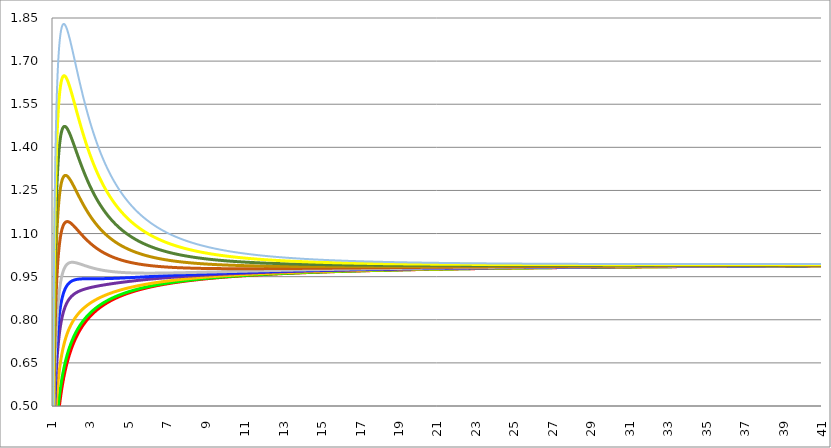
| Category | Series 1 | Series 0 | Series 3 | Series 4 | Series 5 | Series 2 | Series 6 | Series 7 | Series 8 | Series 9 | Series 10 |
|---|---|---|---|---|---|---|---|---|---|---|---|
| 1.0 | 0 | 0 | 0 | 0 | 0 | 0 | 0 | 0 | 0 | 0 | 0 |
| 1.02 | 0.14 | 0.156 | 0.196 | 0.249 | 0.276 | 0.308 | 0.371 | 0.435 | 0.5 | 0.567 | 0.633 |
| 1.04 | 0.196 | 0.218 | 0.272 | 0.344 | 0.381 | 0.425 | 0.511 | 0.599 | 0.689 | 0.779 | 0.871 |
| 1.06 | 0.238 | 0.263 | 0.327 | 0.412 | 0.456 | 0.508 | 0.609 | 0.714 | 0.821 | 0.929 | 1.038 |
| 1.08 | 0.272 | 0.3 | 0.371 | 0.466 | 0.514 | 0.573 | 0.686 | 0.804 | 0.923 | 1.044 | 1.166 |
| 1.1 | 0.302 | 0.331 | 0.407 | 0.51 | 0.562 | 0.626 | 0.749 | 0.876 | 1.006 | 1.137 | 1.27 |
| 1.12 | 0.327 | 0.358 | 0.439 | 0.547 | 0.603 | 0.67 | 0.801 | 0.936 | 1.074 | 1.214 | 1.355 |
| 1.14 | 0.35 | 0.383 | 0.466 | 0.579 | 0.637 | 0.708 | 0.845 | 0.987 | 1.132 | 1.279 | 1.427 |
| 1.16 | 0.371 | 0.404 | 0.49 | 0.607 | 0.667 | 0.74 | 0.882 | 1.03 | 1.181 | 1.333 | 1.488 |
| 1.18 | 0.391 | 0.424 | 0.512 | 0.632 | 0.694 | 0.769 | 0.915 | 1.067 | 1.223 | 1.38 | 1.54 |
| 1.2 | 0.408 | 0.442 | 0.531 | 0.654 | 0.717 | 0.793 | 0.943 | 1.099 | 1.259 | 1.421 | 1.584 |
| 1.22 | 0.425 | 0.459 | 0.549 | 0.673 | 0.737 | 0.815 | 0.968 | 1.127 | 1.29 | 1.456 | 1.623 |
| 1.24 | 0.44 | 0.474 | 0.565 | 0.69 | 0.756 | 0.835 | 0.99 | 1.152 | 1.317 | 1.486 | 1.656 |
| 1.26 | 0.454 | 0.489 | 0.58 | 0.706 | 0.772 | 0.852 | 1.009 | 1.173 | 1.341 | 1.512 | 1.685 |
| 1.28 | 0.468 | 0.502 | 0.594 | 0.721 | 0.787 | 0.868 | 1.026 | 1.192 | 1.362 | 1.535 | 1.71 |
| 1.3 | 0.48 | 0.515 | 0.606 | 0.733 | 0.8 | 0.881 | 1.041 | 1.208 | 1.38 | 1.554 | 1.731 |
| 1.32 | 0.492 | 0.527 | 0.618 | 0.745 | 0.812 | 0.894 | 1.055 | 1.223 | 1.395 | 1.571 | 1.749 |
| 1.34 | 0.504 | 0.538 | 0.629 | 0.756 | 0.823 | 0.905 | 1.066 | 1.235 | 1.409 | 1.586 | 1.765 |
| 1.36 | 0.514 | 0.548 | 0.639 | 0.766 | 0.833 | 0.915 | 1.077 | 1.246 | 1.421 | 1.598 | 1.778 |
| 1.38 | 0.525 | 0.558 | 0.648 | 0.775 | 0.842 | 0.924 | 1.086 | 1.256 | 1.431 | 1.609 | 1.79 |
| 1.4 | 0.535 | 0.568 | 0.657 | 0.783 | 0.85 | 0.932 | 1.094 | 1.264 | 1.439 | 1.618 | 1.799 |
| 1.42 | 0.544 | 0.577 | 0.665 | 0.791 | 0.858 | 0.939 | 1.101 | 1.271 | 1.447 | 1.626 | 1.807 |
| 1.44 | 0.553 | 0.585 | 0.673 | 0.798 | 0.865 | 0.946 | 1.107 | 1.277 | 1.453 | 1.632 | 1.814 |
| 1.46 | 0.561 | 0.593 | 0.68 | 0.805 | 0.871 | 0.952 | 1.113 | 1.283 | 1.458 | 1.637 | 1.819 |
| 1.48 | 0.569 | 0.601 | 0.687 | 0.811 | 0.877 | 0.957 | 1.118 | 1.287 | 1.462 | 1.641 | 1.823 |
| 1.5 | 0.577 | 0.609 | 0.694 | 0.816 | 0.882 | 0.962 | 1.122 | 1.291 | 1.466 | 1.644 | 1.826 |
| 1.52 | 0.585 | 0.616 | 0.7 | 0.822 | 0.887 | 0.967 | 1.126 | 1.294 | 1.468 | 1.647 | 1.828 |
| 1.54 | 0.592 | 0.623 | 0.706 | 0.827 | 0.891 | 0.971 | 1.129 | 1.297 | 1.47 | 1.648 | 1.829 |
| 1.56 | 0.599 | 0.629 | 0.712 | 0.831 | 0.895 | 0.974 | 1.132 | 1.299 | 1.472 | 1.649 | 1.829 |
| 1.58 | 0.606 | 0.635 | 0.717 | 0.835 | 0.899 | 0.977 | 1.134 | 1.3 | 1.473 | 1.649 | 1.829 |
| 1.6 | 0.612 | 0.642 | 0.722 | 0.839 | 0.902 | 0.98 | 1.136 | 1.301 | 1.473 | 1.649 | 1.828 |
| 1.62 | 0.619 | 0.647 | 0.727 | 0.843 | 0.906 | 0.983 | 1.138 | 1.302 | 1.473 | 1.648 | 1.826 |
| 1.64 | 0.625 | 0.653 | 0.732 | 0.847 | 0.909 | 0.985 | 1.139 | 1.302 | 1.472 | 1.647 | 1.824 |
| 1.66 | 0.631 | 0.659 | 0.736 | 0.85 | 0.911 | 0.987 | 1.14 | 1.302 | 1.471 | 1.645 | 1.822 |
| 1.68 | 0.636 | 0.664 | 0.74 | 0.853 | 0.914 | 0.989 | 1.141 | 1.302 | 1.47 | 1.643 | 1.819 |
| 1.700000000000001 | 0.642 | 0.669 | 0.744 | 0.856 | 0.916 | 0.991 | 1.141 | 1.302 | 1.469 | 1.641 | 1.816 |
| 1.720000000000001 | 0.647 | 0.674 | 0.748 | 0.858 | 0.918 | 0.992 | 1.141 | 1.301 | 1.467 | 1.638 | 1.812 |
| 1.740000000000001 | 0.652 | 0.679 | 0.752 | 0.861 | 0.92 | 0.994 | 1.142 | 1.3 | 1.465 | 1.635 | 1.808 |
| 1.760000000000001 | 0.657 | 0.683 | 0.756 | 0.863 | 0.922 | 0.995 | 1.142 | 1.299 | 1.463 | 1.632 | 1.804 |
| 1.780000000000001 | 0.662 | 0.688 | 0.759 | 0.866 | 0.924 | 0.996 | 1.141 | 1.297 | 1.46 | 1.628 | 1.8 |
| 1.800000000000001 | 0.667 | 0.692 | 0.763 | 0.868 | 0.925 | 0.997 | 1.141 | 1.296 | 1.458 | 1.625 | 1.795 |
| 1.820000000000001 | 0.671 | 0.696 | 0.766 | 0.87 | 0.927 | 0.997 | 1.14 | 1.294 | 1.455 | 1.621 | 1.79 |
| 1.840000000000001 | 0.676 | 0.7 | 0.769 | 0.872 | 0.928 | 0.998 | 1.14 | 1.292 | 1.452 | 1.617 | 1.785 |
| 1.860000000000001 | 0.68 | 0.704 | 0.772 | 0.874 | 0.929 | 0.998 | 1.139 | 1.29 | 1.449 | 1.613 | 1.78 |
| 1.880000000000001 | 0.684 | 0.708 | 0.775 | 0.875 | 0.93 | 0.999 | 1.138 | 1.288 | 1.446 | 1.608 | 1.775 |
| 1.900000000000001 | 0.688 | 0.712 | 0.778 | 0.877 | 0.931 | 0.999 | 1.137 | 1.286 | 1.443 | 1.604 | 1.769 |
| 1.920000000000001 | 0.692 | 0.715 | 0.78 | 0.878 | 0.932 | 1 | 1.136 | 1.284 | 1.439 | 1.6 | 1.764 |
| 1.940000000000001 | 0.696 | 0.719 | 0.783 | 0.88 | 0.933 | 1 | 1.135 | 1.282 | 1.436 | 1.595 | 1.758 |
| 1.960000000000001 | 0.7 | 0.722 | 0.786 | 0.881 | 0.934 | 1 | 1.134 | 1.28 | 1.432 | 1.591 | 1.753 |
| 1.980000000000001 | 0.704 | 0.726 | 0.788 | 0.883 | 0.935 | 1 | 1.133 | 1.277 | 1.429 | 1.586 | 1.747 |
| 2.000000000000001 | 0.707 | 0.729 | 0.791 | 0.884 | 0.935 | 1 | 1.132 | 1.275 | 1.425 | 1.581 | 1.741 |
| 2.020000000000001 | 0.711 | 0.732 | 0.793 | 0.885 | 0.936 | 1 | 1.131 | 1.272 | 1.422 | 1.576 | 1.735 |
| 2.040000000000001 | 0.714 | 0.735 | 0.795 | 0.886 | 0.937 | 1 | 1.129 | 1.27 | 1.418 | 1.572 | 1.729 |
| 2.060000000000001 | 0.717 | 0.738 | 0.797 | 0.887 | 0.937 | 1 | 1.128 | 1.267 | 1.414 | 1.567 | 1.723 |
| 2.080000000000001 | 0.721 | 0.741 | 0.8 | 0.888 | 0.938 | 1 | 1.127 | 1.265 | 1.41 | 1.562 | 1.717 |
| 2.100000000000001 | 0.724 | 0.744 | 0.802 | 0.889 | 0.938 | 0.999 | 1.125 | 1.262 | 1.407 | 1.557 | 1.711 |
| 2.120000000000001 | 0.727 | 0.747 | 0.804 | 0.89 | 0.939 | 0.999 | 1.124 | 1.259 | 1.403 | 1.552 | 1.705 |
| 2.140000000000001 | 0.73 | 0.75 | 0.806 | 0.891 | 0.939 | 0.999 | 1.122 | 1.257 | 1.399 | 1.547 | 1.699 |
| 2.160000000000001 | 0.733 | 0.752 | 0.808 | 0.892 | 0.939 | 0.999 | 1.121 | 1.254 | 1.395 | 1.542 | 1.693 |
| 2.180000000000001 | 0.736 | 0.755 | 0.809 | 0.893 | 0.94 | 0.998 | 1.119 | 1.252 | 1.392 | 1.537 | 1.688 |
| 2.200000000000001 | 0.739 | 0.757 | 0.811 | 0.894 | 0.94 | 0.998 | 1.118 | 1.249 | 1.388 | 1.533 | 1.682 |
| 2.220000000000001 | 0.741 | 0.76 | 0.813 | 0.895 | 0.94 | 0.998 | 1.116 | 1.246 | 1.384 | 1.528 | 1.676 |
| 2.240000000000001 | 0.744 | 0.762 | 0.815 | 0.895 | 0.941 | 0.997 | 1.115 | 1.244 | 1.38 | 1.523 | 1.67 |
| 2.260000000000001 | 0.747 | 0.765 | 0.817 | 0.896 | 0.941 | 0.997 | 1.113 | 1.241 | 1.376 | 1.518 | 1.664 |
| 2.280000000000001 | 0.749 | 0.767 | 0.818 | 0.897 | 0.941 | 0.997 | 1.112 | 1.238 | 1.373 | 1.513 | 1.658 |
| 2.300000000000001 | 0.752 | 0.769 | 0.82 | 0.898 | 0.941 | 0.996 | 1.11 | 1.236 | 1.369 | 1.508 | 1.652 |
| 2.320000000000001 | 0.754 | 0.772 | 0.821 | 0.898 | 0.941 | 0.996 | 1.109 | 1.233 | 1.365 | 1.503 | 1.646 |
| 2.340000000000001 | 0.757 | 0.774 | 0.823 | 0.899 | 0.941 | 0.995 | 1.107 | 1.23 | 1.362 | 1.499 | 1.64 |
| 2.360000000000001 | 0.759 | 0.776 | 0.824 | 0.899 | 0.942 | 0.995 | 1.106 | 1.228 | 1.358 | 1.494 | 1.634 |
| 2.380000000000001 | 0.761 | 0.778 | 0.826 | 0.9 | 0.942 | 0.995 | 1.104 | 1.225 | 1.354 | 1.489 | 1.629 |
| 2.400000000000001 | 0.764 | 0.78 | 0.827 | 0.901 | 0.942 | 0.994 | 1.103 | 1.223 | 1.351 | 1.484 | 1.623 |
| 2.420000000000001 | 0.766 | 0.782 | 0.829 | 0.901 | 0.942 | 0.994 | 1.101 | 1.22 | 1.347 | 1.48 | 1.617 |
| 2.440000000000001 | 0.768 | 0.784 | 0.83 | 0.902 | 0.942 | 0.993 | 1.1 | 1.218 | 1.343 | 1.475 | 1.612 |
| 2.460000000000001 | 0.77 | 0.786 | 0.832 | 0.902 | 0.942 | 0.993 | 1.098 | 1.215 | 1.34 | 1.471 | 1.606 |
| 2.480000000000001 | 0.773 | 0.788 | 0.833 | 0.903 | 0.942 | 0.992 | 1.097 | 1.212 | 1.336 | 1.466 | 1.601 |
| 2.500000000000001 | 0.775 | 0.79 | 0.834 | 0.903 | 0.942 | 0.992 | 1.095 | 1.21 | 1.333 | 1.462 | 1.595 |
| 2.520000000000001 | 0.777 | 0.792 | 0.836 | 0.904 | 0.942 | 0.992 | 1.094 | 1.207 | 1.329 | 1.457 | 1.59 |
| 2.540000000000001 | 0.779 | 0.794 | 0.837 | 0.904 | 0.942 | 0.991 | 1.093 | 1.205 | 1.326 | 1.453 | 1.584 |
| 2.560000000000001 | 0.781 | 0.795 | 0.838 | 0.905 | 0.943 | 0.991 | 1.091 | 1.203 | 1.322 | 1.448 | 1.579 |
| 2.580000000000001 | 0.783 | 0.797 | 0.839 | 0.905 | 0.943 | 0.99 | 1.09 | 1.2 | 1.319 | 1.444 | 1.573 |
| 2.600000000000001 | 0.784 | 0.799 | 0.84 | 0.906 | 0.943 | 0.99 | 1.088 | 1.198 | 1.316 | 1.439 | 1.568 |
| 2.620000000000001 | 0.786 | 0.801 | 0.842 | 0.906 | 0.943 | 0.989 | 1.087 | 1.195 | 1.312 | 1.435 | 1.563 |
| 2.640000000000001 | 0.788 | 0.802 | 0.843 | 0.907 | 0.943 | 0.989 | 1.085 | 1.193 | 1.309 | 1.431 | 1.558 |
| 2.660000000000001 | 0.79 | 0.804 | 0.844 | 0.907 | 0.943 | 0.988 | 1.084 | 1.191 | 1.306 | 1.427 | 1.552 |
| 2.680000000000001 | 0.792 | 0.805 | 0.845 | 0.907 | 0.943 | 0.988 | 1.083 | 1.188 | 1.302 | 1.422 | 1.547 |
| 2.700000000000001 | 0.793 | 0.807 | 0.846 | 0.908 | 0.943 | 0.987 | 1.081 | 1.186 | 1.299 | 1.418 | 1.542 |
| 2.720000000000001 | 0.795 | 0.809 | 0.847 | 0.908 | 0.943 | 0.987 | 1.08 | 1.184 | 1.296 | 1.414 | 1.537 |
| 2.740000000000001 | 0.797 | 0.81 | 0.848 | 0.908 | 0.943 | 0.987 | 1.079 | 1.182 | 1.293 | 1.41 | 1.532 |
| 2.760000000000001 | 0.799 | 0.812 | 0.849 | 0.909 | 0.943 | 0.986 | 1.077 | 1.179 | 1.29 | 1.406 | 1.527 |
| 2.780000000000001 | 0.8 | 0.813 | 0.85 | 0.909 | 0.943 | 0.986 | 1.076 | 1.177 | 1.287 | 1.402 | 1.522 |
| 2.800000000000002 | 0.802 | 0.814 | 0.851 | 0.91 | 0.943 | 0.985 | 1.075 | 1.175 | 1.283 | 1.398 | 1.518 |
| 2.820000000000002 | 0.803 | 0.816 | 0.852 | 0.91 | 0.943 | 0.985 | 1.074 | 1.173 | 1.28 | 1.394 | 1.513 |
| 2.840000000000002 | 0.805 | 0.817 | 0.853 | 0.91 | 0.943 | 0.984 | 1.072 | 1.171 | 1.277 | 1.39 | 1.508 |
| 2.860000000000002 | 0.806 | 0.819 | 0.854 | 0.911 | 0.943 | 0.984 | 1.071 | 1.169 | 1.274 | 1.387 | 1.503 |
| 2.880000000000002 | 0.808 | 0.82 | 0.855 | 0.911 | 0.943 | 0.984 | 1.07 | 1.167 | 1.272 | 1.383 | 1.499 |
| 2.900000000000002 | 0.809 | 0.821 | 0.856 | 0.911 | 0.943 | 0.983 | 1.069 | 1.165 | 1.269 | 1.379 | 1.494 |
| 2.920000000000002 | 0.811 | 0.823 | 0.857 | 0.912 | 0.943 | 0.983 | 1.067 | 1.163 | 1.266 | 1.375 | 1.49 |
| 2.940000000000002 | 0.812 | 0.824 | 0.858 | 0.912 | 0.943 | 0.982 | 1.066 | 1.161 | 1.263 | 1.372 | 1.485 |
| 2.960000000000002 | 0.814 | 0.825 | 0.859 | 0.912 | 0.943 | 0.982 | 1.065 | 1.159 | 1.26 | 1.368 | 1.481 |
| 2.980000000000002 | 0.815 | 0.827 | 0.86 | 0.913 | 0.943 | 0.982 | 1.064 | 1.157 | 1.257 | 1.364 | 1.476 |
| 3.000000000000002 | 0.816 | 0.828 | 0.861 | 0.913 | 0.943 | 0.981 | 1.063 | 1.155 | 1.255 | 1.361 | 1.472 |
| 3.020000000000002 | 0.818 | 0.829 | 0.862 | 0.913 | 0.943 | 0.981 | 1.062 | 1.153 | 1.252 | 1.357 | 1.468 |
| 3.040000000000002 | 0.819 | 0.83 | 0.862 | 0.913 | 0.943 | 0.981 | 1.061 | 1.151 | 1.249 | 1.354 | 1.463 |
| 3.060000000000002 | 0.82 | 0.831 | 0.863 | 0.914 | 0.943 | 0.98 | 1.06 | 1.149 | 1.247 | 1.35 | 1.459 |
| 3.080000000000002 | 0.822 | 0.833 | 0.864 | 0.914 | 0.943 | 0.98 | 1.058 | 1.147 | 1.244 | 1.347 | 1.455 |
| 3.100000000000002 | 0.823 | 0.834 | 0.865 | 0.914 | 0.943 | 0.979 | 1.057 | 1.145 | 1.241 | 1.344 | 1.451 |
| 3.120000000000002 | 0.824 | 0.835 | 0.866 | 0.915 | 0.943 | 0.979 | 1.056 | 1.144 | 1.239 | 1.34 | 1.447 |
| 3.140000000000002 | 0.826 | 0.836 | 0.866 | 0.915 | 0.943 | 0.979 | 1.055 | 1.142 | 1.236 | 1.337 | 1.443 |
| 3.160000000000002 | 0.827 | 0.837 | 0.867 | 0.915 | 0.943 | 0.978 | 1.054 | 1.14 | 1.234 | 1.334 | 1.439 |
| 3.180000000000002 | 0.828 | 0.838 | 0.868 | 0.915 | 0.943 | 0.978 | 1.053 | 1.138 | 1.231 | 1.33 | 1.435 |
| 3.200000000000002 | 0.829 | 0.839 | 0.869 | 0.916 | 0.943 | 0.978 | 1.052 | 1.137 | 1.229 | 1.327 | 1.431 |
| 3.220000000000002 | 0.83 | 0.84 | 0.869 | 0.916 | 0.943 | 0.977 | 1.051 | 1.135 | 1.226 | 1.324 | 1.427 |
| 3.240000000000002 | 0.831 | 0.841 | 0.87 | 0.916 | 0.943 | 0.977 | 1.05 | 1.133 | 1.224 | 1.321 | 1.423 |
| 3.260000000000002 | 0.833 | 0.842 | 0.871 | 0.917 | 0.943 | 0.977 | 1.049 | 1.132 | 1.222 | 1.318 | 1.419 |
| 3.280000000000002 | 0.834 | 0.843 | 0.872 | 0.917 | 0.943 | 0.977 | 1.048 | 1.13 | 1.219 | 1.315 | 1.415 |
| 3.300000000000002 | 0.835 | 0.844 | 0.872 | 0.917 | 0.943 | 0.976 | 1.047 | 1.128 | 1.217 | 1.312 | 1.412 |
| 3.320000000000002 | 0.836 | 0.845 | 0.873 | 0.917 | 0.943 | 0.976 | 1.046 | 1.127 | 1.215 | 1.309 | 1.408 |
| 3.340000000000002 | 0.837 | 0.846 | 0.874 | 0.918 | 0.943 | 0.976 | 1.046 | 1.125 | 1.212 | 1.306 | 1.404 |
| 3.360000000000002 | 0.838 | 0.847 | 0.874 | 0.918 | 0.943 | 0.975 | 1.045 | 1.124 | 1.21 | 1.303 | 1.401 |
| 3.380000000000002 | 0.839 | 0.848 | 0.875 | 0.918 | 0.943 | 0.975 | 1.044 | 1.122 | 1.208 | 1.3 | 1.397 |
| 3.400000000000002 | 0.84 | 0.849 | 0.876 | 0.918 | 0.943 | 0.975 | 1.043 | 1.12 | 1.206 | 1.297 | 1.394 |
| 3.420000000000002 | 0.841 | 0.85 | 0.876 | 0.919 | 0.943 | 0.974 | 1.042 | 1.119 | 1.204 | 1.294 | 1.39 |
| 3.440000000000002 | 0.842 | 0.851 | 0.877 | 0.919 | 0.943 | 0.974 | 1.041 | 1.117 | 1.201 | 1.292 | 1.387 |
| 3.460000000000002 | 0.843 | 0.852 | 0.878 | 0.919 | 0.943 | 0.974 | 1.04 | 1.116 | 1.199 | 1.289 | 1.383 |
| 3.480000000000002 | 0.844 | 0.853 | 0.878 | 0.919 | 0.943 | 0.974 | 1.039 | 1.115 | 1.197 | 1.286 | 1.38 |
| 3.500000000000002 | 0.845 | 0.854 | 0.879 | 0.92 | 0.943 | 0.973 | 1.039 | 1.113 | 1.195 | 1.283 | 1.377 |
| 3.520000000000002 | 0.846 | 0.855 | 0.88 | 0.92 | 0.943 | 0.973 | 1.038 | 1.112 | 1.193 | 1.281 | 1.373 |
| 3.540000000000002 | 0.847 | 0.855 | 0.88 | 0.92 | 0.943 | 0.973 | 1.037 | 1.11 | 1.191 | 1.278 | 1.37 |
| 3.560000000000002 | 0.848 | 0.856 | 0.881 | 0.92 | 0.943 | 0.973 | 1.036 | 1.109 | 1.189 | 1.276 | 1.367 |
| 3.580000000000002 | 0.849 | 0.857 | 0.881 | 0.92 | 0.943 | 0.972 | 1.035 | 1.108 | 1.187 | 1.273 | 1.364 |
| 3.600000000000002 | 0.85 | 0.858 | 0.882 | 0.921 | 0.943 | 0.972 | 1.035 | 1.106 | 1.185 | 1.27 | 1.36 |
| 3.620000000000002 | 0.851 | 0.859 | 0.883 | 0.921 | 0.943 | 0.972 | 1.034 | 1.105 | 1.183 | 1.268 | 1.357 |
| 3.640000000000002 | 0.852 | 0.86 | 0.883 | 0.921 | 0.943 | 0.972 | 1.033 | 1.104 | 1.181 | 1.265 | 1.354 |
| 3.660000000000002 | 0.853 | 0.86 | 0.884 | 0.921 | 0.943 | 0.971 | 1.032 | 1.102 | 1.18 | 1.263 | 1.351 |
| 3.680000000000002 | 0.853 | 0.861 | 0.884 | 0.922 | 0.943 | 0.971 | 1.032 | 1.101 | 1.178 | 1.26 | 1.348 |
| 3.700000000000002 | 0.854 | 0.862 | 0.885 | 0.922 | 0.943 | 0.971 | 1.031 | 1.1 | 1.176 | 1.258 | 1.345 |
| 3.720000000000002 | 0.855 | 0.863 | 0.885 | 0.922 | 0.943 | 0.971 | 1.03 | 1.099 | 1.174 | 1.256 | 1.342 |
| 3.740000000000002 | 0.856 | 0.864 | 0.886 | 0.922 | 0.943 | 0.971 | 1.03 | 1.097 | 1.172 | 1.253 | 1.339 |
| 3.760000000000002 | 0.857 | 0.864 | 0.887 | 0.922 | 0.943 | 0.97 | 1.029 | 1.096 | 1.171 | 1.251 | 1.336 |
| 3.780000000000002 | 0.858 | 0.865 | 0.887 | 0.923 | 0.943 | 0.97 | 1.028 | 1.095 | 1.169 | 1.249 | 1.333 |
| 3.800000000000002 | 0.858 | 0.866 | 0.888 | 0.923 | 0.943 | 0.97 | 1.028 | 1.094 | 1.167 | 1.246 | 1.33 |
| 3.820000000000002 | 0.859 | 0.867 | 0.888 | 0.923 | 0.943 | 0.97 | 1.027 | 1.092 | 1.165 | 1.244 | 1.328 |
| 3.840000000000002 | 0.86 | 0.867 | 0.889 | 0.923 | 0.943 | 0.97 | 1.026 | 1.091 | 1.164 | 1.242 | 1.325 |
| 3.860000000000002 | 0.861 | 0.868 | 0.889 | 0.923 | 0.943 | 0.969 | 1.026 | 1.09 | 1.162 | 1.24 | 1.322 |
| 3.880000000000002 | 0.862 | 0.869 | 0.89 | 0.924 | 0.943 | 0.969 | 1.025 | 1.089 | 1.16 | 1.237 | 1.319 |
| 3.900000000000003 | 0.862 | 0.869 | 0.89 | 0.924 | 0.944 | 0.969 | 1.024 | 1.088 | 1.159 | 1.235 | 1.317 |
| 3.920000000000003 | 0.863 | 0.87 | 0.891 | 0.924 | 0.944 | 0.969 | 1.024 | 1.087 | 1.157 | 1.233 | 1.314 |
| 3.940000000000003 | 0.864 | 0.871 | 0.891 | 0.924 | 0.944 | 0.969 | 1.023 | 1.086 | 1.155 | 1.231 | 1.311 |
| 3.960000000000003 | 0.865 | 0.871 | 0.892 | 0.925 | 0.944 | 0.969 | 1.022 | 1.085 | 1.154 | 1.229 | 1.309 |
| 3.980000000000003 | 0.865 | 0.872 | 0.892 | 0.925 | 0.944 | 0.968 | 1.022 | 1.084 | 1.152 | 1.227 | 1.306 |
| 4.000000000000003 | 0.866 | 0.873 | 0.893 | 0.925 | 0.944 | 0.968 | 1.021 | 1.083 | 1.151 | 1.225 | 1.304 |
| 4.020000000000002 | 0.867 | 0.873 | 0.893 | 0.925 | 0.944 | 0.968 | 1.021 | 1.081 | 1.149 | 1.223 | 1.301 |
| 4.040000000000002 | 0.867 | 0.874 | 0.894 | 0.925 | 0.944 | 0.968 | 1.02 | 1.08 | 1.148 | 1.221 | 1.298 |
| 4.060000000000001 | 0.868 | 0.875 | 0.894 | 0.926 | 0.944 | 0.968 | 1.02 | 1.079 | 1.146 | 1.219 | 1.296 |
| 4.080000000000001 | 0.869 | 0.875 | 0.895 | 0.926 | 0.944 | 0.968 | 1.019 | 1.078 | 1.145 | 1.217 | 1.294 |
| 4.100000000000001 | 0.87 | 0.876 | 0.895 | 0.926 | 0.944 | 0.967 | 1.018 | 1.077 | 1.143 | 1.215 | 1.291 |
| 4.12 | 0.87 | 0.877 | 0.895 | 0.926 | 0.944 | 0.967 | 1.018 | 1.076 | 1.142 | 1.213 | 1.289 |
| 4.14 | 0.871 | 0.877 | 0.896 | 0.926 | 0.944 | 0.967 | 1.017 | 1.076 | 1.14 | 1.211 | 1.286 |
| 4.159999999999999 | 0.872 | 0.878 | 0.896 | 0.926 | 0.944 | 0.967 | 1.017 | 1.075 | 1.139 | 1.209 | 1.284 |
| 4.179999999999999 | 0.872 | 0.878 | 0.897 | 0.927 | 0.944 | 0.967 | 1.016 | 1.074 | 1.138 | 1.207 | 1.282 |
| 4.199999999999998 | 0.873 | 0.879 | 0.897 | 0.927 | 0.944 | 0.967 | 1.016 | 1.073 | 1.136 | 1.205 | 1.279 |
| 4.219999999999998 | 0.874 | 0.88 | 0.898 | 0.927 | 0.944 | 0.967 | 1.015 | 1.072 | 1.135 | 1.204 | 1.277 |
| 4.239999999999997 | 0.874 | 0.88 | 0.898 | 0.927 | 0.944 | 0.967 | 1.015 | 1.071 | 1.134 | 1.202 | 1.275 |
| 4.259999999999997 | 0.875 | 0.881 | 0.899 | 0.927 | 0.944 | 0.966 | 1.014 | 1.07 | 1.132 | 1.2 | 1.272 |
| 4.279999999999996 | 0.875 | 0.881 | 0.899 | 0.928 | 0.944 | 0.966 | 1.014 | 1.069 | 1.131 | 1.198 | 1.27 |
| 4.299999999999996 | 0.876 | 0.882 | 0.899 | 0.928 | 0.944 | 0.966 | 1.013 | 1.068 | 1.13 | 1.196 | 1.268 |
| 4.319999999999996 | 0.877 | 0.883 | 0.9 | 0.928 | 0.944 | 0.966 | 1.013 | 1.067 | 1.128 | 1.195 | 1.266 |
| 4.339999999999995 | 0.877 | 0.883 | 0.9 | 0.928 | 0.945 | 0.966 | 1.012 | 1.066 | 1.127 | 1.193 | 1.264 |
| 4.359999999999995 | 0.878 | 0.884 | 0.901 | 0.928 | 0.945 | 0.966 | 1.012 | 1.066 | 1.126 | 1.191 | 1.262 |
| 4.379999999999994 | 0.878 | 0.884 | 0.901 | 0.929 | 0.945 | 0.966 | 1.011 | 1.065 | 1.124 | 1.19 | 1.259 |
| 4.399999999999994 | 0.879 | 0.885 | 0.901 | 0.929 | 0.945 | 0.966 | 1.011 | 1.064 | 1.123 | 1.188 | 1.257 |
| 4.419999999999994 | 0.88 | 0.885 | 0.902 | 0.929 | 0.945 | 0.965 | 1.011 | 1.063 | 1.122 | 1.186 | 1.255 |
| 4.439999999999993 | 0.88 | 0.886 | 0.902 | 0.929 | 0.945 | 0.965 | 1.01 | 1.062 | 1.121 | 1.185 | 1.253 |
| 4.459999999999993 | 0.881 | 0.886 | 0.903 | 0.929 | 0.945 | 0.965 | 1.01 | 1.062 | 1.12 | 1.183 | 1.251 |
| 4.479999999999992 | 0.881 | 0.887 | 0.903 | 0.929 | 0.945 | 0.965 | 1.009 | 1.061 | 1.118 | 1.182 | 1.249 |
| 4.499999999999992 | 0.882 | 0.887 | 0.903 | 0.93 | 0.945 | 0.965 | 1.009 | 1.06 | 1.117 | 1.18 | 1.247 |
| 4.519999999999992 | 0.882 | 0.888 | 0.904 | 0.93 | 0.945 | 0.965 | 1.008 | 1.059 | 1.116 | 1.178 | 1.245 |
| 4.539999999999991 | 0.883 | 0.888 | 0.904 | 0.93 | 0.945 | 0.965 | 1.008 | 1.058 | 1.115 | 1.177 | 1.243 |
| 4.559999999999991 | 0.884 | 0.889 | 0.905 | 0.93 | 0.945 | 0.965 | 1.008 | 1.058 | 1.114 | 1.175 | 1.241 |
| 4.57999999999999 | 0.884 | 0.889 | 0.905 | 0.93 | 0.945 | 0.965 | 1.007 | 1.057 | 1.113 | 1.174 | 1.239 |
| 4.59999999999999 | 0.885 | 0.89 | 0.905 | 0.93 | 0.945 | 0.965 | 1.007 | 1.056 | 1.112 | 1.172 | 1.238 |
| 4.619999999999989 | 0.885 | 0.89 | 0.906 | 0.931 | 0.945 | 0.965 | 1.006 | 1.055 | 1.111 | 1.171 | 1.236 |
| 4.639999999999989 | 0.886 | 0.891 | 0.906 | 0.931 | 0.945 | 0.964 | 1.006 | 1.055 | 1.109 | 1.169 | 1.234 |
| 4.659999999999988 | 0.886 | 0.891 | 0.906 | 0.931 | 0.945 | 0.964 | 1.006 | 1.054 | 1.108 | 1.168 | 1.232 |
| 4.679999999999988 | 0.887 | 0.892 | 0.907 | 0.931 | 0.946 | 0.964 | 1.005 | 1.053 | 1.107 | 1.167 | 1.23 |
| 4.699999999999988 | 0.887 | 0.892 | 0.907 | 0.931 | 0.946 | 0.964 | 1.005 | 1.053 | 1.106 | 1.165 | 1.228 |
| 4.719999999999987 | 0.888 | 0.893 | 0.907 | 0.932 | 0.946 | 0.964 | 1.005 | 1.052 | 1.105 | 1.164 | 1.227 |
| 4.739999999999986 | 0.888 | 0.893 | 0.908 | 0.932 | 0.946 | 0.964 | 1.004 | 1.051 | 1.104 | 1.162 | 1.225 |
| 4.759999999999986 | 0.889 | 0.894 | 0.908 | 0.932 | 0.946 | 0.964 | 1.004 | 1.051 | 1.103 | 1.161 | 1.223 |
| 4.779999999999985 | 0.889 | 0.894 | 0.909 | 0.932 | 0.946 | 0.964 | 1.004 | 1.05 | 1.102 | 1.16 | 1.221 |
| 4.799999999999985 | 0.89 | 0.895 | 0.909 | 0.932 | 0.946 | 0.964 | 1.003 | 1.049 | 1.101 | 1.158 | 1.22 |
| 4.819999999999985 | 0.89 | 0.895 | 0.909 | 0.932 | 0.946 | 0.964 | 1.003 | 1.049 | 1.1 | 1.157 | 1.218 |
| 4.839999999999984 | 0.891 | 0.895 | 0.91 | 0.933 | 0.946 | 0.964 | 1.003 | 1.048 | 1.099 | 1.156 | 1.216 |
| 4.859999999999984 | 0.891 | 0.896 | 0.91 | 0.933 | 0.946 | 0.964 | 1.002 | 1.047 | 1.098 | 1.154 | 1.215 |
| 4.879999999999984 | 0.892 | 0.896 | 0.91 | 0.933 | 0.946 | 0.964 | 1.002 | 1.047 | 1.097 | 1.153 | 1.213 |
| 4.899999999999983 | 0.892 | 0.897 | 0.911 | 0.933 | 0.946 | 0.964 | 1.002 | 1.046 | 1.096 | 1.152 | 1.211 |
| 4.919999999999983 | 0.893 | 0.897 | 0.911 | 0.933 | 0.946 | 0.964 | 1.001 | 1.045 | 1.095 | 1.15 | 1.21 |
| 4.939999999999982 | 0.893 | 0.898 | 0.911 | 0.933 | 0.946 | 0.963 | 1.001 | 1.045 | 1.095 | 1.149 | 1.208 |
| 4.959999999999982 | 0.894 | 0.898 | 0.912 | 0.933 | 0.946 | 0.963 | 1.001 | 1.044 | 1.094 | 1.148 | 1.206 |
| 4.979999999999981 | 0.894 | 0.898 | 0.912 | 0.934 | 0.947 | 0.963 | 1 | 1.044 | 1.093 | 1.147 | 1.205 |
| 4.999999999999981 | 0.894 | 0.899 | 0.912 | 0.934 | 0.947 | 0.963 | 1 | 1.043 | 1.092 | 1.145 | 1.203 |
| 5.019999999999981 | 0.895 | 0.899 | 0.912 | 0.934 | 0.947 | 0.963 | 1 | 1.042 | 1.091 | 1.144 | 1.202 |
| 5.03999999999998 | 0.895 | 0.9 | 0.913 | 0.934 | 0.947 | 0.963 | 0.999 | 1.042 | 1.09 | 1.143 | 1.2 |
| 5.05999999999998 | 0.896 | 0.9 | 0.913 | 0.934 | 0.947 | 0.963 | 0.999 | 1.041 | 1.089 | 1.142 | 1.199 |
| 5.07999999999998 | 0.896 | 0.901 | 0.913 | 0.934 | 0.947 | 0.963 | 0.999 | 1.041 | 1.088 | 1.141 | 1.197 |
| 5.09999999999998 | 0.897 | 0.901 | 0.914 | 0.935 | 0.947 | 0.963 | 0.999 | 1.04 | 1.087 | 1.139 | 1.196 |
| 5.119999999999979 | 0.897 | 0.901 | 0.914 | 0.935 | 0.947 | 0.963 | 0.998 | 1.04 | 1.087 | 1.138 | 1.194 |
| 5.139999999999978 | 0.897 | 0.902 | 0.914 | 0.935 | 0.947 | 0.963 | 0.998 | 1.039 | 1.086 | 1.137 | 1.193 |
| 5.159999999999978 | 0.898 | 0.902 | 0.915 | 0.935 | 0.947 | 0.963 | 0.998 | 1.039 | 1.085 | 1.136 | 1.191 |
| 5.179999999999977 | 0.898 | 0.902 | 0.915 | 0.935 | 0.947 | 0.963 | 0.997 | 1.038 | 1.084 | 1.135 | 1.19 |
| 5.199999999999977 | 0.899 | 0.903 | 0.915 | 0.935 | 0.947 | 0.963 | 0.997 | 1.038 | 1.083 | 1.134 | 1.189 |
| 5.219999999999976 | 0.899 | 0.903 | 0.915 | 0.936 | 0.947 | 0.963 | 0.997 | 1.037 | 1.083 | 1.133 | 1.187 |
| 5.239999999999976 | 0.9 | 0.904 | 0.916 | 0.936 | 0.947 | 0.963 | 0.997 | 1.037 | 1.082 | 1.132 | 1.186 |
| 5.259999999999975 | 0.9 | 0.904 | 0.916 | 0.936 | 0.947 | 0.963 | 0.996 | 1.036 | 1.081 | 1.131 | 1.184 |
| 5.279999999999975 | 0.9 | 0.904 | 0.916 | 0.936 | 0.948 | 0.963 | 0.996 | 1.036 | 1.08 | 1.13 | 1.183 |
| 5.299999999999974 | 0.901 | 0.905 | 0.917 | 0.936 | 0.948 | 0.963 | 0.996 | 1.035 | 1.079 | 1.128 | 1.182 |
| 5.319999999999974 | 0.901 | 0.905 | 0.917 | 0.936 | 0.948 | 0.963 | 0.996 | 1.035 | 1.079 | 1.127 | 1.18 |
| 5.339999999999974 | 0.902 | 0.905 | 0.917 | 0.936 | 0.948 | 0.963 | 0.995 | 1.034 | 1.078 | 1.126 | 1.179 |
| 5.359999999999974 | 0.902 | 0.906 | 0.917 | 0.937 | 0.948 | 0.963 | 0.995 | 1.034 | 1.077 | 1.125 | 1.178 |
| 5.379999999999973 | 0.902 | 0.906 | 0.918 | 0.937 | 0.948 | 0.963 | 0.995 | 1.033 | 1.076 | 1.124 | 1.176 |
| 5.399999999999973 | 0.903 | 0.907 | 0.918 | 0.937 | 0.948 | 0.963 | 0.995 | 1.033 | 1.076 | 1.123 | 1.175 |
| 5.419999999999972 | 0.903 | 0.907 | 0.918 | 0.937 | 0.948 | 0.963 | 0.994 | 1.032 | 1.075 | 1.122 | 1.174 |
| 5.439999999999971 | 0.903 | 0.907 | 0.919 | 0.937 | 0.948 | 0.963 | 0.994 | 1.032 | 1.074 | 1.121 | 1.172 |
| 5.459999999999971 | 0.904 | 0.908 | 0.919 | 0.937 | 0.948 | 0.963 | 0.994 | 1.031 | 1.074 | 1.12 | 1.171 |
| 5.47999999999997 | 0.904 | 0.908 | 0.919 | 0.937 | 0.948 | 0.963 | 0.994 | 1.031 | 1.073 | 1.119 | 1.17 |
| 5.49999999999997 | 0.905 | 0.908 | 0.919 | 0.938 | 0.948 | 0.962 | 0.994 | 1.03 | 1.072 | 1.118 | 1.169 |
| 5.51999999999997 | 0.905 | 0.909 | 0.92 | 0.938 | 0.948 | 0.962 | 0.993 | 1.03 | 1.071 | 1.118 | 1.167 |
| 5.53999999999997 | 0.905 | 0.909 | 0.92 | 0.938 | 0.948 | 0.962 | 0.993 | 1.029 | 1.071 | 1.117 | 1.166 |
| 5.55999999999997 | 0.906 | 0.909 | 0.92 | 0.938 | 0.949 | 0.962 | 0.993 | 1.029 | 1.07 | 1.116 | 1.165 |
| 5.579999999999968 | 0.906 | 0.91 | 0.92 | 0.938 | 0.949 | 0.962 | 0.993 | 1.029 | 1.069 | 1.115 | 1.164 |
| 5.599999999999968 | 0.906 | 0.91 | 0.921 | 0.938 | 0.949 | 0.962 | 0.993 | 1.028 | 1.069 | 1.114 | 1.163 |
| 5.619999999999968 | 0.907 | 0.91 | 0.921 | 0.938 | 0.949 | 0.962 | 0.992 | 1.028 | 1.068 | 1.113 | 1.162 |
| 5.639999999999967 | 0.907 | 0.911 | 0.921 | 0.939 | 0.949 | 0.962 | 0.992 | 1.027 | 1.067 | 1.112 | 1.16 |
| 5.659999999999967 | 0.907 | 0.911 | 0.921 | 0.939 | 0.949 | 0.962 | 0.992 | 1.027 | 1.067 | 1.111 | 1.159 |
| 5.679999999999966 | 0.908 | 0.911 | 0.922 | 0.939 | 0.949 | 0.962 | 0.992 | 1.027 | 1.066 | 1.11 | 1.158 |
| 5.699999999999966 | 0.908 | 0.912 | 0.922 | 0.939 | 0.949 | 0.962 | 0.992 | 1.026 | 1.066 | 1.109 | 1.157 |
| 5.719999999999965 | 0.908 | 0.912 | 0.922 | 0.939 | 0.949 | 0.962 | 0.991 | 1.026 | 1.065 | 1.108 | 1.156 |
| 5.739999999999965 | 0.909 | 0.912 | 0.922 | 0.939 | 0.949 | 0.962 | 0.991 | 1.025 | 1.064 | 1.108 | 1.155 |
| 5.759999999999965 | 0.909 | 0.912 | 0.923 | 0.939 | 0.949 | 0.962 | 0.991 | 1.025 | 1.064 | 1.107 | 1.154 |
| 5.779999999999964 | 0.909 | 0.913 | 0.923 | 0.94 | 0.949 | 0.962 | 0.991 | 1.025 | 1.063 | 1.106 | 1.153 |
| 5.799999999999964 | 0.91 | 0.913 | 0.923 | 0.94 | 0.949 | 0.962 | 0.991 | 1.024 | 1.063 | 1.105 | 1.151 |
| 5.819999999999964 | 0.91 | 0.913 | 0.923 | 0.94 | 0.949 | 0.962 | 0.99 | 1.024 | 1.062 | 1.104 | 1.15 |
| 5.839999999999963 | 0.91 | 0.914 | 0.924 | 0.94 | 0.95 | 0.962 | 0.99 | 1.023 | 1.061 | 1.103 | 1.149 |
| 5.859999999999963 | 0.911 | 0.914 | 0.924 | 0.94 | 0.95 | 0.962 | 0.99 | 1.023 | 1.061 | 1.103 | 1.148 |
| 5.879999999999962 | 0.911 | 0.914 | 0.924 | 0.94 | 0.95 | 0.962 | 0.99 | 1.023 | 1.06 | 1.102 | 1.147 |
| 5.899999999999962 | 0.911 | 0.915 | 0.924 | 0.94 | 0.95 | 0.962 | 0.99 | 1.022 | 1.06 | 1.101 | 1.146 |
| 5.919999999999961 | 0.912 | 0.915 | 0.925 | 0.94 | 0.95 | 0.962 | 0.99 | 1.022 | 1.059 | 1.1 | 1.145 |
| 5.93999999999996 | 0.912 | 0.915 | 0.925 | 0.941 | 0.95 | 0.962 | 0.989 | 1.022 | 1.058 | 1.099 | 1.144 |
| 5.95999999999996 | 0.912 | 0.915 | 0.925 | 0.941 | 0.95 | 0.962 | 0.989 | 1.021 | 1.058 | 1.099 | 1.143 |
| 5.97999999999996 | 0.913 | 0.916 | 0.925 | 0.941 | 0.95 | 0.962 | 0.989 | 1.021 | 1.057 | 1.098 | 1.142 |
| 5.99999999999996 | 0.913 | 0.916 | 0.925 | 0.941 | 0.95 | 0.962 | 0.989 | 1.021 | 1.057 | 1.097 | 1.141 |
| 6.01999999999996 | 0.913 | 0.916 | 0.926 | 0.941 | 0.95 | 0.962 | 0.989 | 1.02 | 1.056 | 1.096 | 1.14 |
| 6.03999999999996 | 0.913 | 0.917 | 0.926 | 0.941 | 0.95 | 0.962 | 0.989 | 1.02 | 1.056 | 1.096 | 1.139 |
| 6.059999999999959 | 0.914 | 0.917 | 0.926 | 0.941 | 0.95 | 0.962 | 0.988 | 1.02 | 1.055 | 1.095 | 1.138 |
| 6.079999999999958 | 0.914 | 0.917 | 0.926 | 0.941 | 0.95 | 0.962 | 0.988 | 1.019 | 1.055 | 1.094 | 1.137 |
| 6.099999999999958 | 0.914 | 0.917 | 0.927 | 0.942 | 0.951 | 0.962 | 0.988 | 1.019 | 1.054 | 1.093 | 1.136 |
| 6.119999999999957 | 0.915 | 0.918 | 0.927 | 0.942 | 0.951 | 0.962 | 0.988 | 1.019 | 1.054 | 1.093 | 1.135 |
| 6.139999999999957 | 0.915 | 0.918 | 0.927 | 0.942 | 0.951 | 0.962 | 0.988 | 1.018 | 1.053 | 1.092 | 1.134 |
| 6.159999999999957 | 0.915 | 0.918 | 0.927 | 0.942 | 0.951 | 0.962 | 0.988 | 1.018 | 1.053 | 1.091 | 1.133 |
| 6.179999999999956 | 0.916 | 0.919 | 0.927 | 0.942 | 0.951 | 0.962 | 0.988 | 1.018 | 1.052 | 1.091 | 1.133 |
| 6.199999999999956 | 0.916 | 0.919 | 0.928 | 0.942 | 0.951 | 0.962 | 0.987 | 1.017 | 1.052 | 1.09 | 1.132 |
| 6.219999999999955 | 0.916 | 0.919 | 0.928 | 0.942 | 0.951 | 0.962 | 0.987 | 1.017 | 1.051 | 1.089 | 1.131 |
| 6.239999999999954 | 0.916 | 0.919 | 0.928 | 0.942 | 0.951 | 0.962 | 0.987 | 1.017 | 1.051 | 1.088 | 1.13 |
| 6.259999999999954 | 0.917 | 0.92 | 0.928 | 0.943 | 0.951 | 0.962 | 0.987 | 1.016 | 1.05 | 1.088 | 1.129 |
| 6.279999999999954 | 0.917 | 0.92 | 0.928 | 0.943 | 0.951 | 0.962 | 0.987 | 1.016 | 1.05 | 1.087 | 1.128 |
| 6.299999999999954 | 0.917 | 0.92 | 0.929 | 0.943 | 0.951 | 0.962 | 0.987 | 1.016 | 1.049 | 1.086 | 1.127 |
| 6.319999999999953 | 0.917 | 0.92 | 0.929 | 0.943 | 0.951 | 0.962 | 0.987 | 1.016 | 1.049 | 1.086 | 1.126 |
| 6.339999999999953 | 0.918 | 0.921 | 0.929 | 0.943 | 0.951 | 0.962 | 0.987 | 1.015 | 1.048 | 1.085 | 1.125 |
| 6.359999999999952 | 0.918 | 0.921 | 0.929 | 0.943 | 0.951 | 0.962 | 0.986 | 1.015 | 1.048 | 1.084 | 1.125 |
| 6.379999999999952 | 0.918 | 0.921 | 0.93 | 0.943 | 0.952 | 0.962 | 0.986 | 1.015 | 1.047 | 1.084 | 1.124 |
| 6.399999999999951 | 0.919 | 0.921 | 0.93 | 0.943 | 0.952 | 0.962 | 0.986 | 1.014 | 1.047 | 1.083 | 1.123 |
| 6.419999999999951 | 0.919 | 0.922 | 0.93 | 0.944 | 0.952 | 0.962 | 0.986 | 1.014 | 1.046 | 1.083 | 1.122 |
| 6.43999999999995 | 0.919 | 0.922 | 0.93 | 0.944 | 0.952 | 0.962 | 0.986 | 1.014 | 1.046 | 1.082 | 1.121 |
| 6.45999999999995 | 0.919 | 0.922 | 0.93 | 0.944 | 0.952 | 0.962 | 0.986 | 1.014 | 1.046 | 1.081 | 1.12 |
| 6.47999999999995 | 0.92 | 0.922 | 0.93 | 0.944 | 0.952 | 0.962 | 0.986 | 1.013 | 1.045 | 1.081 | 1.12 |
| 6.49999999999995 | 0.92 | 0.923 | 0.931 | 0.944 | 0.952 | 0.962 | 0.986 | 1.013 | 1.045 | 1.08 | 1.119 |
| 6.519999999999949 | 0.92 | 0.923 | 0.931 | 0.944 | 0.952 | 0.962 | 0.985 | 1.013 | 1.044 | 1.079 | 1.118 |
| 6.539999999999948 | 0.92 | 0.923 | 0.931 | 0.944 | 0.952 | 0.962 | 0.985 | 1.013 | 1.044 | 1.079 | 1.117 |
| 6.559999999999948 | 0.921 | 0.923 | 0.931 | 0.944 | 0.952 | 0.962 | 0.985 | 1.012 | 1.043 | 1.078 | 1.116 |
| 6.579999999999947 | 0.921 | 0.924 | 0.931 | 0.945 | 0.952 | 0.962 | 0.985 | 1.012 | 1.043 | 1.078 | 1.116 |
| 6.599999999999947 | 0.921 | 0.924 | 0.932 | 0.945 | 0.952 | 0.962 | 0.985 | 1.012 | 1.043 | 1.077 | 1.115 |
| 6.619999999999947 | 0.921 | 0.924 | 0.932 | 0.945 | 0.952 | 0.963 | 0.985 | 1.012 | 1.042 | 1.077 | 1.114 |
| 6.639999999999946 | 0.922 | 0.924 | 0.932 | 0.945 | 0.952 | 0.963 | 0.985 | 1.011 | 1.042 | 1.076 | 1.113 |
| 6.659999999999946 | 0.922 | 0.924 | 0.932 | 0.945 | 0.953 | 0.963 | 0.985 | 1.011 | 1.041 | 1.075 | 1.113 |
| 6.679999999999945 | 0.922 | 0.925 | 0.932 | 0.945 | 0.953 | 0.963 | 0.985 | 1.011 | 1.041 | 1.075 | 1.112 |
| 6.699999999999945 | 0.922 | 0.925 | 0.933 | 0.945 | 0.953 | 0.963 | 0.984 | 1.011 | 1.041 | 1.074 | 1.111 |
| 6.719999999999944 | 0.923 | 0.925 | 0.933 | 0.945 | 0.953 | 0.963 | 0.984 | 1.01 | 1.04 | 1.074 | 1.11 |
| 6.739999999999944 | 0.923 | 0.925 | 0.933 | 0.945 | 0.953 | 0.963 | 0.984 | 1.01 | 1.04 | 1.073 | 1.11 |
| 6.759999999999944 | 0.923 | 0.926 | 0.933 | 0.946 | 0.953 | 0.963 | 0.984 | 1.01 | 1.039 | 1.073 | 1.109 |
| 6.779999999999943 | 0.923 | 0.926 | 0.933 | 0.946 | 0.953 | 0.963 | 0.984 | 1.01 | 1.039 | 1.072 | 1.108 |
| 6.799999999999943 | 0.924 | 0.926 | 0.933 | 0.946 | 0.953 | 0.963 | 0.984 | 1.009 | 1.039 | 1.071 | 1.107 |
| 6.819999999999943 | 0.924 | 0.926 | 0.934 | 0.946 | 0.953 | 0.963 | 0.984 | 1.009 | 1.038 | 1.071 | 1.107 |
| 6.839999999999942 | 0.924 | 0.926 | 0.934 | 0.946 | 0.953 | 0.963 | 0.984 | 1.009 | 1.038 | 1.07 | 1.106 |
| 6.859999999999942 | 0.924 | 0.927 | 0.934 | 0.946 | 0.953 | 0.963 | 0.984 | 1.009 | 1.038 | 1.07 | 1.105 |
| 6.879999999999941 | 0.924 | 0.927 | 0.934 | 0.946 | 0.953 | 0.963 | 0.984 | 1.009 | 1.037 | 1.069 | 1.105 |
| 6.899999999999941 | 0.925 | 0.927 | 0.934 | 0.946 | 0.953 | 0.963 | 0.984 | 1.008 | 1.037 | 1.069 | 1.104 |
| 6.91999999999994 | 0.925 | 0.927 | 0.935 | 0.946 | 0.953 | 0.963 | 0.983 | 1.008 | 1.037 | 1.068 | 1.103 |
| 6.93999999999994 | 0.925 | 0.928 | 0.935 | 0.947 | 0.954 | 0.963 | 0.983 | 1.008 | 1.036 | 1.068 | 1.103 |
| 6.95999999999994 | 0.925 | 0.928 | 0.935 | 0.947 | 0.954 | 0.963 | 0.983 | 1.008 | 1.036 | 1.067 | 1.102 |
| 6.97999999999994 | 0.926 | 0.928 | 0.935 | 0.947 | 0.954 | 0.963 | 0.983 | 1.007 | 1.035 | 1.067 | 1.101 |
| 6.999999999999938 | 0.926 | 0.928 | 0.935 | 0.947 | 0.954 | 0.963 | 0.983 | 1.007 | 1.035 | 1.066 | 1.101 |
| 7.019999999999938 | 0.926 | 0.928 | 0.935 | 0.947 | 0.954 | 0.963 | 0.983 | 1.007 | 1.035 | 1.066 | 1.1 |
| 7.039999999999937 | 0.926 | 0.929 | 0.936 | 0.947 | 0.954 | 0.963 | 0.983 | 1.007 | 1.034 | 1.065 | 1.099 |
| 7.059999999999937 | 0.926 | 0.929 | 0.936 | 0.947 | 0.954 | 0.963 | 0.983 | 1.007 | 1.034 | 1.065 | 1.099 |
| 7.079999999999937 | 0.927 | 0.929 | 0.936 | 0.947 | 0.954 | 0.963 | 0.983 | 1.006 | 1.034 | 1.064 | 1.098 |
| 7.099999999999936 | 0.927 | 0.929 | 0.936 | 0.947 | 0.954 | 0.963 | 0.983 | 1.006 | 1.033 | 1.064 | 1.097 |
| 7.119999999999936 | 0.927 | 0.929 | 0.936 | 0.947 | 0.954 | 0.963 | 0.983 | 1.006 | 1.033 | 1.063 | 1.097 |
| 7.139999999999935 | 0.927 | 0.93 | 0.936 | 0.948 | 0.954 | 0.963 | 0.983 | 1.006 | 1.033 | 1.063 | 1.096 |
| 7.159999999999935 | 0.928 | 0.93 | 0.937 | 0.948 | 0.954 | 0.963 | 0.982 | 1.006 | 1.032 | 1.062 | 1.096 |
| 7.179999999999934 | 0.928 | 0.93 | 0.937 | 0.948 | 0.954 | 0.963 | 0.982 | 1.005 | 1.032 | 1.062 | 1.095 |
| 7.199999999999934 | 0.928 | 0.93 | 0.937 | 0.948 | 0.954 | 0.963 | 0.982 | 1.005 | 1.032 | 1.062 | 1.094 |
| 7.219999999999934 | 0.928 | 0.93 | 0.937 | 0.948 | 0.955 | 0.963 | 0.982 | 1.005 | 1.031 | 1.061 | 1.094 |
| 7.239999999999933 | 0.928 | 0.931 | 0.937 | 0.948 | 0.955 | 0.963 | 0.982 | 1.005 | 1.031 | 1.061 | 1.093 |
| 7.259999999999933 | 0.929 | 0.931 | 0.937 | 0.948 | 0.955 | 0.963 | 0.982 | 1.005 | 1.031 | 1.06 | 1.092 |
| 7.279999999999932 | 0.929 | 0.931 | 0.938 | 0.948 | 0.955 | 0.963 | 0.982 | 1.005 | 1.031 | 1.06 | 1.092 |
| 7.299999999999932 | 0.929 | 0.931 | 0.938 | 0.948 | 0.955 | 0.963 | 0.982 | 1.004 | 1.03 | 1.059 | 1.091 |
| 7.319999999999932 | 0.929 | 0.931 | 0.938 | 0.948 | 0.955 | 0.963 | 0.982 | 1.004 | 1.03 | 1.059 | 1.091 |
| 7.339999999999931 | 0.929 | 0.932 | 0.938 | 0.949 | 0.955 | 0.963 | 0.982 | 1.004 | 1.03 | 1.058 | 1.09 |
| 7.359999999999931 | 0.93 | 0.932 | 0.938 | 0.949 | 0.955 | 0.963 | 0.982 | 1.004 | 1.029 | 1.058 | 1.09 |
| 7.37999999999993 | 0.93 | 0.932 | 0.938 | 0.949 | 0.955 | 0.963 | 0.982 | 1.004 | 1.029 | 1.058 | 1.089 |
| 7.39999999999993 | 0.93 | 0.932 | 0.938 | 0.949 | 0.955 | 0.963 | 0.982 | 1.003 | 1.029 | 1.057 | 1.088 |
| 7.41999999999993 | 0.93 | 0.932 | 0.939 | 0.949 | 0.955 | 0.963 | 0.982 | 1.003 | 1.028 | 1.057 | 1.088 |
| 7.43999999999993 | 0.93 | 0.932 | 0.939 | 0.949 | 0.955 | 0.963 | 0.981 | 1.003 | 1.028 | 1.056 | 1.087 |
| 7.459999999999928 | 0.931 | 0.933 | 0.939 | 0.949 | 0.955 | 0.963 | 0.981 | 1.003 | 1.028 | 1.056 | 1.087 |
| 7.479999999999928 | 0.931 | 0.933 | 0.939 | 0.949 | 0.955 | 0.963 | 0.981 | 1.003 | 1.028 | 1.055 | 1.086 |
| 7.499999999999928 | 0.931 | 0.933 | 0.939 | 0.949 | 0.955 | 0.963 | 0.981 | 1.003 | 1.027 | 1.055 | 1.086 |
| 7.519999999999927 | 0.931 | 0.933 | 0.939 | 0.949 | 0.956 | 0.964 | 0.981 | 1.003 | 1.027 | 1.055 | 1.085 |
| 7.539999999999927 | 0.931 | 0.933 | 0.939 | 0.95 | 0.956 | 0.964 | 0.981 | 1.002 | 1.027 | 1.054 | 1.085 |
| 7.559999999999926 | 0.932 | 0.934 | 0.94 | 0.95 | 0.956 | 0.964 | 0.981 | 1.002 | 1.027 | 1.054 | 1.084 |
| 7.579999999999926 | 0.932 | 0.934 | 0.94 | 0.95 | 0.956 | 0.964 | 0.981 | 1.002 | 1.026 | 1.053 | 1.084 |
| 7.599999999999925 | 0.932 | 0.934 | 0.94 | 0.95 | 0.956 | 0.964 | 0.981 | 1.002 | 1.026 | 1.053 | 1.083 |
| 7.619999999999925 | 0.932 | 0.934 | 0.94 | 0.95 | 0.956 | 0.964 | 0.981 | 1.002 | 1.026 | 1.053 | 1.082 |
| 7.639999999999924 | 0.932 | 0.934 | 0.94 | 0.95 | 0.956 | 0.964 | 0.981 | 1.002 | 1.025 | 1.052 | 1.082 |
| 7.659999999999924 | 0.932 | 0.934 | 0.94 | 0.95 | 0.956 | 0.964 | 0.981 | 1.001 | 1.025 | 1.052 | 1.081 |
| 7.679999999999924 | 0.933 | 0.935 | 0.94 | 0.95 | 0.956 | 0.964 | 0.981 | 1.001 | 1.025 | 1.052 | 1.081 |
| 7.699999999999924 | 0.933 | 0.935 | 0.941 | 0.95 | 0.956 | 0.964 | 0.981 | 1.001 | 1.025 | 1.051 | 1.08 |
| 7.719999999999923 | 0.933 | 0.935 | 0.941 | 0.95 | 0.956 | 0.964 | 0.981 | 1.001 | 1.024 | 1.051 | 1.08 |
| 7.739999999999922 | 0.933 | 0.935 | 0.941 | 0.951 | 0.956 | 0.964 | 0.981 | 1.001 | 1.024 | 1.05 | 1.079 |
| 7.759999999999922 | 0.933 | 0.935 | 0.941 | 0.951 | 0.956 | 0.964 | 0.981 | 1.001 | 1.024 | 1.05 | 1.079 |
| 7.779999999999922 | 0.934 | 0.935 | 0.941 | 0.951 | 0.956 | 0.964 | 0.981 | 1.001 | 1.024 | 1.05 | 1.078 |
| 7.799999999999921 | 0.934 | 0.936 | 0.941 | 0.951 | 0.956 | 0.964 | 0.98 | 1 | 1.023 | 1.049 | 1.078 |
| 7.819999999999921 | 0.934 | 0.936 | 0.941 | 0.951 | 0.957 | 0.964 | 0.98 | 1 | 1.023 | 1.049 | 1.077 |
| 7.83999999999992 | 0.934 | 0.936 | 0.942 | 0.951 | 0.957 | 0.964 | 0.98 | 1 | 1.023 | 1.049 | 1.077 |
| 7.85999999999992 | 0.934 | 0.936 | 0.942 | 0.951 | 0.957 | 0.964 | 0.98 | 1 | 1.023 | 1.048 | 1.076 |
| 7.87999999999992 | 0.934 | 0.936 | 0.942 | 0.951 | 0.957 | 0.964 | 0.98 | 1 | 1.022 | 1.048 | 1.076 |
| 7.899999999999919 | 0.935 | 0.936 | 0.942 | 0.951 | 0.957 | 0.964 | 0.98 | 1 | 1.022 | 1.048 | 1.076 |
| 7.91999999999992 | 0.935 | 0.937 | 0.942 | 0.951 | 0.957 | 0.964 | 0.98 | 1 | 1.022 | 1.047 | 1.075 |
| 7.939999999999918 | 0.935 | 0.937 | 0.942 | 0.951 | 0.957 | 0.964 | 0.98 | 0.999 | 1.022 | 1.047 | 1.075 |
| 7.959999999999918 | 0.935 | 0.937 | 0.942 | 0.952 | 0.957 | 0.964 | 0.98 | 0.999 | 1.021 | 1.047 | 1.074 |
| 7.979999999999917 | 0.935 | 0.937 | 0.943 | 0.952 | 0.957 | 0.964 | 0.98 | 0.999 | 1.021 | 1.046 | 1.074 |
| 7.999999999999917 | 0.935 | 0.937 | 0.943 | 0.952 | 0.957 | 0.964 | 0.98 | 0.999 | 1.021 | 1.046 | 1.073 |
| 8.019999999999918 | 0.936 | 0.937 | 0.943 | 0.952 | 0.957 | 0.964 | 0.98 | 0.999 | 1.021 | 1.045 | 1.073 |
| 8.039999999999917 | 0.936 | 0.938 | 0.943 | 0.952 | 0.957 | 0.964 | 0.98 | 0.999 | 1.021 | 1.045 | 1.072 |
| 8.059999999999915 | 0.936 | 0.938 | 0.943 | 0.952 | 0.957 | 0.964 | 0.98 | 0.999 | 1.02 | 1.045 | 1.072 |
| 8.079999999999917 | 0.936 | 0.938 | 0.943 | 0.952 | 0.957 | 0.964 | 0.98 | 0.999 | 1.02 | 1.045 | 1.071 |
| 8.099999999999916 | 0.936 | 0.938 | 0.943 | 0.952 | 0.957 | 0.964 | 0.98 | 0.998 | 1.02 | 1.044 | 1.071 |
| 8.119999999999916 | 0.936 | 0.938 | 0.943 | 0.952 | 0.957 | 0.964 | 0.98 | 0.998 | 1.02 | 1.044 | 1.071 |
| 8.139999999999915 | 0.937 | 0.938 | 0.944 | 0.952 | 0.958 | 0.964 | 0.98 | 0.998 | 1.019 | 1.044 | 1.07 |
| 8.159999999999915 | 0.937 | 0.938 | 0.944 | 0.952 | 0.958 | 0.964 | 0.98 | 0.998 | 1.019 | 1.043 | 1.07 |
| 8.179999999999914 | 0.937 | 0.939 | 0.944 | 0.953 | 0.958 | 0.964 | 0.98 | 0.998 | 1.019 | 1.043 | 1.069 |
| 8.199999999999912 | 0.937 | 0.939 | 0.944 | 0.953 | 0.958 | 0.965 | 0.98 | 0.998 | 1.019 | 1.043 | 1.069 |
| 8.219999999999914 | 0.937 | 0.939 | 0.944 | 0.953 | 0.958 | 0.965 | 0.98 | 0.998 | 1.019 | 1.042 | 1.068 |
| 8.239999999999913 | 0.937 | 0.939 | 0.944 | 0.953 | 0.958 | 0.965 | 0.98 | 0.998 | 1.018 | 1.042 | 1.068 |
| 8.25999999999991 | 0.938 | 0.939 | 0.944 | 0.953 | 0.958 | 0.965 | 0.98 | 0.997 | 1.018 | 1.042 | 1.068 |
| 8.27999999999991 | 0.938 | 0.939 | 0.944 | 0.953 | 0.958 | 0.965 | 0.979 | 0.997 | 1.018 | 1.041 | 1.067 |
| 8.29999999999991 | 0.938 | 0.94 | 0.945 | 0.953 | 0.958 | 0.965 | 0.979 | 0.997 | 1.018 | 1.041 | 1.067 |
| 8.31999999999991 | 0.938 | 0.94 | 0.945 | 0.953 | 0.958 | 0.965 | 0.979 | 0.997 | 1.018 | 1.041 | 1.066 |
| 8.33999999999991 | 0.938 | 0.94 | 0.945 | 0.953 | 0.958 | 0.965 | 0.979 | 0.997 | 1.017 | 1.04 | 1.066 |
| 8.35999999999991 | 0.938 | 0.94 | 0.945 | 0.953 | 0.958 | 0.965 | 0.979 | 0.997 | 1.017 | 1.04 | 1.066 |
| 8.37999999999991 | 0.938 | 0.94 | 0.945 | 0.953 | 0.958 | 0.965 | 0.979 | 0.997 | 1.017 | 1.04 | 1.065 |
| 8.39999999999991 | 0.939 | 0.94 | 0.945 | 0.953 | 0.958 | 0.965 | 0.979 | 0.997 | 1.017 | 1.04 | 1.065 |
| 8.41999999999991 | 0.939 | 0.94 | 0.945 | 0.954 | 0.958 | 0.965 | 0.979 | 0.997 | 1.017 | 1.039 | 1.064 |
| 8.439999999999907 | 0.939 | 0.941 | 0.945 | 0.954 | 0.958 | 0.965 | 0.979 | 0.996 | 1.016 | 1.039 | 1.064 |
| 8.459999999999908 | 0.939 | 0.941 | 0.946 | 0.954 | 0.959 | 0.965 | 0.979 | 0.996 | 1.016 | 1.039 | 1.064 |
| 8.479999999999908 | 0.939 | 0.941 | 0.946 | 0.954 | 0.959 | 0.965 | 0.979 | 0.996 | 1.016 | 1.038 | 1.063 |
| 8.499999999999908 | 0.939 | 0.941 | 0.946 | 0.954 | 0.959 | 0.965 | 0.979 | 0.996 | 1.016 | 1.038 | 1.063 |
| 8.519999999999907 | 0.939 | 0.941 | 0.946 | 0.954 | 0.959 | 0.965 | 0.979 | 0.996 | 1.016 | 1.038 | 1.062 |
| 8.539999999999907 | 0.94 | 0.941 | 0.946 | 0.954 | 0.959 | 0.965 | 0.979 | 0.996 | 1.015 | 1.038 | 1.062 |
| 8.559999999999906 | 0.94 | 0.941 | 0.946 | 0.954 | 0.959 | 0.965 | 0.979 | 0.996 | 1.015 | 1.037 | 1.062 |
| 8.579999999999904 | 0.94 | 0.942 | 0.946 | 0.954 | 0.959 | 0.965 | 0.979 | 0.996 | 1.015 | 1.037 | 1.061 |
| 8.599999999999905 | 0.94 | 0.942 | 0.946 | 0.954 | 0.959 | 0.965 | 0.979 | 0.996 | 1.015 | 1.037 | 1.061 |
| 8.619999999999903 | 0.94 | 0.942 | 0.947 | 0.954 | 0.959 | 0.965 | 0.979 | 0.996 | 1.015 | 1.037 | 1.061 |
| 8.639999999999905 | 0.94 | 0.942 | 0.947 | 0.954 | 0.959 | 0.965 | 0.979 | 0.995 | 1.015 | 1.036 | 1.06 |
| 8.659999999999904 | 0.94 | 0.942 | 0.947 | 0.954 | 0.959 | 0.965 | 0.979 | 0.995 | 1.014 | 1.036 | 1.06 |
| 8.679999999999904 | 0.941 | 0.942 | 0.947 | 0.955 | 0.959 | 0.965 | 0.979 | 0.995 | 1.014 | 1.036 | 1.06 |
| 8.699999999999903 | 0.941 | 0.942 | 0.947 | 0.955 | 0.959 | 0.965 | 0.979 | 0.995 | 1.014 | 1.035 | 1.059 |
| 8.719999999999901 | 0.941 | 0.942 | 0.947 | 0.955 | 0.959 | 0.965 | 0.979 | 0.995 | 1.014 | 1.035 | 1.059 |
| 8.739999999999903 | 0.941 | 0.943 | 0.947 | 0.955 | 0.959 | 0.965 | 0.979 | 0.995 | 1.014 | 1.035 | 1.058 |
| 8.7599999999999 | 0.941 | 0.943 | 0.947 | 0.955 | 0.959 | 0.965 | 0.979 | 0.995 | 1.014 | 1.035 | 1.058 |
| 8.7799999999999 | 0.941 | 0.943 | 0.947 | 0.955 | 0.959 | 0.965 | 0.979 | 0.995 | 1.013 | 1.034 | 1.058 |
| 8.7999999999999 | 0.941 | 0.943 | 0.948 | 0.955 | 0.96 | 0.965 | 0.979 | 0.995 | 1.013 | 1.034 | 1.057 |
| 8.8199999999999 | 0.942 | 0.943 | 0.948 | 0.955 | 0.96 | 0.966 | 0.979 | 0.995 | 1.013 | 1.034 | 1.057 |
| 8.8399999999999 | 0.942 | 0.943 | 0.948 | 0.955 | 0.96 | 0.966 | 0.979 | 0.994 | 1.013 | 1.034 | 1.057 |
| 8.8599999999999 | 0.942 | 0.943 | 0.948 | 0.955 | 0.96 | 0.966 | 0.979 | 0.994 | 1.013 | 1.033 | 1.056 |
| 8.8799999999999 | 0.942 | 0.944 | 0.948 | 0.955 | 0.96 | 0.966 | 0.979 | 0.994 | 1.013 | 1.033 | 1.056 |
| 8.8999999999999 | 0.942 | 0.944 | 0.948 | 0.955 | 0.96 | 0.966 | 0.979 | 0.994 | 1.012 | 1.033 | 1.056 |
| 8.919999999999899 | 0.942 | 0.944 | 0.948 | 0.956 | 0.96 | 0.966 | 0.979 | 0.994 | 1.012 | 1.033 | 1.055 |
| 8.939999999999898 | 0.942 | 0.944 | 0.948 | 0.956 | 0.96 | 0.966 | 0.979 | 0.994 | 1.012 | 1.032 | 1.055 |
| 8.959999999999898 | 0.943 | 0.944 | 0.948 | 0.956 | 0.96 | 0.966 | 0.979 | 0.994 | 1.012 | 1.032 | 1.055 |
| 8.979999999999897 | 0.943 | 0.944 | 0.949 | 0.956 | 0.96 | 0.966 | 0.979 | 0.994 | 1.012 | 1.032 | 1.054 |
| 8.999999999999895 | 0.943 | 0.944 | 0.949 | 0.956 | 0.96 | 0.966 | 0.979 | 0.994 | 1.012 | 1.032 | 1.054 |
| 9.019999999999897 | 0.943 | 0.944 | 0.949 | 0.956 | 0.96 | 0.966 | 0.978 | 0.994 | 1.011 | 1.031 | 1.054 |
| 9.039999999999896 | 0.943 | 0.945 | 0.949 | 0.956 | 0.96 | 0.966 | 0.978 | 0.994 | 1.011 | 1.031 | 1.053 |
| 9.059999999999896 | 0.943 | 0.945 | 0.949 | 0.956 | 0.96 | 0.966 | 0.978 | 0.994 | 1.011 | 1.031 | 1.053 |
| 9.079999999999895 | 0.943 | 0.945 | 0.949 | 0.956 | 0.96 | 0.966 | 0.978 | 0.993 | 1.011 | 1.031 | 1.053 |
| 9.099999999999895 | 0.943 | 0.945 | 0.949 | 0.956 | 0.96 | 0.966 | 0.978 | 0.993 | 1.011 | 1.031 | 1.053 |
| 9.119999999999894 | 0.944 | 0.945 | 0.949 | 0.956 | 0.96 | 0.966 | 0.978 | 0.993 | 1.011 | 1.03 | 1.052 |
| 9.139999999999892 | 0.944 | 0.945 | 0.949 | 0.956 | 0.961 | 0.966 | 0.978 | 0.993 | 1.011 | 1.03 | 1.052 |
| 9.159999999999894 | 0.944 | 0.945 | 0.949 | 0.956 | 0.961 | 0.966 | 0.978 | 0.993 | 1.01 | 1.03 | 1.052 |
| 9.179999999999893 | 0.944 | 0.945 | 0.95 | 0.956 | 0.961 | 0.966 | 0.978 | 0.993 | 1.01 | 1.03 | 1.051 |
| 9.199999999999893 | 0.944 | 0.945 | 0.95 | 0.957 | 0.961 | 0.966 | 0.978 | 0.993 | 1.01 | 1.029 | 1.051 |
| 9.219999999999892 | 0.944 | 0.946 | 0.95 | 0.957 | 0.961 | 0.966 | 0.978 | 0.993 | 1.01 | 1.029 | 1.051 |
| 9.239999999999892 | 0.944 | 0.946 | 0.95 | 0.957 | 0.961 | 0.966 | 0.978 | 0.993 | 1.01 | 1.029 | 1.05 |
| 9.25999999999989 | 0.944 | 0.946 | 0.95 | 0.957 | 0.961 | 0.966 | 0.978 | 0.993 | 1.01 | 1.029 | 1.05 |
| 9.27999999999989 | 0.945 | 0.946 | 0.95 | 0.957 | 0.961 | 0.966 | 0.978 | 0.993 | 1.01 | 1.029 | 1.05 |
| 9.29999999999989 | 0.945 | 0.946 | 0.95 | 0.957 | 0.961 | 0.966 | 0.978 | 0.993 | 1.009 | 1.028 | 1.049 |
| 9.31999999999989 | 0.945 | 0.946 | 0.95 | 0.957 | 0.961 | 0.966 | 0.978 | 0.993 | 1.009 | 1.028 | 1.049 |
| 9.33999999999989 | 0.945 | 0.946 | 0.95 | 0.957 | 0.961 | 0.966 | 0.978 | 0.993 | 1.009 | 1.028 | 1.049 |
| 9.35999999999989 | 0.945 | 0.946 | 0.95 | 0.957 | 0.961 | 0.966 | 0.978 | 0.992 | 1.009 | 1.028 | 1.049 |
| 9.379999999999889 | 0.945 | 0.947 | 0.951 | 0.957 | 0.961 | 0.966 | 0.978 | 0.992 | 1.009 | 1.028 | 1.048 |
| 9.399999999999888 | 0.945 | 0.947 | 0.951 | 0.957 | 0.961 | 0.966 | 0.978 | 0.992 | 1.009 | 1.027 | 1.048 |
| 9.419999999999886 | 0.945 | 0.947 | 0.951 | 0.957 | 0.961 | 0.967 | 0.978 | 0.992 | 1.009 | 1.027 | 1.048 |
| 9.439999999999888 | 0.946 | 0.947 | 0.951 | 0.957 | 0.961 | 0.967 | 0.978 | 0.992 | 1.008 | 1.027 | 1.047 |
| 9.459999999999887 | 0.946 | 0.947 | 0.951 | 0.957 | 0.961 | 0.967 | 0.978 | 0.992 | 1.008 | 1.027 | 1.047 |
| 9.479999999999887 | 0.946 | 0.947 | 0.951 | 0.958 | 0.961 | 0.967 | 0.978 | 0.992 | 1.008 | 1.027 | 1.047 |
| 9.499999999999886 | 0.946 | 0.947 | 0.951 | 0.958 | 0.961 | 0.967 | 0.978 | 0.992 | 1.008 | 1.026 | 1.047 |
| 9.519999999999886 | 0.946 | 0.947 | 0.951 | 0.958 | 0.962 | 0.967 | 0.978 | 0.992 | 1.008 | 1.026 | 1.046 |
| 9.539999999999885 | 0.946 | 0.947 | 0.951 | 0.958 | 0.962 | 0.967 | 0.978 | 0.992 | 1.008 | 1.026 | 1.046 |
| 9.559999999999885 | 0.946 | 0.948 | 0.951 | 0.958 | 0.962 | 0.967 | 0.978 | 0.992 | 1.008 | 1.026 | 1.046 |
| 9.579999999999885 | 0.946 | 0.948 | 0.952 | 0.958 | 0.962 | 0.967 | 0.978 | 0.992 | 1.008 | 1.026 | 1.046 |
| 9.599999999999884 | 0.946 | 0.948 | 0.952 | 0.958 | 0.962 | 0.967 | 0.978 | 0.992 | 1.007 | 1.025 | 1.045 |
| 9.619999999999884 | 0.947 | 0.948 | 0.952 | 0.958 | 0.962 | 0.967 | 0.978 | 0.992 | 1.007 | 1.025 | 1.045 |
| 9.639999999999883 | 0.947 | 0.948 | 0.952 | 0.958 | 0.962 | 0.967 | 0.978 | 0.991 | 1.007 | 1.025 | 1.045 |
| 9.659999999999881 | 0.947 | 0.948 | 0.952 | 0.958 | 0.962 | 0.967 | 0.978 | 0.991 | 1.007 | 1.025 | 1.045 |
| 9.679999999999882 | 0.947 | 0.948 | 0.952 | 0.958 | 0.962 | 0.967 | 0.978 | 0.991 | 1.007 | 1.025 | 1.044 |
| 9.69999999999988 | 0.947 | 0.948 | 0.952 | 0.958 | 0.962 | 0.967 | 0.978 | 0.991 | 1.007 | 1.024 | 1.044 |
| 9.719999999999882 | 0.947 | 0.948 | 0.952 | 0.958 | 0.962 | 0.967 | 0.978 | 0.991 | 1.007 | 1.024 | 1.044 |
| 9.739999999999881 | 0.947 | 0.949 | 0.952 | 0.958 | 0.962 | 0.967 | 0.978 | 0.991 | 1.007 | 1.024 | 1.043 |
| 9.75999999999988 | 0.947 | 0.949 | 0.952 | 0.959 | 0.962 | 0.967 | 0.978 | 0.991 | 1.006 | 1.024 | 1.043 |
| 9.77999999999988 | 0.947 | 0.949 | 0.952 | 0.959 | 0.962 | 0.967 | 0.978 | 0.991 | 1.006 | 1.024 | 1.043 |
| 9.79999999999988 | 0.948 | 0.949 | 0.953 | 0.959 | 0.962 | 0.967 | 0.978 | 0.991 | 1.006 | 1.024 | 1.043 |
| 9.81999999999988 | 0.948 | 0.949 | 0.953 | 0.959 | 0.962 | 0.967 | 0.978 | 0.991 | 1.006 | 1.023 | 1.042 |
| 9.83999999999988 | 0.948 | 0.949 | 0.953 | 0.959 | 0.962 | 0.967 | 0.978 | 0.991 | 1.006 | 1.023 | 1.042 |
| 9.859999999999879 | 0.948 | 0.949 | 0.953 | 0.959 | 0.962 | 0.967 | 0.978 | 0.991 | 1.006 | 1.023 | 1.042 |
| 9.879999999999878 | 0.948 | 0.949 | 0.953 | 0.959 | 0.963 | 0.967 | 0.978 | 0.991 | 1.006 | 1.023 | 1.042 |
| 9.899999999999878 | 0.948 | 0.949 | 0.953 | 0.959 | 0.963 | 0.967 | 0.978 | 0.991 | 1.006 | 1.023 | 1.042 |
| 9.919999999999877 | 0.948 | 0.949 | 0.953 | 0.959 | 0.963 | 0.967 | 0.978 | 0.991 | 1.006 | 1.022 | 1.041 |
| 9.939999999999877 | 0.948 | 0.95 | 0.953 | 0.959 | 0.963 | 0.967 | 0.978 | 0.991 | 1.005 | 1.022 | 1.041 |
| 9.959999999999877 | 0.948 | 0.95 | 0.953 | 0.959 | 0.963 | 0.967 | 0.978 | 0.991 | 1.005 | 1.022 | 1.041 |
| 9.979999999999876 | 0.949 | 0.95 | 0.953 | 0.959 | 0.963 | 0.967 | 0.978 | 0.991 | 1.005 | 1.022 | 1.041 |
| 9.999999999999876 | 0.949 | 0.95 | 0.953 | 0.959 | 0.963 | 0.967 | 0.978 | 0.99 | 1.005 | 1.022 | 1.04 |
| 10.01999999999988 | 0.949 | 0.95 | 0.954 | 0.959 | 0.963 | 0.968 | 0.978 | 0.99 | 1.005 | 1.022 | 1.04 |
| 10.03999999999987 | 0.949 | 0.95 | 0.954 | 0.959 | 0.963 | 0.968 | 0.978 | 0.99 | 1.005 | 1.021 | 1.04 |
| 10.05999999999987 | 0.949 | 0.95 | 0.954 | 0.959 | 0.963 | 0.968 | 0.978 | 0.99 | 1.005 | 1.021 | 1.04 |
| 10.07999999999987 | 0.949 | 0.95 | 0.954 | 0.96 | 0.963 | 0.968 | 0.978 | 0.99 | 1.005 | 1.021 | 1.039 |
| 10.09999999999987 | 0.949 | 0.95 | 0.954 | 0.96 | 0.963 | 0.968 | 0.978 | 0.99 | 1.005 | 1.021 | 1.039 |
| 10.11999999999987 | 0.949 | 0.95 | 0.954 | 0.96 | 0.963 | 0.968 | 0.978 | 0.99 | 1.004 | 1.021 | 1.039 |
| 10.13999999999987 | 0.949 | 0.951 | 0.954 | 0.96 | 0.963 | 0.968 | 0.978 | 0.99 | 1.004 | 1.021 | 1.039 |
| 10.15999999999987 | 0.95 | 0.951 | 0.954 | 0.96 | 0.963 | 0.968 | 0.978 | 0.99 | 1.004 | 1.02 | 1.038 |
| 10.17999999999987 | 0.95 | 0.951 | 0.954 | 0.96 | 0.963 | 0.968 | 0.978 | 0.99 | 1.004 | 1.02 | 1.038 |
| 10.19999999999987 | 0.95 | 0.951 | 0.954 | 0.96 | 0.963 | 0.968 | 0.978 | 0.99 | 1.004 | 1.02 | 1.038 |
| 10.21999999999987 | 0.95 | 0.951 | 0.954 | 0.96 | 0.963 | 0.968 | 0.978 | 0.99 | 1.004 | 1.02 | 1.038 |
| 10.23999999999987 | 0.95 | 0.951 | 0.954 | 0.96 | 0.963 | 0.968 | 0.978 | 0.99 | 1.004 | 1.02 | 1.038 |
| 10.25999999999987 | 0.95 | 0.951 | 0.955 | 0.96 | 0.963 | 0.968 | 0.978 | 0.99 | 1.004 | 1.02 | 1.037 |
| 10.27999999999987 | 0.95 | 0.951 | 0.955 | 0.96 | 0.964 | 0.968 | 0.978 | 0.99 | 1.004 | 1.02 | 1.037 |
| 10.29999999999987 | 0.95 | 0.951 | 0.955 | 0.96 | 0.964 | 0.968 | 0.978 | 0.99 | 1.004 | 1.019 | 1.037 |
| 10.31999999999987 | 0.95 | 0.951 | 0.955 | 0.96 | 0.964 | 0.968 | 0.978 | 0.99 | 1.003 | 1.019 | 1.037 |
| 10.33999999999987 | 0.95 | 0.952 | 0.955 | 0.96 | 0.964 | 0.968 | 0.978 | 0.99 | 1.003 | 1.019 | 1.037 |
| 10.35999999999987 | 0.951 | 0.952 | 0.955 | 0.96 | 0.964 | 0.968 | 0.978 | 0.99 | 1.003 | 1.019 | 1.036 |
| 10.37999999999987 | 0.951 | 0.952 | 0.955 | 0.96 | 0.964 | 0.968 | 0.978 | 0.99 | 1.003 | 1.019 | 1.036 |
| 10.39999999999987 | 0.951 | 0.952 | 0.955 | 0.961 | 0.964 | 0.968 | 0.978 | 0.989 | 1.003 | 1.019 | 1.036 |
| 10.41999999999987 | 0.951 | 0.952 | 0.955 | 0.961 | 0.964 | 0.968 | 0.978 | 0.989 | 1.003 | 1.018 | 1.036 |
| 10.43999999999987 | 0.951 | 0.952 | 0.955 | 0.961 | 0.964 | 0.968 | 0.978 | 0.989 | 1.003 | 1.018 | 1.035 |
| 10.45999999999987 | 0.951 | 0.952 | 0.955 | 0.961 | 0.964 | 0.968 | 0.978 | 0.989 | 1.003 | 1.018 | 1.035 |
| 10.47999999999987 | 0.951 | 0.952 | 0.955 | 0.961 | 0.964 | 0.968 | 0.978 | 0.989 | 1.003 | 1.018 | 1.035 |
| 10.49999999999986 | 0.951 | 0.952 | 0.955 | 0.961 | 0.964 | 0.968 | 0.978 | 0.989 | 1.003 | 1.018 | 1.035 |
| 10.51999999999986 | 0.951 | 0.952 | 0.956 | 0.961 | 0.964 | 0.968 | 0.978 | 0.989 | 1.003 | 1.018 | 1.035 |
| 10.53999999999986 | 0.951 | 0.952 | 0.956 | 0.961 | 0.964 | 0.968 | 0.978 | 0.989 | 1.002 | 1.018 | 1.034 |
| 10.55999999999986 | 0.951 | 0.953 | 0.956 | 0.961 | 0.964 | 0.968 | 0.978 | 0.989 | 1.002 | 1.017 | 1.034 |
| 10.57999999999986 | 0.952 | 0.953 | 0.956 | 0.961 | 0.964 | 0.968 | 0.978 | 0.989 | 1.002 | 1.017 | 1.034 |
| 10.59999999999986 | 0.952 | 0.953 | 0.956 | 0.961 | 0.964 | 0.968 | 0.978 | 0.989 | 1.002 | 1.017 | 1.034 |
| 10.61999999999986 | 0.952 | 0.953 | 0.956 | 0.961 | 0.964 | 0.968 | 0.978 | 0.989 | 1.002 | 1.017 | 1.034 |
| 10.63999999999986 | 0.952 | 0.953 | 0.956 | 0.961 | 0.964 | 0.969 | 0.978 | 0.989 | 1.002 | 1.017 | 1.033 |
| 10.65999999999986 | 0.952 | 0.953 | 0.956 | 0.961 | 0.964 | 0.969 | 0.978 | 0.989 | 1.002 | 1.017 | 1.033 |
| 10.67999999999986 | 0.952 | 0.953 | 0.956 | 0.961 | 0.964 | 0.969 | 0.978 | 0.989 | 1.002 | 1.017 | 1.033 |
| 10.69999999999986 | 0.952 | 0.953 | 0.956 | 0.961 | 0.965 | 0.969 | 0.978 | 0.989 | 1.002 | 1.016 | 1.033 |
| 10.71999999999986 | 0.952 | 0.953 | 0.956 | 0.961 | 0.965 | 0.969 | 0.978 | 0.989 | 1.002 | 1.016 | 1.033 |
| 10.73999999999986 | 0.952 | 0.953 | 0.956 | 0.962 | 0.965 | 0.969 | 0.978 | 0.989 | 1.002 | 1.016 | 1.033 |
| 10.75999999999986 | 0.952 | 0.953 | 0.957 | 0.962 | 0.965 | 0.969 | 0.978 | 0.989 | 1.002 | 1.016 | 1.032 |
| 10.77999999999986 | 0.952 | 0.954 | 0.957 | 0.962 | 0.965 | 0.969 | 0.978 | 0.989 | 1.001 | 1.016 | 1.032 |
| 10.79999999999986 | 0.953 | 0.954 | 0.957 | 0.962 | 0.965 | 0.969 | 0.978 | 0.989 | 1.001 | 1.016 | 1.032 |
| 10.81999999999986 | 0.953 | 0.954 | 0.957 | 0.962 | 0.965 | 0.969 | 0.978 | 0.989 | 1.001 | 1.016 | 1.032 |
| 10.83999999999986 | 0.953 | 0.954 | 0.957 | 0.962 | 0.965 | 0.969 | 0.978 | 0.989 | 1.001 | 1.016 | 1.032 |
| 10.85999999999986 | 0.953 | 0.954 | 0.957 | 0.962 | 0.965 | 0.969 | 0.978 | 0.989 | 1.001 | 1.015 | 1.031 |
| 10.87999999999986 | 0.953 | 0.954 | 0.957 | 0.962 | 0.965 | 0.969 | 0.978 | 0.988 | 1.001 | 1.015 | 1.031 |
| 10.89999999999986 | 0.953 | 0.954 | 0.957 | 0.962 | 0.965 | 0.969 | 0.978 | 0.988 | 1.001 | 1.015 | 1.031 |
| 10.91999999999986 | 0.953 | 0.954 | 0.957 | 0.962 | 0.965 | 0.969 | 0.978 | 0.988 | 1.001 | 1.015 | 1.031 |
| 10.93999999999986 | 0.953 | 0.954 | 0.957 | 0.962 | 0.965 | 0.969 | 0.978 | 0.988 | 1.001 | 1.015 | 1.031 |
| 10.95999999999986 | 0.953 | 0.954 | 0.957 | 0.962 | 0.965 | 0.969 | 0.978 | 0.988 | 1.001 | 1.015 | 1.031 |
| 10.97999999999985 | 0.953 | 0.954 | 0.957 | 0.962 | 0.965 | 0.969 | 0.978 | 0.988 | 1.001 | 1.015 | 1.03 |
| 10.99999999999985 | 0.953 | 0.954 | 0.957 | 0.962 | 0.965 | 0.969 | 0.978 | 0.988 | 1.001 | 1.015 | 1.03 |
| 11.01999999999985 | 0.954 | 0.955 | 0.957 | 0.962 | 0.965 | 0.969 | 0.978 | 0.988 | 1 | 1.014 | 1.03 |
| 11.03999999999985 | 0.954 | 0.955 | 0.958 | 0.962 | 0.965 | 0.969 | 0.978 | 0.988 | 1 | 1.014 | 1.03 |
| 11.05999999999985 | 0.954 | 0.955 | 0.958 | 0.962 | 0.965 | 0.969 | 0.978 | 0.988 | 1 | 1.014 | 1.03 |
| 11.07999999999985 | 0.954 | 0.955 | 0.958 | 0.963 | 0.965 | 0.969 | 0.978 | 0.988 | 1 | 1.014 | 1.029 |
| 11.09999999999985 | 0.954 | 0.955 | 0.958 | 0.963 | 0.965 | 0.969 | 0.978 | 0.988 | 1 | 1.014 | 1.029 |
| 11.11999999999985 | 0.954 | 0.955 | 0.958 | 0.963 | 0.965 | 0.969 | 0.978 | 0.988 | 1 | 1.014 | 1.029 |
| 11.13999999999985 | 0.954 | 0.955 | 0.958 | 0.963 | 0.966 | 0.969 | 0.978 | 0.988 | 1 | 1.014 | 1.029 |
| 11.15999999999985 | 0.954 | 0.955 | 0.958 | 0.963 | 0.966 | 0.969 | 0.978 | 0.988 | 1 | 1.014 | 1.029 |
| 11.17999999999985 | 0.954 | 0.955 | 0.958 | 0.963 | 0.966 | 0.969 | 0.978 | 0.988 | 1 | 1.013 | 1.029 |
| 11.19999999999985 | 0.954 | 0.955 | 0.958 | 0.963 | 0.966 | 0.969 | 0.978 | 0.988 | 1 | 1.013 | 1.028 |
| 11.21999999999985 | 0.954 | 0.955 | 0.958 | 0.963 | 0.966 | 0.969 | 0.978 | 0.988 | 1 | 1.013 | 1.028 |
| 11.23999999999985 | 0.954 | 0.955 | 0.958 | 0.963 | 0.966 | 0.969 | 0.978 | 0.988 | 1 | 1.013 | 1.028 |
| 11.25999999999985 | 0.955 | 0.956 | 0.958 | 0.963 | 0.966 | 0.97 | 0.978 | 0.988 | 1 | 1.013 | 1.028 |
| 11.27999999999985 | 0.955 | 0.956 | 0.958 | 0.963 | 0.966 | 0.97 | 0.978 | 0.988 | 1 | 1.013 | 1.028 |
| 11.29999999999985 | 0.955 | 0.956 | 0.958 | 0.963 | 0.966 | 0.97 | 0.978 | 0.988 | 0.999 | 1.013 | 1.028 |
| 11.31999999999985 | 0.955 | 0.956 | 0.959 | 0.963 | 0.966 | 0.97 | 0.978 | 0.988 | 0.999 | 1.013 | 1.027 |
| 11.33999999999985 | 0.955 | 0.956 | 0.959 | 0.963 | 0.966 | 0.97 | 0.978 | 0.988 | 0.999 | 1.013 | 1.027 |
| 11.35999999999985 | 0.955 | 0.956 | 0.959 | 0.963 | 0.966 | 0.97 | 0.978 | 0.988 | 0.999 | 1.012 | 1.027 |
| 11.37999999999985 | 0.955 | 0.956 | 0.959 | 0.963 | 0.966 | 0.97 | 0.978 | 0.988 | 0.999 | 1.012 | 1.027 |
| 11.39999999999985 | 0.955 | 0.956 | 0.959 | 0.963 | 0.966 | 0.97 | 0.978 | 0.988 | 0.999 | 1.012 | 1.027 |
| 11.41999999999985 | 0.955 | 0.956 | 0.959 | 0.963 | 0.966 | 0.97 | 0.978 | 0.988 | 0.999 | 1.012 | 1.027 |
| 11.43999999999984 | 0.955 | 0.956 | 0.959 | 0.963 | 0.966 | 0.97 | 0.978 | 0.988 | 0.999 | 1.012 | 1.027 |
| 11.45999999999984 | 0.955 | 0.956 | 0.959 | 0.964 | 0.966 | 0.97 | 0.978 | 0.988 | 0.999 | 1.012 | 1.026 |
| 11.47999999999984 | 0.955 | 0.956 | 0.959 | 0.964 | 0.966 | 0.97 | 0.978 | 0.988 | 0.999 | 1.012 | 1.026 |
| 11.49999999999984 | 0.956 | 0.956 | 0.959 | 0.964 | 0.966 | 0.97 | 0.978 | 0.988 | 0.999 | 1.012 | 1.026 |
| 11.51999999999984 | 0.956 | 0.957 | 0.959 | 0.964 | 0.966 | 0.97 | 0.978 | 0.987 | 0.999 | 1.012 | 1.026 |
| 11.53999999999984 | 0.956 | 0.957 | 0.959 | 0.964 | 0.966 | 0.97 | 0.978 | 0.987 | 0.999 | 1.011 | 1.026 |
| 11.55999999999984 | 0.956 | 0.957 | 0.959 | 0.964 | 0.966 | 0.97 | 0.978 | 0.987 | 0.999 | 1.011 | 1.026 |
| 11.57999999999984 | 0.956 | 0.957 | 0.959 | 0.964 | 0.966 | 0.97 | 0.978 | 0.987 | 0.999 | 1.011 | 1.025 |
| 11.59999999999984 | 0.956 | 0.957 | 0.959 | 0.964 | 0.967 | 0.97 | 0.978 | 0.987 | 0.998 | 1.011 | 1.025 |
| 11.61999999999984 | 0.956 | 0.957 | 0.96 | 0.964 | 0.967 | 0.97 | 0.978 | 0.987 | 0.998 | 1.011 | 1.025 |
| 11.63999999999984 | 0.956 | 0.957 | 0.96 | 0.964 | 0.967 | 0.97 | 0.978 | 0.987 | 0.998 | 1.011 | 1.025 |
| 11.65999999999984 | 0.956 | 0.957 | 0.96 | 0.964 | 0.967 | 0.97 | 0.978 | 0.987 | 0.998 | 1.011 | 1.025 |
| 11.67999999999984 | 0.956 | 0.957 | 0.96 | 0.964 | 0.967 | 0.97 | 0.978 | 0.987 | 0.998 | 1.011 | 1.025 |
| 11.69999999999984 | 0.956 | 0.957 | 0.96 | 0.964 | 0.967 | 0.97 | 0.978 | 0.987 | 0.998 | 1.011 | 1.025 |
| 11.71999999999984 | 0.956 | 0.957 | 0.96 | 0.964 | 0.967 | 0.97 | 0.978 | 0.987 | 0.998 | 1.011 | 1.024 |
| 11.73999999999984 | 0.956 | 0.957 | 0.96 | 0.964 | 0.967 | 0.97 | 0.978 | 0.987 | 0.998 | 1.01 | 1.024 |
| 11.75999999999984 | 0.957 | 0.957 | 0.96 | 0.964 | 0.967 | 0.97 | 0.978 | 0.987 | 0.998 | 1.01 | 1.024 |
| 11.77999999999984 | 0.957 | 0.957 | 0.96 | 0.964 | 0.967 | 0.97 | 0.978 | 0.987 | 0.998 | 1.01 | 1.024 |
| 11.79999999999984 | 0.957 | 0.958 | 0.96 | 0.964 | 0.967 | 0.97 | 0.978 | 0.987 | 0.998 | 1.01 | 1.024 |
| 11.81999999999984 | 0.957 | 0.958 | 0.96 | 0.964 | 0.967 | 0.97 | 0.978 | 0.987 | 0.998 | 1.01 | 1.024 |
| 11.83999999999984 | 0.957 | 0.958 | 0.96 | 0.964 | 0.967 | 0.97 | 0.978 | 0.987 | 0.998 | 1.01 | 1.024 |
| 11.85999999999984 | 0.957 | 0.958 | 0.96 | 0.965 | 0.967 | 0.97 | 0.978 | 0.987 | 0.998 | 1.01 | 1.023 |
| 11.87999999999984 | 0.957 | 0.958 | 0.96 | 0.965 | 0.967 | 0.97 | 0.978 | 0.987 | 0.998 | 1.01 | 1.023 |
| 11.89999999999984 | 0.957 | 0.958 | 0.96 | 0.965 | 0.967 | 0.97 | 0.978 | 0.987 | 0.998 | 1.01 | 1.023 |
| 11.91999999999983 | 0.957 | 0.958 | 0.96 | 0.965 | 0.967 | 0.971 | 0.978 | 0.987 | 0.998 | 1.01 | 1.023 |
| 11.93999999999983 | 0.957 | 0.958 | 0.961 | 0.965 | 0.967 | 0.971 | 0.978 | 0.987 | 0.997 | 1.009 | 1.023 |
| 11.95999999999983 | 0.957 | 0.958 | 0.961 | 0.965 | 0.967 | 0.971 | 0.978 | 0.987 | 0.997 | 1.009 | 1.023 |
| 11.97999999999983 | 0.957 | 0.958 | 0.961 | 0.965 | 0.967 | 0.971 | 0.978 | 0.987 | 0.997 | 1.009 | 1.023 |
| 11.99999999999983 | 0.957 | 0.958 | 0.961 | 0.965 | 0.967 | 0.971 | 0.978 | 0.987 | 0.997 | 1.009 | 1.023 |
| 12.01999999999983 | 0.957 | 0.958 | 0.961 | 0.965 | 0.967 | 0.971 | 0.978 | 0.987 | 0.997 | 1.009 | 1.022 |
| 12.03999999999983 | 0.958 | 0.958 | 0.961 | 0.965 | 0.967 | 0.971 | 0.978 | 0.987 | 0.997 | 1.009 | 1.022 |
| 12.05999999999983 | 0.958 | 0.958 | 0.961 | 0.965 | 0.967 | 0.971 | 0.978 | 0.987 | 0.997 | 1.009 | 1.022 |
| 12.07999999999983 | 0.958 | 0.959 | 0.961 | 0.965 | 0.968 | 0.971 | 0.978 | 0.987 | 0.997 | 1.009 | 1.022 |
| 12.09999999999983 | 0.958 | 0.959 | 0.961 | 0.965 | 0.968 | 0.971 | 0.978 | 0.987 | 0.997 | 1.009 | 1.022 |
| 12.11999999999983 | 0.958 | 0.959 | 0.961 | 0.965 | 0.968 | 0.971 | 0.978 | 0.987 | 0.997 | 1.009 | 1.022 |
| 12.13999999999983 | 0.958 | 0.959 | 0.961 | 0.965 | 0.968 | 0.971 | 0.978 | 0.987 | 0.997 | 1.009 | 1.022 |
| 12.15999999999983 | 0.958 | 0.959 | 0.961 | 0.965 | 0.968 | 0.971 | 0.978 | 0.987 | 0.997 | 1.008 | 1.021 |
| 12.17999999999983 | 0.958 | 0.959 | 0.961 | 0.965 | 0.968 | 0.971 | 0.978 | 0.987 | 0.997 | 1.008 | 1.021 |
| 12.19999999999983 | 0.958 | 0.959 | 0.961 | 0.965 | 0.968 | 0.971 | 0.978 | 0.987 | 0.997 | 1.008 | 1.021 |
| 12.21999999999983 | 0.958 | 0.959 | 0.961 | 0.965 | 0.968 | 0.971 | 0.978 | 0.987 | 0.997 | 1.008 | 1.021 |
| 12.23999999999983 | 0.958 | 0.959 | 0.961 | 0.965 | 0.968 | 0.971 | 0.978 | 0.987 | 0.997 | 1.008 | 1.021 |
| 12.25999999999983 | 0.958 | 0.959 | 0.962 | 0.965 | 0.968 | 0.971 | 0.978 | 0.987 | 0.997 | 1.008 | 1.021 |
| 12.27999999999983 | 0.958 | 0.959 | 0.962 | 0.966 | 0.968 | 0.971 | 0.978 | 0.987 | 0.997 | 1.008 | 1.021 |
| 12.29999999999983 | 0.958 | 0.959 | 0.962 | 0.966 | 0.968 | 0.971 | 0.978 | 0.987 | 0.997 | 1.008 | 1.021 |
| 12.31999999999983 | 0.959 | 0.959 | 0.962 | 0.966 | 0.968 | 0.971 | 0.978 | 0.987 | 0.996 | 1.008 | 1.02 |
| 12.33999999999983 | 0.959 | 0.959 | 0.962 | 0.966 | 0.968 | 0.971 | 0.978 | 0.987 | 0.996 | 1.008 | 1.02 |
| 12.35999999999983 | 0.959 | 0.959 | 0.962 | 0.966 | 0.968 | 0.971 | 0.978 | 0.987 | 0.996 | 1.008 | 1.02 |
| 12.37999999999982 | 0.959 | 0.96 | 0.962 | 0.966 | 0.968 | 0.971 | 0.978 | 0.987 | 0.996 | 1.008 | 1.02 |
| 12.39999999999982 | 0.959 | 0.96 | 0.962 | 0.966 | 0.968 | 0.971 | 0.978 | 0.986 | 0.996 | 1.007 | 1.02 |
| 12.41999999999982 | 0.959 | 0.96 | 0.962 | 0.966 | 0.968 | 0.971 | 0.978 | 0.986 | 0.996 | 1.007 | 1.02 |
| 12.43999999999982 | 0.959 | 0.96 | 0.962 | 0.966 | 0.968 | 0.971 | 0.978 | 0.986 | 0.996 | 1.007 | 1.02 |
| 12.45999999999982 | 0.959 | 0.96 | 0.962 | 0.966 | 0.968 | 0.971 | 0.978 | 0.986 | 0.996 | 1.007 | 1.02 |
| 12.47999999999982 | 0.959 | 0.96 | 0.962 | 0.966 | 0.968 | 0.971 | 0.978 | 0.986 | 0.996 | 1.007 | 1.02 |
| 12.49999999999982 | 0.959 | 0.96 | 0.962 | 0.966 | 0.968 | 0.971 | 0.978 | 0.986 | 0.996 | 1.007 | 1.019 |
| 12.51999999999982 | 0.959 | 0.96 | 0.962 | 0.966 | 0.968 | 0.971 | 0.978 | 0.986 | 0.996 | 1.007 | 1.019 |
| 12.53999999999982 | 0.959 | 0.96 | 0.962 | 0.966 | 0.968 | 0.971 | 0.978 | 0.986 | 0.996 | 1.007 | 1.019 |
| 12.55999999999982 | 0.959 | 0.96 | 0.962 | 0.966 | 0.968 | 0.971 | 0.978 | 0.986 | 0.996 | 1.007 | 1.019 |
| 12.57999999999982 | 0.959 | 0.96 | 0.962 | 0.966 | 0.968 | 0.971 | 0.978 | 0.986 | 0.996 | 1.007 | 1.019 |
| 12.59999999999982 | 0.959 | 0.96 | 0.963 | 0.966 | 0.969 | 0.972 | 0.978 | 0.986 | 0.996 | 1.007 | 1.019 |
| 12.61999999999982 | 0.96 | 0.96 | 0.963 | 0.966 | 0.969 | 0.972 | 0.978 | 0.986 | 0.996 | 1.007 | 1.019 |
| 12.63999999999982 | 0.96 | 0.96 | 0.963 | 0.966 | 0.969 | 0.972 | 0.978 | 0.986 | 0.996 | 1.007 | 1.019 |
| 12.65999999999982 | 0.96 | 0.96 | 0.963 | 0.966 | 0.969 | 0.972 | 0.978 | 0.986 | 0.996 | 1.006 | 1.019 |
| 12.67999999999982 | 0.96 | 0.961 | 0.963 | 0.966 | 0.969 | 0.972 | 0.978 | 0.986 | 0.996 | 1.006 | 1.018 |
| 12.69999999999982 | 0.96 | 0.961 | 0.963 | 0.966 | 0.969 | 0.972 | 0.978 | 0.986 | 0.996 | 1.006 | 1.018 |
| 12.71999999999982 | 0.96 | 0.961 | 0.963 | 0.967 | 0.969 | 0.972 | 0.978 | 0.986 | 0.996 | 1.006 | 1.018 |
| 12.73999999999982 | 0.96 | 0.961 | 0.963 | 0.967 | 0.969 | 0.972 | 0.978 | 0.986 | 0.996 | 1.006 | 1.018 |
| 12.75999999999982 | 0.96 | 0.961 | 0.963 | 0.967 | 0.969 | 0.972 | 0.978 | 0.986 | 0.995 | 1.006 | 1.018 |
| 12.77999999999982 | 0.96 | 0.961 | 0.963 | 0.967 | 0.969 | 0.972 | 0.978 | 0.986 | 0.995 | 1.006 | 1.018 |
| 12.79999999999982 | 0.96 | 0.961 | 0.963 | 0.967 | 0.969 | 0.972 | 0.978 | 0.986 | 0.995 | 1.006 | 1.018 |
| 12.81999999999982 | 0.96 | 0.961 | 0.963 | 0.967 | 0.969 | 0.972 | 0.978 | 0.986 | 0.995 | 1.006 | 1.018 |
| 12.83999999999982 | 0.96 | 0.961 | 0.963 | 0.967 | 0.969 | 0.972 | 0.978 | 0.986 | 0.995 | 1.006 | 1.018 |
| 12.85999999999981 | 0.96 | 0.961 | 0.963 | 0.967 | 0.969 | 0.972 | 0.978 | 0.986 | 0.995 | 1.006 | 1.017 |
| 12.87999999999981 | 0.96 | 0.961 | 0.963 | 0.967 | 0.969 | 0.972 | 0.978 | 0.986 | 0.995 | 1.006 | 1.017 |
| 12.89999999999981 | 0.96 | 0.961 | 0.963 | 0.967 | 0.969 | 0.972 | 0.978 | 0.986 | 0.995 | 1.006 | 1.017 |
| 12.91999999999981 | 0.961 | 0.961 | 0.963 | 0.967 | 0.969 | 0.972 | 0.978 | 0.986 | 0.995 | 1.006 | 1.017 |
| 12.93999999999981 | 0.961 | 0.961 | 0.963 | 0.967 | 0.969 | 0.972 | 0.978 | 0.986 | 0.995 | 1.005 | 1.017 |
| 12.95999999999981 | 0.961 | 0.961 | 0.964 | 0.967 | 0.969 | 0.972 | 0.978 | 0.986 | 0.995 | 1.005 | 1.017 |
| 12.97999999999981 | 0.961 | 0.961 | 0.964 | 0.967 | 0.969 | 0.972 | 0.978 | 0.986 | 0.995 | 1.005 | 1.017 |
| 12.99999999999981 | 0.961 | 0.961 | 0.964 | 0.967 | 0.969 | 0.972 | 0.978 | 0.986 | 0.995 | 1.005 | 1.017 |
| 13.01999999999981 | 0.961 | 0.962 | 0.964 | 0.967 | 0.969 | 0.972 | 0.978 | 0.986 | 0.995 | 1.005 | 1.017 |
| 13.03999999999981 | 0.961 | 0.962 | 0.964 | 0.967 | 0.969 | 0.972 | 0.978 | 0.986 | 0.995 | 1.005 | 1.016 |
| 13.05999999999981 | 0.961 | 0.962 | 0.964 | 0.967 | 0.969 | 0.972 | 0.978 | 0.986 | 0.995 | 1.005 | 1.016 |
| 13.07999999999981 | 0.961 | 0.962 | 0.964 | 0.967 | 0.969 | 0.972 | 0.978 | 0.986 | 0.995 | 1.005 | 1.016 |
| 13.09999999999981 | 0.961 | 0.962 | 0.964 | 0.967 | 0.969 | 0.972 | 0.978 | 0.986 | 0.995 | 1.005 | 1.016 |
| 13.11999999999981 | 0.961 | 0.962 | 0.964 | 0.967 | 0.969 | 0.972 | 0.978 | 0.986 | 0.995 | 1.005 | 1.016 |
| 13.13999999999981 | 0.961 | 0.962 | 0.964 | 0.967 | 0.97 | 0.972 | 0.978 | 0.986 | 0.995 | 1.005 | 1.016 |
| 13.15999999999981 | 0.961 | 0.962 | 0.964 | 0.967 | 0.97 | 0.972 | 0.978 | 0.986 | 0.995 | 1.005 | 1.016 |
| 13.17999999999981 | 0.961 | 0.962 | 0.964 | 0.968 | 0.97 | 0.972 | 0.978 | 0.986 | 0.995 | 1.005 | 1.016 |
| 13.19999999999981 | 0.961 | 0.962 | 0.964 | 0.968 | 0.97 | 0.972 | 0.978 | 0.986 | 0.995 | 1.005 | 1.016 |
| 13.21999999999981 | 0.961 | 0.962 | 0.964 | 0.968 | 0.97 | 0.972 | 0.978 | 0.986 | 0.995 | 1.004 | 1.016 |
| 13.23999999999981 | 0.961 | 0.962 | 0.964 | 0.968 | 0.97 | 0.972 | 0.978 | 0.986 | 0.995 | 1.004 | 1.016 |
| 13.25999999999981 | 0.962 | 0.962 | 0.964 | 0.968 | 0.97 | 0.972 | 0.978 | 0.986 | 0.994 | 1.004 | 1.015 |
| 13.27999999999981 | 0.962 | 0.962 | 0.964 | 0.968 | 0.97 | 0.972 | 0.979 | 0.986 | 0.994 | 1.004 | 1.015 |
| 13.29999999999981 | 0.962 | 0.962 | 0.964 | 0.968 | 0.97 | 0.972 | 0.979 | 0.986 | 0.994 | 1.004 | 1.015 |
| 13.3199999999998 | 0.962 | 0.962 | 0.964 | 0.968 | 0.97 | 0.973 | 0.979 | 0.986 | 0.994 | 1.004 | 1.015 |
| 13.3399999999998 | 0.962 | 0.962 | 0.964 | 0.968 | 0.97 | 0.973 | 0.979 | 0.986 | 0.994 | 1.004 | 1.015 |
| 13.3599999999998 | 0.962 | 0.963 | 0.965 | 0.968 | 0.97 | 0.973 | 0.979 | 0.986 | 0.994 | 1.004 | 1.015 |
| 13.3799999999998 | 0.962 | 0.963 | 0.965 | 0.968 | 0.97 | 0.973 | 0.979 | 0.986 | 0.994 | 1.004 | 1.015 |
| 13.3999999999998 | 0.962 | 0.963 | 0.965 | 0.968 | 0.97 | 0.973 | 0.979 | 0.986 | 0.994 | 1.004 | 1.015 |
| 13.4199999999998 | 0.962 | 0.963 | 0.965 | 0.968 | 0.97 | 0.973 | 0.979 | 0.986 | 0.994 | 1.004 | 1.015 |
| 13.4399999999998 | 0.962 | 0.963 | 0.965 | 0.968 | 0.97 | 0.973 | 0.979 | 0.986 | 0.994 | 1.004 | 1.015 |
| 13.4599999999998 | 0.962 | 0.963 | 0.965 | 0.968 | 0.97 | 0.973 | 0.979 | 0.986 | 0.994 | 1.004 | 1.014 |
| 13.4799999999998 | 0.962 | 0.963 | 0.965 | 0.968 | 0.97 | 0.973 | 0.979 | 0.986 | 0.994 | 1.004 | 1.014 |
| 13.4999999999998 | 0.962 | 0.963 | 0.965 | 0.968 | 0.97 | 0.973 | 0.979 | 0.986 | 0.994 | 1.004 | 1.014 |
| 13.5199999999998 | 0.962 | 0.963 | 0.965 | 0.968 | 0.97 | 0.973 | 0.979 | 0.986 | 0.994 | 1.004 | 1.014 |
| 13.5399999999998 | 0.962 | 0.963 | 0.965 | 0.968 | 0.97 | 0.973 | 0.979 | 0.986 | 0.994 | 1.003 | 1.014 |
| 13.5599999999998 | 0.962 | 0.963 | 0.965 | 0.968 | 0.97 | 0.973 | 0.979 | 0.986 | 0.994 | 1.003 | 1.014 |
| 13.5799999999998 | 0.962 | 0.963 | 0.965 | 0.968 | 0.97 | 0.973 | 0.979 | 0.986 | 0.994 | 1.003 | 1.014 |
| 13.5999999999998 | 0.963 | 0.963 | 0.965 | 0.968 | 0.97 | 0.973 | 0.979 | 0.986 | 0.994 | 1.003 | 1.014 |
| 13.6199999999998 | 0.963 | 0.963 | 0.965 | 0.968 | 0.97 | 0.973 | 0.979 | 0.986 | 0.994 | 1.003 | 1.014 |
| 13.6399999999998 | 0.963 | 0.963 | 0.965 | 0.968 | 0.97 | 0.973 | 0.979 | 0.986 | 0.994 | 1.003 | 1.014 |
| 13.6599999999998 | 0.963 | 0.963 | 0.965 | 0.968 | 0.97 | 0.973 | 0.979 | 0.986 | 0.994 | 1.003 | 1.014 |
| 13.6799999999998 | 0.963 | 0.963 | 0.965 | 0.969 | 0.97 | 0.973 | 0.979 | 0.986 | 0.994 | 1.003 | 1.014 |
| 13.6999999999998 | 0.963 | 0.963 | 0.965 | 0.969 | 0.97 | 0.973 | 0.979 | 0.986 | 0.994 | 1.003 | 1.013 |
| 13.7199999999998 | 0.963 | 0.964 | 0.965 | 0.969 | 0.971 | 0.973 | 0.979 | 0.986 | 0.994 | 1.003 | 1.013 |
| 13.7399999999998 | 0.963 | 0.964 | 0.965 | 0.969 | 0.971 | 0.973 | 0.979 | 0.986 | 0.994 | 1.003 | 1.013 |
| 13.7599999999998 | 0.963 | 0.964 | 0.966 | 0.969 | 0.971 | 0.973 | 0.979 | 0.986 | 0.994 | 1.003 | 1.013 |
| 13.7799999999998 | 0.963 | 0.964 | 0.966 | 0.969 | 0.971 | 0.973 | 0.979 | 0.986 | 0.994 | 1.003 | 1.013 |
| 13.79999999999979 | 0.963 | 0.964 | 0.966 | 0.969 | 0.971 | 0.973 | 0.979 | 0.986 | 0.994 | 1.003 | 1.013 |
| 13.81999999999979 | 0.963 | 0.964 | 0.966 | 0.969 | 0.971 | 0.973 | 0.979 | 0.986 | 0.994 | 1.003 | 1.013 |
| 13.83999999999979 | 0.963 | 0.964 | 0.966 | 0.969 | 0.971 | 0.973 | 0.979 | 0.986 | 0.994 | 1.003 | 1.013 |
| 13.8599999999998 | 0.963 | 0.964 | 0.966 | 0.969 | 0.971 | 0.973 | 0.979 | 0.986 | 0.993 | 1.003 | 1.013 |
| 13.8799999999998 | 0.963 | 0.964 | 0.966 | 0.969 | 0.971 | 0.973 | 0.979 | 0.986 | 0.993 | 1.003 | 1.013 |
| 13.8999999999998 | 0.963 | 0.964 | 0.966 | 0.969 | 0.971 | 0.973 | 0.979 | 0.986 | 0.993 | 1.002 | 1.013 |
| 13.9199999999998 | 0.963 | 0.964 | 0.966 | 0.969 | 0.971 | 0.973 | 0.979 | 0.986 | 0.993 | 1.002 | 1.013 |
| 13.9399999999998 | 0.963 | 0.964 | 0.966 | 0.969 | 0.971 | 0.973 | 0.979 | 0.986 | 0.993 | 1.002 | 1.012 |
| 13.9599999999998 | 0.964 | 0.964 | 0.966 | 0.969 | 0.971 | 0.973 | 0.979 | 0.986 | 0.993 | 1.002 | 1.012 |
| 13.9799999999998 | 0.964 | 0.964 | 0.966 | 0.969 | 0.971 | 0.973 | 0.979 | 0.986 | 0.993 | 1.002 | 1.012 |
| 13.9999999999998 | 0.964 | 0.964 | 0.966 | 0.969 | 0.971 | 0.973 | 0.979 | 0.985 | 0.993 | 1.002 | 1.012 |
| 14.01999999999979 | 0.964 | 0.964 | 0.966 | 0.969 | 0.971 | 0.973 | 0.979 | 0.985 | 0.993 | 1.002 | 1.012 |
| 14.03999999999979 | 0.964 | 0.964 | 0.966 | 0.969 | 0.971 | 0.973 | 0.979 | 0.985 | 0.993 | 1.002 | 1.012 |
| 14.05999999999979 | 0.964 | 0.964 | 0.966 | 0.969 | 0.971 | 0.973 | 0.979 | 0.985 | 0.993 | 1.002 | 1.012 |
| 14.07999999999979 | 0.964 | 0.964 | 0.966 | 0.969 | 0.971 | 0.974 | 0.979 | 0.985 | 0.993 | 1.002 | 1.012 |
| 14.09999999999979 | 0.964 | 0.964 | 0.966 | 0.969 | 0.971 | 0.974 | 0.979 | 0.985 | 0.993 | 1.002 | 1.012 |
| 14.11999999999979 | 0.964 | 0.965 | 0.966 | 0.969 | 0.971 | 0.974 | 0.979 | 0.985 | 0.993 | 1.002 | 1.012 |
| 14.13999999999979 | 0.964 | 0.965 | 0.966 | 0.969 | 0.971 | 0.974 | 0.979 | 0.985 | 0.993 | 1.002 | 1.012 |
| 14.15999999999979 | 0.964 | 0.965 | 0.966 | 0.969 | 0.971 | 0.974 | 0.979 | 0.985 | 0.993 | 1.002 | 1.012 |
| 14.17999999999979 | 0.964 | 0.965 | 0.966 | 0.969 | 0.971 | 0.974 | 0.979 | 0.985 | 0.993 | 1.002 | 1.011 |
| 14.19999999999979 | 0.964 | 0.965 | 0.967 | 0.97 | 0.971 | 0.974 | 0.979 | 0.985 | 0.993 | 1.002 | 1.011 |
| 14.21999999999979 | 0.964 | 0.965 | 0.967 | 0.97 | 0.971 | 0.974 | 0.979 | 0.985 | 0.993 | 1.002 | 1.011 |
| 14.23999999999979 | 0.964 | 0.965 | 0.967 | 0.97 | 0.971 | 0.974 | 0.979 | 0.985 | 0.993 | 1.002 | 1.011 |
| 14.25999999999978 | 0.964 | 0.965 | 0.967 | 0.97 | 0.971 | 0.974 | 0.979 | 0.985 | 0.993 | 1.002 | 1.011 |
| 14.27999999999978 | 0.964 | 0.965 | 0.967 | 0.97 | 0.971 | 0.974 | 0.979 | 0.985 | 0.993 | 1.001 | 1.011 |
| 14.29999999999978 | 0.964 | 0.965 | 0.967 | 0.97 | 0.971 | 0.974 | 0.979 | 0.985 | 0.993 | 1.001 | 1.011 |
| 14.31999999999978 | 0.964 | 0.965 | 0.967 | 0.97 | 0.971 | 0.974 | 0.979 | 0.985 | 0.993 | 1.001 | 1.011 |
| 14.33999999999978 | 0.965 | 0.965 | 0.967 | 0.97 | 0.972 | 0.974 | 0.979 | 0.985 | 0.993 | 1.001 | 1.011 |
| 14.35999999999978 | 0.965 | 0.965 | 0.967 | 0.97 | 0.972 | 0.974 | 0.979 | 0.985 | 0.993 | 1.001 | 1.011 |
| 14.37999999999978 | 0.965 | 0.965 | 0.967 | 0.97 | 0.972 | 0.974 | 0.979 | 0.985 | 0.993 | 1.001 | 1.011 |
| 14.39999999999978 | 0.965 | 0.965 | 0.967 | 0.97 | 0.972 | 0.974 | 0.979 | 0.985 | 0.993 | 1.001 | 1.011 |
| 14.41999999999978 | 0.965 | 0.965 | 0.967 | 0.97 | 0.972 | 0.974 | 0.979 | 0.985 | 0.993 | 1.001 | 1.011 |
| 14.43999999999978 | 0.965 | 0.965 | 0.967 | 0.97 | 0.972 | 0.974 | 0.979 | 0.985 | 0.993 | 1.001 | 1.011 |
| 14.45999999999978 | 0.965 | 0.965 | 0.967 | 0.97 | 0.972 | 0.974 | 0.979 | 0.985 | 0.993 | 1.001 | 1.01 |
| 14.47999999999978 | 0.965 | 0.965 | 0.967 | 0.97 | 0.972 | 0.974 | 0.979 | 0.985 | 0.993 | 1.001 | 1.01 |
| 14.49999999999978 | 0.965 | 0.965 | 0.967 | 0.97 | 0.972 | 0.974 | 0.979 | 0.985 | 0.993 | 1.001 | 1.01 |
| 14.51999999999978 | 0.965 | 0.966 | 0.967 | 0.97 | 0.972 | 0.974 | 0.979 | 0.985 | 0.993 | 1.001 | 1.01 |
| 14.53999999999978 | 0.965 | 0.966 | 0.967 | 0.97 | 0.972 | 0.974 | 0.979 | 0.985 | 0.993 | 1.001 | 1.01 |
| 14.55999999999978 | 0.965 | 0.966 | 0.967 | 0.97 | 0.972 | 0.974 | 0.979 | 0.985 | 0.993 | 1.001 | 1.01 |
| 14.57999999999978 | 0.965 | 0.966 | 0.967 | 0.97 | 0.972 | 0.974 | 0.979 | 0.985 | 0.993 | 1.001 | 1.01 |
| 14.59999999999978 | 0.965 | 0.966 | 0.967 | 0.97 | 0.972 | 0.974 | 0.979 | 0.985 | 0.992 | 1.001 | 1.01 |
| 14.61999999999978 | 0.965 | 0.966 | 0.967 | 0.97 | 0.972 | 0.974 | 0.979 | 0.985 | 0.992 | 1.001 | 1.01 |
| 14.63999999999978 | 0.965 | 0.966 | 0.967 | 0.97 | 0.972 | 0.974 | 0.979 | 0.985 | 0.992 | 1.001 | 1.01 |
| 14.65999999999978 | 0.965 | 0.966 | 0.968 | 0.97 | 0.972 | 0.974 | 0.979 | 0.985 | 0.992 | 1.001 | 1.01 |
| 14.67999999999978 | 0.965 | 0.966 | 0.968 | 0.97 | 0.972 | 0.974 | 0.979 | 0.985 | 0.992 | 1.001 | 1.01 |
| 14.69999999999978 | 0.965 | 0.966 | 0.968 | 0.97 | 0.972 | 0.974 | 0.979 | 0.985 | 0.992 | 1 | 1.01 |
| 14.71999999999977 | 0.965 | 0.966 | 0.968 | 0.97 | 0.972 | 0.974 | 0.979 | 0.985 | 0.992 | 1 | 1.01 |
| 14.73999999999977 | 0.965 | 0.966 | 0.968 | 0.97 | 0.972 | 0.974 | 0.979 | 0.985 | 0.992 | 1 | 1.009 |
| 14.75999999999977 | 0.966 | 0.966 | 0.968 | 0.971 | 0.972 | 0.974 | 0.979 | 0.985 | 0.992 | 1 | 1.009 |
| 14.77999999999977 | 0.966 | 0.966 | 0.968 | 0.971 | 0.972 | 0.974 | 0.979 | 0.985 | 0.992 | 1 | 1.009 |
| 14.79999999999977 | 0.966 | 0.966 | 0.968 | 0.971 | 0.972 | 0.974 | 0.979 | 0.985 | 0.992 | 1 | 1.009 |
| 14.81999999999977 | 0.966 | 0.966 | 0.968 | 0.971 | 0.972 | 0.974 | 0.979 | 0.985 | 0.992 | 1 | 1.009 |
| 14.83999999999977 | 0.966 | 0.966 | 0.968 | 0.971 | 0.972 | 0.974 | 0.979 | 0.985 | 0.992 | 1 | 1.009 |
| 14.85999999999977 | 0.966 | 0.966 | 0.968 | 0.971 | 0.972 | 0.974 | 0.979 | 0.985 | 0.992 | 1 | 1.009 |
| 14.87999999999977 | 0.966 | 0.966 | 0.968 | 0.971 | 0.972 | 0.974 | 0.979 | 0.985 | 0.992 | 1 | 1.009 |
| 14.89999999999977 | 0.966 | 0.966 | 0.968 | 0.971 | 0.972 | 0.975 | 0.979 | 0.985 | 0.992 | 1 | 1.009 |
| 14.91999999999977 | 0.966 | 0.966 | 0.968 | 0.971 | 0.972 | 0.975 | 0.979 | 0.985 | 0.992 | 1 | 1.009 |
| 14.93999999999977 | 0.966 | 0.966 | 0.968 | 0.971 | 0.972 | 0.975 | 0.979 | 0.985 | 0.992 | 1 | 1.009 |
| 14.95999999999977 | 0.966 | 0.967 | 0.968 | 0.971 | 0.972 | 0.975 | 0.979 | 0.985 | 0.992 | 1 | 1.009 |
| 14.97999999999977 | 0.966 | 0.967 | 0.968 | 0.971 | 0.972 | 0.975 | 0.979 | 0.985 | 0.992 | 1 | 1.009 |
| 14.99999999999977 | 0.966 | 0.967 | 0.968 | 0.971 | 0.973 | 0.975 | 0.979 | 0.985 | 0.992 | 1 | 1.009 |
| 15.01999999999977 | 0.966 | 0.967 | 0.968 | 0.971 | 0.973 | 0.975 | 0.979 | 0.985 | 0.992 | 1 | 1.009 |
| 15.03999999999977 | 0.966 | 0.967 | 0.968 | 0.971 | 0.973 | 0.975 | 0.979 | 0.985 | 0.992 | 1 | 1.009 |
| 15.05999999999977 | 0.966 | 0.967 | 0.968 | 0.971 | 0.973 | 0.975 | 0.979 | 0.985 | 0.992 | 1 | 1.008 |
| 15.07999999999977 | 0.966 | 0.967 | 0.968 | 0.971 | 0.973 | 0.975 | 0.979 | 0.985 | 0.992 | 1 | 1.008 |
| 15.09999999999977 | 0.966 | 0.967 | 0.968 | 0.971 | 0.973 | 0.975 | 0.979 | 0.985 | 0.992 | 1 | 1.008 |
| 15.11999999999977 | 0.966 | 0.967 | 0.968 | 0.971 | 0.973 | 0.975 | 0.979 | 0.985 | 0.992 | 1 | 1.008 |
| 15.13999999999977 | 0.966 | 0.967 | 0.969 | 0.971 | 0.973 | 0.975 | 0.979 | 0.985 | 0.992 | 1 | 1.008 |
| 15.15999999999977 | 0.966 | 0.967 | 0.969 | 0.971 | 0.973 | 0.975 | 0.98 | 0.985 | 0.992 | 1 | 1.008 |
| 15.17999999999977 | 0.967 | 0.967 | 0.969 | 0.971 | 0.973 | 0.975 | 0.98 | 0.985 | 0.992 | 0.999 | 1.008 |
| 15.19999999999976 | 0.967 | 0.967 | 0.969 | 0.971 | 0.973 | 0.975 | 0.98 | 0.985 | 0.992 | 0.999 | 1.008 |
| 15.21999999999976 | 0.967 | 0.967 | 0.969 | 0.971 | 0.973 | 0.975 | 0.98 | 0.985 | 0.992 | 0.999 | 1.008 |
| 15.23999999999976 | 0.967 | 0.967 | 0.969 | 0.971 | 0.973 | 0.975 | 0.98 | 0.985 | 0.992 | 0.999 | 1.008 |
| 15.25999999999976 | 0.967 | 0.967 | 0.969 | 0.971 | 0.973 | 0.975 | 0.98 | 0.985 | 0.992 | 0.999 | 1.008 |
| 15.27999999999976 | 0.967 | 0.967 | 0.969 | 0.971 | 0.973 | 0.975 | 0.98 | 0.985 | 0.992 | 0.999 | 1.008 |
| 15.29999999999976 | 0.967 | 0.967 | 0.969 | 0.971 | 0.973 | 0.975 | 0.98 | 0.985 | 0.992 | 0.999 | 1.008 |
| 15.31999999999976 | 0.967 | 0.967 | 0.969 | 0.971 | 0.973 | 0.975 | 0.98 | 0.985 | 0.992 | 0.999 | 1.008 |
| 15.33999999999976 | 0.967 | 0.967 | 0.969 | 0.971 | 0.973 | 0.975 | 0.98 | 0.985 | 0.992 | 0.999 | 1.008 |
| 15.35999999999976 | 0.967 | 0.967 | 0.969 | 0.971 | 0.973 | 0.975 | 0.98 | 0.985 | 0.992 | 0.999 | 1.008 |
| 15.37999999999976 | 0.967 | 0.967 | 0.969 | 0.972 | 0.973 | 0.975 | 0.98 | 0.985 | 0.992 | 0.999 | 1.007 |
| 15.39999999999976 | 0.967 | 0.967 | 0.969 | 0.972 | 0.973 | 0.975 | 0.98 | 0.985 | 0.992 | 0.999 | 1.007 |
| 15.41999999999976 | 0.967 | 0.968 | 0.969 | 0.972 | 0.973 | 0.975 | 0.98 | 0.985 | 0.992 | 0.999 | 1.007 |
| 15.43999999999976 | 0.967 | 0.968 | 0.969 | 0.972 | 0.973 | 0.975 | 0.98 | 0.985 | 0.992 | 0.999 | 1.007 |
| 15.45999999999976 | 0.967 | 0.968 | 0.969 | 0.972 | 0.973 | 0.975 | 0.98 | 0.985 | 0.992 | 0.999 | 1.007 |
| 15.47999999999976 | 0.967 | 0.968 | 0.969 | 0.972 | 0.973 | 0.975 | 0.98 | 0.985 | 0.992 | 0.999 | 1.007 |
| 15.49999999999976 | 0.967 | 0.968 | 0.969 | 0.972 | 0.973 | 0.975 | 0.98 | 0.985 | 0.992 | 0.999 | 1.007 |
| 15.51999999999976 | 0.967 | 0.968 | 0.969 | 0.972 | 0.973 | 0.975 | 0.98 | 0.985 | 0.992 | 0.999 | 1.007 |
| 15.53999999999976 | 0.967 | 0.968 | 0.969 | 0.972 | 0.973 | 0.975 | 0.98 | 0.985 | 0.992 | 0.999 | 1.007 |
| 15.55999999999976 | 0.967 | 0.968 | 0.969 | 0.972 | 0.973 | 0.975 | 0.98 | 0.985 | 0.992 | 0.999 | 1.007 |
| 15.57999999999976 | 0.967 | 0.968 | 0.969 | 0.972 | 0.973 | 0.975 | 0.98 | 0.985 | 0.991 | 0.999 | 1.007 |
| 15.59999999999976 | 0.967 | 0.968 | 0.969 | 0.972 | 0.973 | 0.975 | 0.98 | 0.985 | 0.991 | 0.999 | 1.007 |
| 15.61999999999976 | 0.967 | 0.968 | 0.969 | 0.972 | 0.973 | 0.975 | 0.98 | 0.985 | 0.991 | 0.999 | 1.007 |
| 15.63999999999976 | 0.968 | 0.968 | 0.969 | 0.972 | 0.973 | 0.975 | 0.98 | 0.985 | 0.991 | 0.999 | 1.007 |
| 15.65999999999975 | 0.968 | 0.968 | 0.97 | 0.972 | 0.973 | 0.975 | 0.98 | 0.985 | 0.991 | 0.999 | 1.007 |
| 15.67999999999975 | 0.968 | 0.968 | 0.97 | 0.972 | 0.973 | 0.975 | 0.98 | 0.985 | 0.991 | 0.999 | 1.007 |
| 15.69999999999975 | 0.968 | 0.968 | 0.97 | 0.972 | 0.973 | 0.975 | 0.98 | 0.985 | 0.991 | 0.999 | 1.007 |
| 15.71999999999975 | 0.968 | 0.968 | 0.97 | 0.972 | 0.974 | 0.975 | 0.98 | 0.985 | 0.991 | 0.999 | 1.007 |
| 15.73999999999975 | 0.968 | 0.968 | 0.97 | 0.972 | 0.974 | 0.975 | 0.98 | 0.985 | 0.991 | 0.998 | 1.006 |
| 15.75999999999975 | 0.968 | 0.968 | 0.97 | 0.972 | 0.974 | 0.976 | 0.98 | 0.985 | 0.991 | 0.998 | 1.006 |
| 15.77999999999975 | 0.968 | 0.968 | 0.97 | 0.972 | 0.974 | 0.976 | 0.98 | 0.985 | 0.991 | 0.998 | 1.006 |
| 15.79999999999975 | 0.968 | 0.968 | 0.97 | 0.972 | 0.974 | 0.976 | 0.98 | 0.985 | 0.991 | 0.998 | 1.006 |
| 15.81999999999975 | 0.968 | 0.968 | 0.97 | 0.972 | 0.974 | 0.976 | 0.98 | 0.985 | 0.991 | 0.998 | 1.006 |
| 15.83999999999975 | 0.968 | 0.968 | 0.97 | 0.972 | 0.974 | 0.976 | 0.98 | 0.985 | 0.991 | 0.998 | 1.006 |
| 15.85999999999975 | 0.968 | 0.968 | 0.97 | 0.972 | 0.974 | 0.976 | 0.98 | 0.985 | 0.991 | 0.998 | 1.006 |
| 15.87999999999975 | 0.968 | 0.968 | 0.97 | 0.972 | 0.974 | 0.976 | 0.98 | 0.985 | 0.991 | 0.998 | 1.006 |
| 15.89999999999975 | 0.968 | 0.969 | 0.97 | 0.972 | 0.974 | 0.976 | 0.98 | 0.985 | 0.991 | 0.998 | 1.006 |
| 15.91999999999975 | 0.968 | 0.969 | 0.97 | 0.972 | 0.974 | 0.976 | 0.98 | 0.985 | 0.991 | 0.998 | 1.006 |
| 15.93999999999975 | 0.968 | 0.969 | 0.97 | 0.972 | 0.974 | 0.976 | 0.98 | 0.985 | 0.991 | 0.998 | 1.006 |
| 15.95999999999975 | 0.968 | 0.969 | 0.97 | 0.972 | 0.974 | 0.976 | 0.98 | 0.985 | 0.991 | 0.998 | 1.006 |
| 15.97999999999975 | 0.968 | 0.969 | 0.97 | 0.972 | 0.974 | 0.976 | 0.98 | 0.985 | 0.991 | 0.998 | 1.006 |
| 15.99999999999975 | 0.968 | 0.969 | 0.97 | 0.972 | 0.974 | 0.976 | 0.98 | 0.985 | 0.991 | 0.998 | 1.006 |
| 16.01999999999975 | 0.968 | 0.969 | 0.97 | 0.973 | 0.974 | 0.976 | 0.98 | 0.985 | 0.991 | 0.998 | 1.006 |
| 16.03999999999975 | 0.968 | 0.969 | 0.97 | 0.973 | 0.974 | 0.976 | 0.98 | 0.985 | 0.991 | 0.998 | 1.006 |
| 16.05999999999975 | 0.968 | 0.969 | 0.97 | 0.973 | 0.974 | 0.976 | 0.98 | 0.985 | 0.991 | 0.998 | 1.006 |
| 16.07999999999975 | 0.968 | 0.969 | 0.97 | 0.973 | 0.974 | 0.976 | 0.98 | 0.985 | 0.991 | 0.998 | 1.006 |
| 16.09999999999975 | 0.968 | 0.969 | 0.97 | 0.973 | 0.974 | 0.976 | 0.98 | 0.985 | 0.991 | 0.998 | 1.006 |
| 16.11999999999975 | 0.968 | 0.969 | 0.97 | 0.973 | 0.974 | 0.976 | 0.98 | 0.985 | 0.991 | 0.998 | 1.006 |
| 16.13999999999974 | 0.969 | 0.969 | 0.97 | 0.973 | 0.974 | 0.976 | 0.98 | 0.985 | 0.991 | 0.998 | 1.005 |
| 16.15999999999974 | 0.969 | 0.969 | 0.97 | 0.973 | 0.974 | 0.976 | 0.98 | 0.985 | 0.991 | 0.998 | 1.005 |
| 16.17999999999974 | 0.969 | 0.969 | 0.97 | 0.973 | 0.974 | 0.976 | 0.98 | 0.985 | 0.991 | 0.998 | 1.005 |
| 16.19999999999974 | 0.969 | 0.969 | 0.97 | 0.973 | 0.974 | 0.976 | 0.98 | 0.985 | 0.991 | 0.998 | 1.005 |
| 16.21999999999974 | 0.969 | 0.969 | 0.971 | 0.973 | 0.974 | 0.976 | 0.98 | 0.985 | 0.991 | 0.998 | 1.005 |
| 16.23999999999974 | 0.969 | 0.969 | 0.971 | 0.973 | 0.974 | 0.976 | 0.98 | 0.985 | 0.991 | 0.998 | 1.005 |
| 16.25999999999974 | 0.969 | 0.969 | 0.971 | 0.973 | 0.974 | 0.976 | 0.98 | 0.985 | 0.991 | 0.998 | 1.005 |
| 16.27999999999974 | 0.969 | 0.969 | 0.971 | 0.973 | 0.974 | 0.976 | 0.98 | 0.985 | 0.991 | 0.998 | 1.005 |
| 16.29999999999974 | 0.969 | 0.969 | 0.971 | 0.973 | 0.974 | 0.976 | 0.98 | 0.985 | 0.991 | 0.998 | 1.005 |
| 16.31999999999974 | 0.969 | 0.969 | 0.971 | 0.973 | 0.974 | 0.976 | 0.98 | 0.985 | 0.991 | 0.998 | 1.005 |
| 16.33999999999974 | 0.969 | 0.969 | 0.971 | 0.973 | 0.974 | 0.976 | 0.98 | 0.985 | 0.991 | 0.998 | 1.005 |
| 16.35999999999974 | 0.969 | 0.969 | 0.971 | 0.973 | 0.974 | 0.976 | 0.98 | 0.985 | 0.991 | 0.997 | 1.005 |
| 16.37999999999974 | 0.969 | 0.969 | 0.971 | 0.973 | 0.974 | 0.976 | 0.98 | 0.985 | 0.991 | 0.997 | 1.005 |
| 16.39999999999974 | 0.969 | 0.969 | 0.971 | 0.973 | 0.974 | 0.976 | 0.98 | 0.985 | 0.991 | 0.997 | 1.005 |
| 16.41999999999974 | 0.969 | 0.97 | 0.971 | 0.973 | 0.974 | 0.976 | 0.98 | 0.985 | 0.991 | 0.997 | 1.005 |
| 16.43999999999974 | 0.969 | 0.97 | 0.971 | 0.973 | 0.974 | 0.976 | 0.98 | 0.985 | 0.991 | 0.997 | 1.005 |
| 16.45999999999974 | 0.969 | 0.97 | 0.971 | 0.973 | 0.974 | 0.976 | 0.98 | 0.985 | 0.991 | 0.997 | 1.005 |
| 16.47999999999974 | 0.969 | 0.97 | 0.971 | 0.973 | 0.975 | 0.976 | 0.98 | 0.985 | 0.991 | 0.997 | 1.005 |
| 16.49999999999974 | 0.969 | 0.97 | 0.971 | 0.973 | 0.975 | 0.976 | 0.98 | 0.985 | 0.991 | 0.997 | 1.005 |
| 16.51999999999974 | 0.969 | 0.97 | 0.971 | 0.973 | 0.975 | 0.976 | 0.98 | 0.985 | 0.991 | 0.997 | 1.005 |
| 16.53999999999974 | 0.969 | 0.97 | 0.971 | 0.973 | 0.975 | 0.976 | 0.98 | 0.985 | 0.991 | 0.997 | 1.005 |
| 16.55999999999974 | 0.969 | 0.97 | 0.971 | 0.973 | 0.975 | 0.976 | 0.98 | 0.985 | 0.991 | 0.997 | 1.004 |
| 16.57999999999974 | 0.969 | 0.97 | 0.971 | 0.973 | 0.975 | 0.976 | 0.98 | 0.985 | 0.991 | 0.997 | 1.004 |
| 16.59999999999973 | 0.969 | 0.97 | 0.971 | 0.973 | 0.975 | 0.976 | 0.98 | 0.985 | 0.991 | 0.997 | 1.004 |
| 16.61999999999973 | 0.969 | 0.97 | 0.971 | 0.973 | 0.975 | 0.976 | 0.98 | 0.985 | 0.991 | 0.997 | 1.004 |
| 16.63999999999973 | 0.969 | 0.97 | 0.971 | 0.973 | 0.975 | 0.976 | 0.98 | 0.985 | 0.991 | 0.997 | 1.004 |
| 16.65999999999973 | 0.97 | 0.97 | 0.971 | 0.973 | 0.975 | 0.976 | 0.98 | 0.985 | 0.991 | 0.997 | 1.004 |
| 16.67999999999973 | 0.97 | 0.97 | 0.971 | 0.973 | 0.975 | 0.977 | 0.98 | 0.985 | 0.991 | 0.997 | 1.004 |
| 16.69999999999973 | 0.97 | 0.97 | 0.971 | 0.974 | 0.975 | 0.977 | 0.98 | 0.985 | 0.991 | 0.997 | 1.004 |
| 16.71999999999973 | 0.97 | 0.97 | 0.971 | 0.974 | 0.975 | 0.977 | 0.98 | 0.985 | 0.991 | 0.997 | 1.004 |
| 16.73999999999973 | 0.97 | 0.97 | 0.971 | 0.974 | 0.975 | 0.977 | 0.98 | 0.985 | 0.991 | 0.997 | 1.004 |
| 16.75999999999973 | 0.97 | 0.97 | 0.971 | 0.974 | 0.975 | 0.977 | 0.98 | 0.985 | 0.991 | 0.997 | 1.004 |
| 16.77999999999973 | 0.97 | 0.97 | 0.971 | 0.974 | 0.975 | 0.977 | 0.98 | 0.985 | 0.991 | 0.997 | 1.004 |
| 16.79999999999973 | 0.97 | 0.97 | 0.971 | 0.974 | 0.975 | 0.977 | 0.98 | 0.985 | 0.991 | 0.997 | 1.004 |
| 16.81999999999973 | 0.97 | 0.97 | 0.972 | 0.974 | 0.975 | 0.977 | 0.98 | 0.985 | 0.991 | 0.997 | 1.004 |
| 16.83999999999973 | 0.97 | 0.97 | 0.972 | 0.974 | 0.975 | 0.977 | 0.98 | 0.985 | 0.991 | 0.997 | 1.004 |
| 16.85999999999973 | 0.97 | 0.97 | 0.972 | 0.974 | 0.975 | 0.977 | 0.98 | 0.985 | 0.991 | 0.997 | 1.004 |
| 16.87999999999973 | 0.97 | 0.97 | 0.972 | 0.974 | 0.975 | 0.977 | 0.981 | 0.985 | 0.991 | 0.997 | 1.004 |
| 16.89999999999973 | 0.97 | 0.97 | 0.972 | 0.974 | 0.975 | 0.977 | 0.981 | 0.985 | 0.991 | 0.997 | 1.004 |
| 16.91999999999973 | 0.97 | 0.97 | 0.972 | 0.974 | 0.975 | 0.977 | 0.981 | 0.985 | 0.991 | 0.997 | 1.004 |
| 16.93999999999973 | 0.97 | 0.97 | 0.972 | 0.974 | 0.975 | 0.977 | 0.981 | 0.985 | 0.991 | 0.997 | 1.004 |
| 16.95999999999973 | 0.97 | 0.97 | 0.972 | 0.974 | 0.975 | 0.977 | 0.981 | 0.985 | 0.991 | 0.997 | 1.004 |
| 16.97999999999973 | 0.97 | 0.971 | 0.972 | 0.974 | 0.975 | 0.977 | 0.981 | 0.985 | 0.991 | 0.997 | 1.004 |
| 16.99999999999973 | 0.97 | 0.971 | 0.972 | 0.974 | 0.975 | 0.977 | 0.981 | 0.985 | 0.99 | 0.997 | 1.004 |
| 17.01999999999973 | 0.97 | 0.971 | 0.972 | 0.974 | 0.975 | 0.977 | 0.981 | 0.985 | 0.99 | 0.997 | 1.004 |
| 17.03999999999973 | 0.97 | 0.971 | 0.972 | 0.974 | 0.975 | 0.977 | 0.981 | 0.985 | 0.99 | 0.997 | 1.003 |
| 17.05999999999973 | 0.97 | 0.971 | 0.972 | 0.974 | 0.975 | 0.977 | 0.981 | 0.985 | 0.99 | 0.997 | 1.003 |
| 17.07999999999972 | 0.97 | 0.971 | 0.972 | 0.974 | 0.975 | 0.977 | 0.981 | 0.985 | 0.99 | 0.997 | 1.003 |
| 17.09999999999972 | 0.97 | 0.971 | 0.972 | 0.974 | 0.975 | 0.977 | 0.981 | 0.985 | 0.99 | 0.997 | 1.003 |
| 17.11999999999972 | 0.97 | 0.971 | 0.972 | 0.974 | 0.975 | 0.977 | 0.981 | 0.985 | 0.99 | 0.996 | 1.003 |
| 17.13999999999972 | 0.97 | 0.971 | 0.972 | 0.974 | 0.975 | 0.977 | 0.981 | 0.985 | 0.99 | 0.996 | 1.003 |
| 17.15999999999972 | 0.97 | 0.971 | 0.972 | 0.974 | 0.975 | 0.977 | 0.981 | 0.985 | 0.99 | 0.996 | 1.003 |
| 17.17999999999972 | 0.97 | 0.971 | 0.972 | 0.974 | 0.975 | 0.977 | 0.981 | 0.985 | 0.99 | 0.996 | 1.003 |
| 17.19999999999972 | 0.97 | 0.971 | 0.972 | 0.974 | 0.975 | 0.977 | 0.981 | 0.985 | 0.99 | 0.996 | 1.003 |
| 17.21999999999972 | 0.971 | 0.971 | 0.972 | 0.974 | 0.975 | 0.977 | 0.981 | 0.985 | 0.99 | 0.996 | 1.003 |
| 17.23999999999972 | 0.971 | 0.971 | 0.972 | 0.974 | 0.975 | 0.977 | 0.981 | 0.985 | 0.99 | 0.996 | 1.003 |
| 17.25999999999972 | 0.971 | 0.971 | 0.972 | 0.974 | 0.975 | 0.977 | 0.981 | 0.985 | 0.99 | 0.996 | 1.003 |
| 17.27999999999972 | 0.971 | 0.971 | 0.972 | 0.974 | 0.975 | 0.977 | 0.981 | 0.985 | 0.99 | 0.996 | 1.003 |
| 17.29999999999972 | 0.971 | 0.971 | 0.972 | 0.974 | 0.976 | 0.977 | 0.981 | 0.985 | 0.99 | 0.996 | 1.003 |
| 17.31999999999972 | 0.971 | 0.971 | 0.972 | 0.974 | 0.976 | 0.977 | 0.981 | 0.985 | 0.99 | 0.996 | 1.003 |
| 17.33999999999972 | 0.971 | 0.971 | 0.972 | 0.974 | 0.976 | 0.977 | 0.981 | 0.985 | 0.99 | 0.996 | 1.003 |
| 17.35999999999972 | 0.971 | 0.971 | 0.972 | 0.974 | 0.976 | 0.977 | 0.981 | 0.985 | 0.99 | 0.996 | 1.003 |
| 17.37999999999972 | 0.971 | 0.971 | 0.972 | 0.974 | 0.976 | 0.977 | 0.981 | 0.985 | 0.99 | 0.996 | 1.003 |
| 17.39999999999972 | 0.971 | 0.971 | 0.972 | 0.974 | 0.976 | 0.977 | 0.981 | 0.985 | 0.99 | 0.996 | 1.003 |
| 17.41999999999972 | 0.971 | 0.971 | 0.972 | 0.974 | 0.976 | 0.977 | 0.981 | 0.985 | 0.99 | 0.996 | 1.003 |
| 17.43999999999972 | 0.971 | 0.971 | 0.973 | 0.974 | 0.976 | 0.977 | 0.981 | 0.985 | 0.99 | 0.996 | 1.003 |
| 17.45999999999972 | 0.971 | 0.971 | 0.973 | 0.975 | 0.976 | 0.977 | 0.981 | 0.985 | 0.99 | 0.996 | 1.003 |
| 17.47999999999972 | 0.971 | 0.971 | 0.973 | 0.975 | 0.976 | 0.977 | 0.981 | 0.985 | 0.99 | 0.996 | 1.003 |
| 17.49999999999972 | 0.971 | 0.971 | 0.973 | 0.975 | 0.976 | 0.977 | 0.981 | 0.985 | 0.99 | 0.996 | 1.003 |
| 17.51999999999972 | 0.971 | 0.971 | 0.973 | 0.975 | 0.976 | 0.977 | 0.981 | 0.985 | 0.99 | 0.996 | 1.003 |
| 17.53999999999971 | 0.971 | 0.971 | 0.973 | 0.975 | 0.976 | 0.977 | 0.981 | 0.985 | 0.99 | 0.996 | 1.003 |
| 17.55999999999971 | 0.971 | 0.972 | 0.973 | 0.975 | 0.976 | 0.977 | 0.981 | 0.985 | 0.99 | 0.996 | 1.002 |
| 17.57999999999971 | 0.971 | 0.972 | 0.973 | 0.975 | 0.976 | 0.977 | 0.981 | 0.985 | 0.99 | 0.996 | 1.002 |
| 17.59999999999971 | 0.971 | 0.972 | 0.973 | 0.975 | 0.976 | 0.977 | 0.981 | 0.985 | 0.99 | 0.996 | 1.002 |
| 17.61999999999971 | 0.971 | 0.972 | 0.973 | 0.975 | 0.976 | 0.977 | 0.981 | 0.985 | 0.99 | 0.996 | 1.002 |
| 17.63999999999971 | 0.971 | 0.972 | 0.973 | 0.975 | 0.976 | 0.977 | 0.981 | 0.985 | 0.99 | 0.996 | 1.002 |
| 17.65999999999971 | 0.971 | 0.972 | 0.973 | 0.975 | 0.976 | 0.977 | 0.981 | 0.985 | 0.99 | 0.996 | 1.002 |
| 17.67999999999971 | 0.971 | 0.972 | 0.973 | 0.975 | 0.976 | 0.978 | 0.981 | 0.985 | 0.99 | 0.996 | 1.002 |
| 17.69999999999971 | 0.971 | 0.972 | 0.973 | 0.975 | 0.976 | 0.978 | 0.981 | 0.985 | 0.99 | 0.996 | 1.002 |
| 17.71999999999971 | 0.971 | 0.972 | 0.973 | 0.975 | 0.976 | 0.978 | 0.981 | 0.985 | 0.99 | 0.996 | 1.002 |
| 17.73999999999971 | 0.971 | 0.972 | 0.973 | 0.975 | 0.976 | 0.978 | 0.981 | 0.985 | 0.99 | 0.996 | 1.002 |
| 17.75999999999971 | 0.971 | 0.972 | 0.973 | 0.975 | 0.976 | 0.978 | 0.981 | 0.985 | 0.99 | 0.996 | 1.002 |
| 17.77999999999971 | 0.971 | 0.972 | 0.973 | 0.975 | 0.976 | 0.978 | 0.981 | 0.985 | 0.99 | 0.996 | 1.002 |
| 17.79999999999971 | 0.972 | 0.972 | 0.973 | 0.975 | 0.976 | 0.978 | 0.981 | 0.985 | 0.99 | 0.996 | 1.002 |
| 17.81999999999971 | 0.972 | 0.972 | 0.973 | 0.975 | 0.976 | 0.978 | 0.981 | 0.985 | 0.99 | 0.996 | 1.002 |
| 17.83999999999971 | 0.972 | 0.972 | 0.973 | 0.975 | 0.976 | 0.978 | 0.981 | 0.985 | 0.99 | 0.996 | 1.002 |
| 17.85999999999971 | 0.972 | 0.972 | 0.973 | 0.975 | 0.976 | 0.978 | 0.981 | 0.985 | 0.99 | 0.996 | 1.002 |
| 17.87999999999971 | 0.972 | 0.972 | 0.973 | 0.975 | 0.976 | 0.978 | 0.981 | 0.985 | 0.99 | 0.996 | 1.002 |
| 17.89999999999971 | 0.972 | 0.972 | 0.973 | 0.975 | 0.976 | 0.978 | 0.981 | 0.985 | 0.99 | 0.996 | 1.002 |
| 17.91999999999971 | 0.972 | 0.972 | 0.973 | 0.975 | 0.976 | 0.978 | 0.981 | 0.985 | 0.99 | 0.996 | 1.002 |
| 17.93999999999971 | 0.972 | 0.972 | 0.973 | 0.975 | 0.976 | 0.978 | 0.981 | 0.985 | 0.99 | 0.996 | 1.002 |
| 17.95999999999971 | 0.972 | 0.972 | 0.973 | 0.975 | 0.976 | 0.978 | 0.981 | 0.985 | 0.99 | 0.996 | 1.002 |
| 17.97999999999971 | 0.972 | 0.972 | 0.973 | 0.975 | 0.976 | 0.978 | 0.981 | 0.985 | 0.99 | 0.996 | 1.002 |
| 17.99999999999971 | 0.972 | 0.972 | 0.973 | 0.975 | 0.976 | 0.978 | 0.981 | 0.985 | 0.99 | 0.996 | 1.002 |
| 18.0199999999997 | 0.972 | 0.972 | 0.973 | 0.975 | 0.976 | 0.978 | 0.981 | 0.985 | 0.99 | 0.996 | 1.002 |
| 18.0399999999997 | 0.972 | 0.972 | 0.973 | 0.975 | 0.976 | 0.978 | 0.981 | 0.985 | 0.99 | 0.995 | 1.002 |
| 18.0599999999997 | 0.972 | 0.972 | 0.973 | 0.975 | 0.976 | 0.978 | 0.981 | 0.985 | 0.99 | 0.995 | 1.002 |
| 18.0799999999997 | 0.972 | 0.972 | 0.973 | 0.975 | 0.976 | 0.978 | 0.981 | 0.985 | 0.99 | 0.995 | 1.002 |
| 18.0999999999997 | 0.972 | 0.972 | 0.973 | 0.975 | 0.976 | 0.978 | 0.981 | 0.985 | 0.99 | 0.995 | 1.002 |
| 18.1199999999997 | 0.972 | 0.972 | 0.973 | 0.975 | 0.976 | 0.978 | 0.981 | 0.985 | 0.99 | 0.995 | 1.002 |
| 18.1399999999997 | 0.972 | 0.972 | 0.974 | 0.975 | 0.976 | 0.978 | 0.981 | 0.985 | 0.99 | 0.995 | 1.002 |
| 18.1599999999997 | 0.972 | 0.972 | 0.974 | 0.975 | 0.976 | 0.978 | 0.981 | 0.985 | 0.99 | 0.995 | 1.001 |
| 18.1799999999997 | 0.972 | 0.972 | 0.974 | 0.975 | 0.977 | 0.978 | 0.981 | 0.985 | 0.99 | 0.995 | 1.001 |
| 18.1999999999997 | 0.972 | 0.973 | 0.974 | 0.975 | 0.977 | 0.978 | 0.981 | 0.985 | 0.99 | 0.995 | 1.001 |
| 18.2199999999997 | 0.972 | 0.973 | 0.974 | 0.975 | 0.977 | 0.978 | 0.981 | 0.985 | 0.99 | 0.995 | 1.001 |
| 18.2399999999997 | 0.972 | 0.973 | 0.974 | 0.975 | 0.977 | 0.978 | 0.981 | 0.985 | 0.99 | 0.995 | 1.001 |
| 18.2599999999997 | 0.972 | 0.973 | 0.974 | 0.976 | 0.977 | 0.978 | 0.981 | 0.985 | 0.99 | 0.995 | 1.001 |
| 18.2799999999997 | 0.972 | 0.973 | 0.974 | 0.976 | 0.977 | 0.978 | 0.981 | 0.985 | 0.99 | 0.995 | 1.001 |
| 18.2999999999997 | 0.972 | 0.973 | 0.974 | 0.976 | 0.977 | 0.978 | 0.981 | 0.985 | 0.99 | 0.995 | 1.001 |
| 18.3199999999997 | 0.972 | 0.973 | 0.974 | 0.976 | 0.977 | 0.978 | 0.981 | 0.985 | 0.99 | 0.995 | 1.001 |
| 18.3399999999997 | 0.972 | 0.973 | 0.974 | 0.976 | 0.977 | 0.978 | 0.981 | 0.985 | 0.99 | 0.995 | 1.001 |
| 18.3599999999997 | 0.972 | 0.973 | 0.974 | 0.976 | 0.977 | 0.978 | 0.981 | 0.985 | 0.99 | 0.995 | 1.001 |
| 18.3799999999997 | 0.972 | 0.973 | 0.974 | 0.976 | 0.977 | 0.978 | 0.981 | 0.985 | 0.99 | 0.995 | 1.001 |
| 18.3999999999997 | 0.972 | 0.973 | 0.974 | 0.976 | 0.977 | 0.978 | 0.981 | 0.985 | 0.99 | 0.995 | 1.001 |
| 18.4199999999997 | 0.972 | 0.973 | 0.974 | 0.976 | 0.977 | 0.978 | 0.981 | 0.985 | 0.99 | 0.995 | 1.001 |
| 18.4399999999997 | 0.973 | 0.973 | 0.974 | 0.976 | 0.977 | 0.978 | 0.981 | 0.985 | 0.99 | 0.995 | 1.001 |
| 18.4599999999997 | 0.973 | 0.973 | 0.974 | 0.976 | 0.977 | 0.978 | 0.981 | 0.985 | 0.99 | 0.995 | 1.001 |
| 18.47999999999969 | 0.973 | 0.973 | 0.974 | 0.976 | 0.977 | 0.978 | 0.981 | 0.985 | 0.99 | 0.995 | 1.001 |
| 18.49999999999969 | 0.973 | 0.973 | 0.974 | 0.976 | 0.977 | 0.978 | 0.981 | 0.985 | 0.99 | 0.995 | 1.001 |
| 18.51999999999969 | 0.973 | 0.973 | 0.974 | 0.976 | 0.977 | 0.978 | 0.981 | 0.985 | 0.99 | 0.995 | 1.001 |
| 18.53999999999969 | 0.973 | 0.973 | 0.974 | 0.976 | 0.977 | 0.978 | 0.981 | 0.985 | 0.99 | 0.995 | 1.001 |
| 18.55999999999969 | 0.973 | 0.973 | 0.974 | 0.976 | 0.977 | 0.978 | 0.981 | 0.985 | 0.99 | 0.995 | 1.001 |
| 18.57999999999969 | 0.973 | 0.973 | 0.974 | 0.976 | 0.977 | 0.978 | 0.981 | 0.985 | 0.99 | 0.995 | 1.001 |
| 18.59999999999969 | 0.973 | 0.973 | 0.974 | 0.976 | 0.977 | 0.978 | 0.981 | 0.985 | 0.99 | 0.995 | 1.001 |
| 18.6199999999997 | 0.973 | 0.973 | 0.974 | 0.976 | 0.977 | 0.978 | 0.982 | 0.985 | 0.99 | 0.995 | 1.001 |
| 18.6399999999997 | 0.973 | 0.973 | 0.974 | 0.976 | 0.977 | 0.978 | 0.982 | 0.985 | 0.99 | 0.995 | 1.001 |
| 18.6599999999997 | 0.973 | 0.973 | 0.974 | 0.976 | 0.977 | 0.978 | 0.982 | 0.985 | 0.99 | 0.995 | 1.001 |
| 18.6799999999997 | 0.973 | 0.973 | 0.974 | 0.976 | 0.977 | 0.978 | 0.982 | 0.985 | 0.99 | 0.995 | 1.001 |
| 18.6999999999997 | 0.973 | 0.973 | 0.974 | 0.976 | 0.977 | 0.978 | 0.982 | 0.985 | 0.99 | 0.995 | 1.001 |
| 18.71999999999969 | 0.973 | 0.973 | 0.974 | 0.976 | 0.977 | 0.978 | 0.982 | 0.985 | 0.99 | 0.995 | 1.001 |
| 18.73999999999969 | 0.973 | 0.973 | 0.974 | 0.976 | 0.977 | 0.978 | 0.982 | 0.985 | 0.99 | 0.995 | 1.001 |
| 18.75999999999969 | 0.973 | 0.973 | 0.974 | 0.976 | 0.977 | 0.978 | 0.982 | 0.985 | 0.99 | 0.995 | 1.001 |
| 18.77999999999969 | 0.973 | 0.973 | 0.974 | 0.976 | 0.977 | 0.979 | 0.982 | 0.985 | 0.99 | 0.995 | 1.001 |
| 18.79999999999969 | 0.973 | 0.973 | 0.974 | 0.976 | 0.977 | 0.979 | 0.982 | 0.985 | 0.99 | 0.995 | 1.001 |
| 18.81999999999969 | 0.973 | 0.973 | 0.974 | 0.976 | 0.977 | 0.979 | 0.982 | 0.985 | 0.99 | 0.995 | 1 |
| 18.83999999999969 | 0.973 | 0.973 | 0.974 | 0.976 | 0.977 | 0.979 | 0.982 | 0.985 | 0.99 | 0.995 | 1 |
| 18.85999999999969 | 0.973 | 0.973 | 0.974 | 0.976 | 0.977 | 0.979 | 0.982 | 0.985 | 0.99 | 0.995 | 1 |
| 18.87999999999969 | 0.973 | 0.973 | 0.975 | 0.976 | 0.977 | 0.979 | 0.982 | 0.985 | 0.99 | 0.995 | 1 |
| 18.89999999999969 | 0.973 | 0.974 | 0.975 | 0.976 | 0.977 | 0.979 | 0.982 | 0.985 | 0.99 | 0.995 | 1 |
| 18.91999999999969 | 0.973 | 0.974 | 0.975 | 0.976 | 0.977 | 0.979 | 0.982 | 0.985 | 0.99 | 0.995 | 1 |
| 18.93999999999969 | 0.973 | 0.974 | 0.975 | 0.976 | 0.977 | 0.979 | 0.982 | 0.985 | 0.99 | 0.995 | 1 |
| 18.95999999999968 | 0.973 | 0.974 | 0.975 | 0.976 | 0.977 | 0.979 | 0.982 | 0.985 | 0.99 | 0.995 | 1 |
| 18.97999999999968 | 0.973 | 0.974 | 0.975 | 0.976 | 0.977 | 0.979 | 0.982 | 0.985 | 0.99 | 0.995 | 1 |
| 18.99999999999968 | 0.973 | 0.974 | 0.975 | 0.976 | 0.977 | 0.979 | 0.982 | 0.985 | 0.99 | 0.995 | 1 |
| 19.01999999999968 | 0.973 | 0.974 | 0.975 | 0.976 | 0.977 | 0.979 | 0.982 | 0.985 | 0.99 | 0.995 | 1 |
| 19.03999999999968 | 0.973 | 0.974 | 0.975 | 0.976 | 0.977 | 0.979 | 0.982 | 0.985 | 0.99 | 0.995 | 1 |
| 19.05999999999968 | 0.973 | 0.974 | 0.975 | 0.976 | 0.977 | 0.979 | 0.982 | 0.985 | 0.99 | 0.995 | 1 |
| 19.07999999999968 | 0.973 | 0.974 | 0.975 | 0.976 | 0.977 | 0.979 | 0.982 | 0.985 | 0.99 | 0.995 | 1 |
| 19.09999999999968 | 0.973 | 0.974 | 0.975 | 0.976 | 0.977 | 0.979 | 0.982 | 0.985 | 0.99 | 0.995 | 1 |
| 19.11999999999968 | 0.973 | 0.974 | 0.975 | 0.976 | 0.977 | 0.979 | 0.982 | 0.985 | 0.99 | 0.995 | 1 |
| 19.13999999999968 | 0.974 | 0.974 | 0.975 | 0.977 | 0.978 | 0.979 | 0.982 | 0.985 | 0.99 | 0.995 | 1 |
| 19.15999999999968 | 0.974 | 0.974 | 0.975 | 0.977 | 0.978 | 0.979 | 0.982 | 0.985 | 0.99 | 0.995 | 1 |
| 19.17999999999968 | 0.974 | 0.974 | 0.975 | 0.977 | 0.978 | 0.979 | 0.982 | 0.985 | 0.99 | 0.995 | 1 |
| 19.19999999999968 | 0.974 | 0.974 | 0.975 | 0.977 | 0.978 | 0.979 | 0.982 | 0.985 | 0.99 | 0.995 | 1 |
| 19.21999999999968 | 0.974 | 0.974 | 0.975 | 0.977 | 0.978 | 0.979 | 0.982 | 0.985 | 0.99 | 0.994 | 1 |
| 19.23999999999968 | 0.974 | 0.974 | 0.975 | 0.977 | 0.978 | 0.979 | 0.982 | 0.985 | 0.99 | 0.994 | 1 |
| 19.25999999999968 | 0.974 | 0.974 | 0.975 | 0.977 | 0.978 | 0.979 | 0.982 | 0.985 | 0.99 | 0.994 | 1 |
| 19.27999999999968 | 0.974 | 0.974 | 0.975 | 0.977 | 0.978 | 0.979 | 0.982 | 0.985 | 0.99 | 0.994 | 1 |
| 19.29999999999968 | 0.974 | 0.974 | 0.975 | 0.977 | 0.978 | 0.979 | 0.982 | 0.985 | 0.99 | 0.994 | 1 |
| 19.31999999999968 | 0.974 | 0.974 | 0.975 | 0.977 | 0.978 | 0.979 | 0.982 | 0.985 | 0.99 | 0.994 | 1 |
| 19.33999999999968 | 0.974 | 0.974 | 0.975 | 0.977 | 0.978 | 0.979 | 0.982 | 0.985 | 0.99 | 0.994 | 1 |
| 19.35999999999968 | 0.974 | 0.974 | 0.975 | 0.977 | 0.978 | 0.979 | 0.982 | 0.985 | 0.99 | 0.994 | 1 |
| 19.37999999999968 | 0.974 | 0.974 | 0.975 | 0.977 | 0.978 | 0.979 | 0.982 | 0.985 | 0.99 | 0.994 | 1 |
| 19.39999999999968 | 0.974 | 0.974 | 0.975 | 0.977 | 0.978 | 0.979 | 0.982 | 0.985 | 0.99 | 0.994 | 1 |
| 19.41999999999967 | 0.974 | 0.974 | 0.975 | 0.977 | 0.978 | 0.979 | 0.982 | 0.985 | 0.99 | 0.994 | 1 |
| 19.43999999999967 | 0.974 | 0.974 | 0.975 | 0.977 | 0.978 | 0.979 | 0.982 | 0.985 | 0.99 | 0.994 | 1 |
| 19.45999999999967 | 0.974 | 0.974 | 0.975 | 0.977 | 0.978 | 0.979 | 0.982 | 0.985 | 0.99 | 0.994 | 1 |
| 19.47999999999967 | 0.974 | 0.974 | 0.975 | 0.977 | 0.978 | 0.979 | 0.982 | 0.985 | 0.99 | 0.994 | 1 |
| 19.49999999999967 | 0.974 | 0.974 | 0.975 | 0.977 | 0.978 | 0.979 | 0.982 | 0.985 | 0.99 | 0.994 | 1 |
| 19.51999999999967 | 0.974 | 0.974 | 0.975 | 0.977 | 0.978 | 0.979 | 0.982 | 0.985 | 0.99 | 0.994 | 1 |
| 19.53999999999967 | 0.974 | 0.974 | 0.975 | 0.977 | 0.978 | 0.979 | 0.982 | 0.985 | 0.99 | 0.994 | 1 |
| 19.55999999999967 | 0.974 | 0.974 | 0.975 | 0.977 | 0.978 | 0.979 | 0.982 | 0.985 | 0.99 | 0.994 | 1 |
| 19.57999999999967 | 0.974 | 0.974 | 0.975 | 0.977 | 0.978 | 0.979 | 0.982 | 0.985 | 0.99 | 0.994 | 1 |
| 19.59999999999967 | 0.974 | 0.974 | 0.975 | 0.977 | 0.978 | 0.979 | 0.982 | 0.986 | 0.99 | 0.994 | 1 |
| 19.61999999999967 | 0.974 | 0.974 | 0.975 | 0.977 | 0.978 | 0.979 | 0.982 | 0.986 | 0.99 | 0.994 | 0.999 |
| 19.63999999999967 | 0.974 | 0.975 | 0.975 | 0.977 | 0.978 | 0.979 | 0.982 | 0.986 | 0.99 | 0.994 | 0.999 |
| 19.65999999999967 | 0.974 | 0.975 | 0.975 | 0.977 | 0.978 | 0.979 | 0.982 | 0.986 | 0.99 | 0.994 | 0.999 |
| 19.67999999999967 | 0.974 | 0.975 | 0.976 | 0.977 | 0.978 | 0.979 | 0.982 | 0.986 | 0.99 | 0.994 | 0.999 |
| 19.69999999999967 | 0.974 | 0.975 | 0.976 | 0.977 | 0.978 | 0.979 | 0.982 | 0.986 | 0.99 | 0.994 | 0.999 |
| 19.71999999999967 | 0.974 | 0.975 | 0.976 | 0.977 | 0.978 | 0.979 | 0.982 | 0.986 | 0.99 | 0.994 | 0.999 |
| 19.73999999999967 | 0.974 | 0.975 | 0.976 | 0.977 | 0.978 | 0.979 | 0.982 | 0.986 | 0.99 | 0.994 | 0.999 |
| 19.75999999999967 | 0.974 | 0.975 | 0.976 | 0.977 | 0.978 | 0.979 | 0.982 | 0.986 | 0.99 | 0.994 | 0.999 |
| 19.77999999999967 | 0.974 | 0.975 | 0.976 | 0.977 | 0.978 | 0.979 | 0.982 | 0.986 | 0.99 | 0.994 | 0.999 |
| 19.79999999999967 | 0.974 | 0.975 | 0.976 | 0.977 | 0.978 | 0.979 | 0.982 | 0.986 | 0.99 | 0.994 | 0.999 |
| 19.81999999999967 | 0.974 | 0.975 | 0.976 | 0.977 | 0.978 | 0.979 | 0.982 | 0.986 | 0.99 | 0.994 | 0.999 |
| 19.83999999999967 | 0.974 | 0.975 | 0.976 | 0.977 | 0.978 | 0.979 | 0.982 | 0.986 | 0.99 | 0.994 | 0.999 |
| 19.85999999999967 | 0.974 | 0.975 | 0.976 | 0.977 | 0.978 | 0.979 | 0.982 | 0.986 | 0.99 | 0.994 | 0.999 |
| 19.87999999999966 | 0.975 | 0.975 | 0.976 | 0.977 | 0.978 | 0.979 | 0.982 | 0.986 | 0.99 | 0.994 | 0.999 |
| 19.89999999999966 | 0.975 | 0.975 | 0.976 | 0.977 | 0.978 | 0.979 | 0.982 | 0.986 | 0.99 | 0.994 | 0.999 |
| 19.91999999999966 | 0.975 | 0.975 | 0.976 | 0.977 | 0.978 | 0.979 | 0.982 | 0.986 | 0.99 | 0.994 | 0.999 |
| 19.93999999999966 | 0.975 | 0.975 | 0.976 | 0.977 | 0.978 | 0.979 | 0.982 | 0.986 | 0.99 | 0.994 | 0.999 |
| 19.95999999999966 | 0.975 | 0.975 | 0.976 | 0.977 | 0.978 | 0.98 | 0.982 | 0.986 | 0.989 | 0.994 | 0.999 |
| 19.97999999999966 | 0.975 | 0.975 | 0.976 | 0.977 | 0.978 | 0.98 | 0.982 | 0.986 | 0.989 | 0.994 | 0.999 |
| 19.99999999999966 | 0.975 | 0.975 | 0.976 | 0.977 | 0.978 | 0.98 | 0.982 | 0.986 | 0.989 | 0.994 | 0.999 |
| 20.01999999999966 | 0.975 | 0.975 | 0.976 | 0.977 | 0.978 | 0.98 | 0.982 | 0.986 | 0.989 | 0.994 | 0.999 |
| 20.03999999999966 | 0.975 | 0.975 | 0.976 | 0.977 | 0.978 | 0.98 | 0.982 | 0.986 | 0.989 | 0.994 | 0.999 |
| 20.05999999999966 | 0.975 | 0.975 | 0.976 | 0.977 | 0.978 | 0.98 | 0.982 | 0.986 | 0.989 | 0.994 | 0.999 |
| 20.07999999999966 | 0.975 | 0.975 | 0.976 | 0.977 | 0.978 | 0.98 | 0.982 | 0.986 | 0.989 | 0.994 | 0.999 |
| 20.09999999999966 | 0.975 | 0.975 | 0.976 | 0.978 | 0.978 | 0.98 | 0.982 | 0.986 | 0.989 | 0.994 | 0.999 |
| 20.11999999999966 | 0.975 | 0.975 | 0.976 | 0.978 | 0.978 | 0.98 | 0.982 | 0.986 | 0.989 | 0.994 | 0.999 |
| 20.13999999999966 | 0.975 | 0.975 | 0.976 | 0.978 | 0.978 | 0.98 | 0.982 | 0.986 | 0.989 | 0.994 | 0.999 |
| 20.15999999999966 | 0.975 | 0.975 | 0.976 | 0.978 | 0.978 | 0.98 | 0.982 | 0.986 | 0.989 | 0.994 | 0.999 |
| 20.17999999999966 | 0.975 | 0.975 | 0.976 | 0.978 | 0.978 | 0.98 | 0.982 | 0.986 | 0.989 | 0.994 | 0.999 |
| 20.19999999999966 | 0.975 | 0.975 | 0.976 | 0.978 | 0.979 | 0.98 | 0.982 | 0.986 | 0.989 | 0.994 | 0.999 |
| 20.21999999999966 | 0.975 | 0.975 | 0.976 | 0.978 | 0.979 | 0.98 | 0.982 | 0.986 | 0.989 | 0.994 | 0.999 |
| 20.23999999999966 | 0.975 | 0.975 | 0.976 | 0.978 | 0.979 | 0.98 | 0.982 | 0.986 | 0.989 | 0.994 | 0.999 |
| 20.25999999999966 | 0.975 | 0.975 | 0.976 | 0.978 | 0.979 | 0.98 | 0.982 | 0.986 | 0.989 | 0.994 | 0.999 |
| 20.27999999999966 | 0.975 | 0.975 | 0.976 | 0.978 | 0.979 | 0.98 | 0.982 | 0.986 | 0.989 | 0.994 | 0.999 |
| 20.29999999999966 | 0.975 | 0.975 | 0.976 | 0.978 | 0.979 | 0.98 | 0.982 | 0.986 | 0.989 | 0.994 | 0.999 |
| 20.31999999999966 | 0.975 | 0.975 | 0.976 | 0.978 | 0.979 | 0.98 | 0.982 | 0.986 | 0.989 | 0.994 | 0.999 |
| 20.33999999999966 | 0.975 | 0.975 | 0.976 | 0.978 | 0.979 | 0.98 | 0.982 | 0.986 | 0.989 | 0.994 | 0.999 |
| 20.35999999999965 | 0.975 | 0.975 | 0.976 | 0.978 | 0.979 | 0.98 | 0.982 | 0.986 | 0.989 | 0.994 | 0.999 |
| 20.37999999999965 | 0.975 | 0.975 | 0.976 | 0.978 | 0.979 | 0.98 | 0.982 | 0.986 | 0.989 | 0.994 | 0.999 |
| 20.39999999999965 | 0.975 | 0.975 | 0.976 | 0.978 | 0.979 | 0.98 | 0.982 | 0.986 | 0.989 | 0.994 | 0.999 |
| 20.41999999999965 | 0.975 | 0.975 | 0.976 | 0.978 | 0.979 | 0.98 | 0.982 | 0.986 | 0.989 | 0.994 | 0.999 |
| 20.43999999999965 | 0.975 | 0.976 | 0.976 | 0.978 | 0.979 | 0.98 | 0.982 | 0.986 | 0.989 | 0.994 | 0.999 |
| 20.45999999999965 | 0.975 | 0.976 | 0.976 | 0.978 | 0.979 | 0.98 | 0.983 | 0.986 | 0.989 | 0.994 | 0.999 |
| 20.47999999999965 | 0.975 | 0.976 | 0.976 | 0.978 | 0.979 | 0.98 | 0.983 | 0.986 | 0.989 | 0.994 | 0.999 |
| 20.49999999999965 | 0.975 | 0.976 | 0.976 | 0.978 | 0.979 | 0.98 | 0.983 | 0.986 | 0.989 | 0.994 | 0.999 |
| 20.51999999999965 | 0.975 | 0.976 | 0.976 | 0.978 | 0.979 | 0.98 | 0.983 | 0.986 | 0.989 | 0.994 | 0.999 |
| 20.53999999999965 | 0.975 | 0.976 | 0.977 | 0.978 | 0.979 | 0.98 | 0.983 | 0.986 | 0.989 | 0.994 | 0.998 |
| 20.55999999999965 | 0.975 | 0.976 | 0.977 | 0.978 | 0.979 | 0.98 | 0.983 | 0.986 | 0.989 | 0.994 | 0.998 |
| 20.57999999999965 | 0.975 | 0.976 | 0.977 | 0.978 | 0.979 | 0.98 | 0.983 | 0.986 | 0.989 | 0.994 | 0.998 |
| 20.59999999999965 | 0.975 | 0.976 | 0.977 | 0.978 | 0.979 | 0.98 | 0.983 | 0.986 | 0.989 | 0.994 | 0.998 |
| 20.61999999999965 | 0.975 | 0.976 | 0.977 | 0.978 | 0.979 | 0.98 | 0.983 | 0.986 | 0.989 | 0.994 | 0.998 |
| 20.63999999999965 | 0.975 | 0.976 | 0.977 | 0.978 | 0.979 | 0.98 | 0.983 | 0.986 | 0.989 | 0.994 | 0.998 |
| 20.65999999999965 | 0.975 | 0.976 | 0.977 | 0.978 | 0.979 | 0.98 | 0.983 | 0.986 | 0.989 | 0.994 | 0.998 |
| 20.67999999999965 | 0.976 | 0.976 | 0.977 | 0.978 | 0.979 | 0.98 | 0.983 | 0.986 | 0.989 | 0.994 | 0.998 |
| 20.69999999999965 | 0.976 | 0.976 | 0.977 | 0.978 | 0.979 | 0.98 | 0.983 | 0.986 | 0.989 | 0.994 | 0.998 |
| 20.71999999999965 | 0.976 | 0.976 | 0.977 | 0.978 | 0.979 | 0.98 | 0.983 | 0.986 | 0.989 | 0.994 | 0.998 |
| 20.73999999999965 | 0.976 | 0.976 | 0.977 | 0.978 | 0.979 | 0.98 | 0.983 | 0.986 | 0.989 | 0.994 | 0.998 |
| 20.75999999999965 | 0.976 | 0.976 | 0.977 | 0.978 | 0.979 | 0.98 | 0.983 | 0.986 | 0.989 | 0.994 | 0.998 |
| 20.77999999999965 | 0.976 | 0.976 | 0.977 | 0.978 | 0.979 | 0.98 | 0.983 | 0.986 | 0.989 | 0.994 | 0.998 |
| 20.79999999999965 | 0.976 | 0.976 | 0.977 | 0.978 | 0.979 | 0.98 | 0.983 | 0.986 | 0.989 | 0.994 | 0.998 |
| 20.81999999999964 | 0.976 | 0.976 | 0.977 | 0.978 | 0.979 | 0.98 | 0.983 | 0.986 | 0.989 | 0.994 | 0.998 |
| 20.83999999999964 | 0.976 | 0.976 | 0.977 | 0.978 | 0.979 | 0.98 | 0.983 | 0.986 | 0.989 | 0.994 | 0.998 |
| 20.85999999999964 | 0.976 | 0.976 | 0.977 | 0.978 | 0.979 | 0.98 | 0.983 | 0.986 | 0.989 | 0.994 | 0.998 |
| 20.87999999999964 | 0.976 | 0.976 | 0.977 | 0.978 | 0.979 | 0.98 | 0.983 | 0.986 | 0.989 | 0.994 | 0.998 |
| 20.89999999999964 | 0.976 | 0.976 | 0.977 | 0.978 | 0.979 | 0.98 | 0.983 | 0.986 | 0.989 | 0.993 | 0.998 |
| 20.91999999999964 | 0.976 | 0.976 | 0.977 | 0.978 | 0.979 | 0.98 | 0.983 | 0.986 | 0.989 | 0.993 | 0.998 |
| 20.93999999999964 | 0.976 | 0.976 | 0.977 | 0.978 | 0.979 | 0.98 | 0.983 | 0.986 | 0.989 | 0.993 | 0.998 |
| 20.95999999999964 | 0.976 | 0.976 | 0.977 | 0.978 | 0.979 | 0.98 | 0.983 | 0.986 | 0.989 | 0.993 | 0.998 |
| 20.97999999999964 | 0.976 | 0.976 | 0.977 | 0.978 | 0.979 | 0.98 | 0.983 | 0.986 | 0.989 | 0.993 | 0.998 |
| 20.99999999999964 | 0.976 | 0.976 | 0.977 | 0.978 | 0.979 | 0.98 | 0.983 | 0.986 | 0.989 | 0.993 | 0.998 |
| 21.01999999999964 | 0.976 | 0.976 | 0.977 | 0.978 | 0.979 | 0.98 | 0.983 | 0.986 | 0.989 | 0.993 | 0.998 |
| 21.03999999999964 | 0.976 | 0.976 | 0.977 | 0.978 | 0.979 | 0.98 | 0.983 | 0.986 | 0.989 | 0.993 | 0.998 |
| 21.05999999999964 | 0.976 | 0.976 | 0.977 | 0.978 | 0.979 | 0.98 | 0.983 | 0.986 | 0.989 | 0.993 | 0.998 |
| 21.07999999999964 | 0.976 | 0.976 | 0.977 | 0.978 | 0.979 | 0.98 | 0.983 | 0.986 | 0.989 | 0.993 | 0.998 |
| 21.09999999999964 | 0.976 | 0.976 | 0.977 | 0.978 | 0.979 | 0.98 | 0.983 | 0.986 | 0.989 | 0.993 | 0.998 |
| 21.11999999999964 | 0.976 | 0.976 | 0.977 | 0.978 | 0.979 | 0.98 | 0.983 | 0.986 | 0.989 | 0.993 | 0.998 |
| 21.13999999999964 | 0.976 | 0.976 | 0.977 | 0.979 | 0.979 | 0.98 | 0.983 | 0.986 | 0.989 | 0.993 | 0.998 |
| 21.15999999999964 | 0.976 | 0.976 | 0.977 | 0.979 | 0.979 | 0.98 | 0.983 | 0.986 | 0.989 | 0.993 | 0.998 |
| 21.17999999999964 | 0.976 | 0.976 | 0.977 | 0.979 | 0.979 | 0.98 | 0.983 | 0.986 | 0.989 | 0.993 | 0.998 |
| 21.19999999999964 | 0.976 | 0.976 | 0.977 | 0.979 | 0.979 | 0.98 | 0.983 | 0.986 | 0.989 | 0.993 | 0.998 |
| 21.21999999999964 | 0.976 | 0.976 | 0.977 | 0.979 | 0.979 | 0.98 | 0.983 | 0.986 | 0.989 | 0.993 | 0.998 |
| 21.23999999999964 | 0.976 | 0.976 | 0.977 | 0.979 | 0.979 | 0.98 | 0.983 | 0.986 | 0.989 | 0.993 | 0.998 |
| 21.25999999999964 | 0.976 | 0.976 | 0.977 | 0.979 | 0.979 | 0.981 | 0.983 | 0.986 | 0.989 | 0.993 | 0.998 |
| 21.27999999999964 | 0.976 | 0.976 | 0.977 | 0.979 | 0.979 | 0.981 | 0.983 | 0.986 | 0.989 | 0.993 | 0.998 |
| 21.29999999999963 | 0.976 | 0.977 | 0.977 | 0.979 | 0.979 | 0.981 | 0.983 | 0.986 | 0.989 | 0.993 | 0.998 |
| 21.31999999999963 | 0.976 | 0.977 | 0.977 | 0.979 | 0.979 | 0.981 | 0.983 | 0.986 | 0.989 | 0.993 | 0.998 |
| 21.33999999999963 | 0.976 | 0.977 | 0.977 | 0.979 | 0.979 | 0.981 | 0.983 | 0.986 | 0.989 | 0.993 | 0.998 |
| 21.35999999999963 | 0.976 | 0.977 | 0.977 | 0.979 | 0.98 | 0.981 | 0.983 | 0.986 | 0.989 | 0.993 | 0.998 |
| 21.37999999999963 | 0.976 | 0.977 | 0.977 | 0.979 | 0.98 | 0.981 | 0.983 | 0.986 | 0.989 | 0.993 | 0.998 |
| 21.39999999999963 | 0.976 | 0.977 | 0.977 | 0.979 | 0.98 | 0.981 | 0.983 | 0.986 | 0.989 | 0.993 | 0.998 |
| 21.41999999999963 | 0.976 | 0.977 | 0.977 | 0.979 | 0.98 | 0.981 | 0.983 | 0.986 | 0.989 | 0.993 | 0.998 |
| 21.43999999999963 | 0.976 | 0.977 | 0.977 | 0.979 | 0.98 | 0.981 | 0.983 | 0.986 | 0.989 | 0.993 | 0.998 |
| 21.45999999999963 | 0.976 | 0.977 | 0.977 | 0.979 | 0.98 | 0.981 | 0.983 | 0.986 | 0.989 | 0.993 | 0.998 |
| 21.47999999999963 | 0.976 | 0.977 | 0.978 | 0.979 | 0.98 | 0.981 | 0.983 | 0.986 | 0.989 | 0.993 | 0.998 |
| 21.49999999999963 | 0.976 | 0.977 | 0.978 | 0.979 | 0.98 | 0.981 | 0.983 | 0.986 | 0.989 | 0.993 | 0.998 |
| 21.51999999999963 | 0.976 | 0.977 | 0.978 | 0.979 | 0.98 | 0.981 | 0.983 | 0.986 | 0.989 | 0.993 | 0.998 |
| 21.53999999999963 | 0.977 | 0.977 | 0.978 | 0.979 | 0.98 | 0.981 | 0.983 | 0.986 | 0.989 | 0.993 | 0.998 |
| 21.55999999999963 | 0.977 | 0.977 | 0.978 | 0.979 | 0.98 | 0.981 | 0.983 | 0.986 | 0.989 | 0.993 | 0.998 |
| 21.57999999999963 | 0.977 | 0.977 | 0.978 | 0.979 | 0.98 | 0.981 | 0.983 | 0.986 | 0.989 | 0.993 | 0.998 |
| 21.59999999999963 | 0.977 | 0.977 | 0.978 | 0.979 | 0.98 | 0.981 | 0.983 | 0.986 | 0.989 | 0.993 | 0.998 |
| 21.61999999999963 | 0.977 | 0.977 | 0.978 | 0.979 | 0.98 | 0.981 | 0.983 | 0.986 | 0.989 | 0.993 | 0.998 |
| 21.63999999999963 | 0.977 | 0.977 | 0.978 | 0.979 | 0.98 | 0.981 | 0.983 | 0.986 | 0.989 | 0.993 | 0.998 |
| 21.65999999999963 | 0.977 | 0.977 | 0.978 | 0.979 | 0.98 | 0.981 | 0.983 | 0.986 | 0.989 | 0.993 | 0.997 |
| 21.67999999999963 | 0.977 | 0.977 | 0.978 | 0.979 | 0.98 | 0.981 | 0.983 | 0.986 | 0.989 | 0.993 | 0.997 |
| 21.69999999999963 | 0.977 | 0.977 | 0.978 | 0.979 | 0.98 | 0.981 | 0.983 | 0.986 | 0.989 | 0.993 | 0.997 |
| 21.71999999999963 | 0.977 | 0.977 | 0.978 | 0.979 | 0.98 | 0.981 | 0.983 | 0.986 | 0.989 | 0.993 | 0.997 |
| 21.73999999999963 | 0.977 | 0.977 | 0.978 | 0.979 | 0.98 | 0.981 | 0.983 | 0.986 | 0.989 | 0.993 | 0.997 |
| 21.75999999999962 | 0.977 | 0.977 | 0.978 | 0.979 | 0.98 | 0.981 | 0.983 | 0.986 | 0.989 | 0.993 | 0.997 |
| 21.77999999999962 | 0.977 | 0.977 | 0.978 | 0.979 | 0.98 | 0.981 | 0.983 | 0.986 | 0.989 | 0.993 | 0.997 |
| 21.79999999999962 | 0.977 | 0.977 | 0.978 | 0.979 | 0.98 | 0.981 | 0.983 | 0.986 | 0.989 | 0.993 | 0.997 |
| 21.81999999999962 | 0.977 | 0.977 | 0.978 | 0.979 | 0.98 | 0.981 | 0.983 | 0.986 | 0.989 | 0.993 | 0.997 |
| 21.83999999999962 | 0.977 | 0.977 | 0.978 | 0.979 | 0.98 | 0.981 | 0.983 | 0.986 | 0.989 | 0.993 | 0.997 |
| 21.85999999999962 | 0.977 | 0.977 | 0.978 | 0.979 | 0.98 | 0.981 | 0.983 | 0.986 | 0.989 | 0.993 | 0.997 |
| 21.87999999999962 | 0.977 | 0.977 | 0.978 | 0.979 | 0.98 | 0.981 | 0.983 | 0.986 | 0.989 | 0.993 | 0.997 |
| 21.89999999999962 | 0.977 | 0.977 | 0.978 | 0.979 | 0.98 | 0.981 | 0.983 | 0.986 | 0.989 | 0.993 | 0.997 |
| 21.91999999999962 | 0.977 | 0.977 | 0.978 | 0.979 | 0.98 | 0.981 | 0.983 | 0.986 | 0.989 | 0.993 | 0.997 |
| 21.93999999999962 | 0.977 | 0.977 | 0.978 | 0.979 | 0.98 | 0.981 | 0.983 | 0.986 | 0.989 | 0.993 | 0.997 |
| 21.95999999999962 | 0.977 | 0.977 | 0.978 | 0.979 | 0.98 | 0.981 | 0.983 | 0.986 | 0.989 | 0.993 | 0.997 |
| 21.97999999999962 | 0.977 | 0.977 | 0.978 | 0.979 | 0.98 | 0.981 | 0.983 | 0.986 | 0.989 | 0.993 | 0.997 |
| 21.99999999999962 | 0.977 | 0.977 | 0.978 | 0.979 | 0.98 | 0.981 | 0.983 | 0.986 | 0.989 | 0.993 | 0.997 |
| 22.01999999999962 | 0.977 | 0.977 | 0.978 | 0.979 | 0.98 | 0.981 | 0.983 | 0.986 | 0.989 | 0.993 | 0.997 |
| 22.03999999999962 | 0.977 | 0.977 | 0.978 | 0.979 | 0.98 | 0.981 | 0.983 | 0.986 | 0.989 | 0.993 | 0.997 |
| 22.05999999999962 | 0.977 | 0.977 | 0.978 | 0.979 | 0.98 | 0.981 | 0.983 | 0.986 | 0.989 | 0.993 | 0.997 |
| 22.07999999999962 | 0.977 | 0.977 | 0.978 | 0.979 | 0.98 | 0.981 | 0.983 | 0.986 | 0.989 | 0.993 | 0.997 |
| 22.09999999999962 | 0.977 | 0.977 | 0.978 | 0.979 | 0.98 | 0.981 | 0.983 | 0.986 | 0.989 | 0.993 | 0.997 |
| 22.11999999999962 | 0.977 | 0.977 | 0.978 | 0.979 | 0.98 | 0.981 | 0.983 | 0.986 | 0.989 | 0.993 | 0.997 |
| 22.13999999999962 | 0.977 | 0.977 | 0.978 | 0.979 | 0.98 | 0.981 | 0.983 | 0.986 | 0.989 | 0.993 | 0.997 |
| 22.15999999999962 | 0.977 | 0.977 | 0.978 | 0.979 | 0.98 | 0.981 | 0.983 | 0.986 | 0.989 | 0.993 | 0.997 |
| 22.17999999999962 | 0.977 | 0.977 | 0.978 | 0.979 | 0.98 | 0.981 | 0.983 | 0.986 | 0.989 | 0.993 | 0.997 |
| 22.19999999999962 | 0.977 | 0.977 | 0.978 | 0.979 | 0.98 | 0.981 | 0.983 | 0.986 | 0.989 | 0.993 | 0.997 |
| 22.21999999999962 | 0.977 | 0.977 | 0.978 | 0.979 | 0.98 | 0.981 | 0.983 | 0.986 | 0.989 | 0.993 | 0.997 |
| 22.23999999999961 | 0.977 | 0.978 | 0.978 | 0.979 | 0.98 | 0.981 | 0.983 | 0.986 | 0.989 | 0.993 | 0.997 |
| 22.25999999999961 | 0.977 | 0.978 | 0.978 | 0.979 | 0.98 | 0.981 | 0.983 | 0.986 | 0.989 | 0.993 | 0.997 |
| 22.27999999999961 | 0.977 | 0.978 | 0.978 | 0.98 | 0.98 | 0.981 | 0.983 | 0.986 | 0.989 | 0.993 | 0.997 |
| 22.29999999999961 | 0.977 | 0.978 | 0.978 | 0.98 | 0.98 | 0.981 | 0.983 | 0.986 | 0.989 | 0.993 | 0.997 |
| 22.31999999999961 | 0.977 | 0.978 | 0.978 | 0.98 | 0.98 | 0.981 | 0.983 | 0.986 | 0.989 | 0.993 | 0.997 |
| 22.33999999999961 | 0.977 | 0.978 | 0.978 | 0.98 | 0.98 | 0.981 | 0.983 | 0.986 | 0.989 | 0.993 | 0.997 |
| 22.35999999999961 | 0.977 | 0.978 | 0.978 | 0.98 | 0.98 | 0.981 | 0.983 | 0.986 | 0.989 | 0.993 | 0.997 |
| 22.37999999999961 | 0.977 | 0.978 | 0.978 | 0.98 | 0.98 | 0.981 | 0.983 | 0.986 | 0.989 | 0.993 | 0.997 |
| 22.39999999999961 | 0.977 | 0.978 | 0.978 | 0.98 | 0.98 | 0.981 | 0.983 | 0.986 | 0.989 | 0.993 | 0.997 |
| 22.41999999999961 | 0.977 | 0.978 | 0.978 | 0.98 | 0.98 | 0.981 | 0.984 | 0.986 | 0.989 | 0.993 | 0.997 |
| 22.43999999999961 | 0.977 | 0.978 | 0.978 | 0.98 | 0.98 | 0.981 | 0.984 | 0.986 | 0.989 | 0.993 | 0.997 |
| 22.45999999999961 | 0.977 | 0.978 | 0.978 | 0.98 | 0.98 | 0.981 | 0.984 | 0.986 | 0.989 | 0.993 | 0.997 |
| 22.47999999999961 | 0.978 | 0.978 | 0.978 | 0.98 | 0.98 | 0.981 | 0.984 | 0.986 | 0.989 | 0.993 | 0.997 |
| 22.49999999999961 | 0.978 | 0.978 | 0.978 | 0.98 | 0.98 | 0.981 | 0.984 | 0.986 | 0.989 | 0.993 | 0.997 |
| 22.51999999999961 | 0.978 | 0.978 | 0.979 | 0.98 | 0.98 | 0.981 | 0.984 | 0.986 | 0.989 | 0.993 | 0.997 |
| 22.53999999999961 | 0.978 | 0.978 | 0.979 | 0.98 | 0.98 | 0.981 | 0.984 | 0.986 | 0.989 | 0.993 | 0.997 |
| 22.55999999999961 | 0.978 | 0.978 | 0.979 | 0.98 | 0.98 | 0.981 | 0.984 | 0.986 | 0.989 | 0.993 | 0.997 |
| 22.57999999999961 | 0.978 | 0.978 | 0.979 | 0.98 | 0.98 | 0.981 | 0.984 | 0.986 | 0.989 | 0.993 | 0.997 |
| 22.59999999999961 | 0.978 | 0.978 | 0.979 | 0.98 | 0.98 | 0.981 | 0.984 | 0.986 | 0.989 | 0.993 | 0.997 |
| 22.61999999999961 | 0.978 | 0.978 | 0.979 | 0.98 | 0.981 | 0.981 | 0.984 | 0.986 | 0.989 | 0.993 | 0.997 |
| 22.63999999999961 | 0.978 | 0.978 | 0.979 | 0.98 | 0.981 | 0.981 | 0.984 | 0.986 | 0.989 | 0.993 | 0.997 |
| 22.65999999999961 | 0.978 | 0.978 | 0.979 | 0.98 | 0.981 | 0.981 | 0.984 | 0.986 | 0.989 | 0.993 | 0.997 |
| 22.67999999999961 | 0.978 | 0.978 | 0.979 | 0.98 | 0.981 | 0.981 | 0.984 | 0.986 | 0.989 | 0.993 | 0.997 |
| 22.6999999999996 | 0.978 | 0.978 | 0.979 | 0.98 | 0.981 | 0.982 | 0.984 | 0.986 | 0.989 | 0.993 | 0.997 |
| 22.7199999999996 | 0.978 | 0.978 | 0.979 | 0.98 | 0.981 | 0.982 | 0.984 | 0.986 | 0.989 | 0.993 | 0.997 |
| 22.7399999999996 | 0.978 | 0.978 | 0.979 | 0.98 | 0.981 | 0.982 | 0.984 | 0.986 | 0.989 | 0.993 | 0.997 |
| 22.7599999999996 | 0.978 | 0.978 | 0.979 | 0.98 | 0.981 | 0.982 | 0.984 | 0.986 | 0.989 | 0.993 | 0.997 |
| 22.7799999999996 | 0.978 | 0.978 | 0.979 | 0.98 | 0.981 | 0.982 | 0.984 | 0.986 | 0.989 | 0.993 | 0.997 |
| 22.7999999999996 | 0.978 | 0.978 | 0.979 | 0.98 | 0.981 | 0.982 | 0.984 | 0.986 | 0.989 | 0.993 | 0.997 |
| 22.8199999999996 | 0.978 | 0.978 | 0.979 | 0.98 | 0.981 | 0.982 | 0.984 | 0.986 | 0.989 | 0.993 | 0.997 |
| 22.8399999999996 | 0.978 | 0.978 | 0.979 | 0.98 | 0.981 | 0.982 | 0.984 | 0.986 | 0.989 | 0.993 | 0.997 |
| 22.8599999999996 | 0.978 | 0.978 | 0.979 | 0.98 | 0.981 | 0.982 | 0.984 | 0.986 | 0.989 | 0.993 | 0.997 |
| 22.8799999999996 | 0.978 | 0.978 | 0.979 | 0.98 | 0.981 | 0.982 | 0.984 | 0.986 | 0.989 | 0.993 | 0.997 |
| 22.8999999999996 | 0.978 | 0.978 | 0.979 | 0.98 | 0.981 | 0.982 | 0.984 | 0.986 | 0.989 | 0.993 | 0.997 |
| 22.9199999999996 | 0.978 | 0.978 | 0.979 | 0.98 | 0.981 | 0.982 | 0.984 | 0.986 | 0.989 | 0.993 | 0.997 |
| 22.9399999999996 | 0.978 | 0.978 | 0.979 | 0.98 | 0.981 | 0.982 | 0.984 | 0.986 | 0.989 | 0.993 | 0.997 |
| 22.9599999999996 | 0.978 | 0.978 | 0.979 | 0.98 | 0.981 | 0.982 | 0.984 | 0.986 | 0.989 | 0.993 | 0.997 |
| 22.9799999999996 | 0.978 | 0.978 | 0.979 | 0.98 | 0.981 | 0.982 | 0.984 | 0.986 | 0.989 | 0.993 | 0.997 |
| 22.9999999999996 | 0.978 | 0.978 | 0.979 | 0.98 | 0.981 | 0.982 | 0.984 | 0.986 | 0.989 | 0.993 | 0.997 |
| 23.0199999999996 | 0.978 | 0.978 | 0.979 | 0.98 | 0.981 | 0.982 | 0.984 | 0.986 | 0.989 | 0.993 | 0.997 |
| 23.0399999999996 | 0.978 | 0.978 | 0.979 | 0.98 | 0.981 | 0.982 | 0.984 | 0.986 | 0.989 | 0.993 | 0.997 |
| 23.0599999999996 | 0.978 | 0.978 | 0.979 | 0.98 | 0.981 | 0.982 | 0.984 | 0.986 | 0.989 | 0.993 | 0.997 |
| 23.0799999999996 | 0.978 | 0.978 | 0.979 | 0.98 | 0.981 | 0.982 | 0.984 | 0.986 | 0.989 | 0.993 | 0.997 |
| 23.0999999999996 | 0.978 | 0.978 | 0.979 | 0.98 | 0.981 | 0.982 | 0.984 | 0.986 | 0.989 | 0.993 | 0.997 |
| 23.1199999999996 | 0.978 | 0.978 | 0.979 | 0.98 | 0.981 | 0.982 | 0.984 | 0.986 | 0.989 | 0.993 | 0.996 |
| 23.1399999999996 | 0.978 | 0.978 | 0.979 | 0.98 | 0.981 | 0.982 | 0.984 | 0.986 | 0.989 | 0.993 | 0.996 |
| 23.1599999999996 | 0.978 | 0.978 | 0.979 | 0.98 | 0.981 | 0.982 | 0.984 | 0.986 | 0.989 | 0.993 | 0.996 |
| 23.17999999999959 | 0.978 | 0.978 | 0.979 | 0.98 | 0.981 | 0.982 | 0.984 | 0.986 | 0.989 | 0.993 | 0.996 |
| 23.19999999999959 | 0.978 | 0.978 | 0.979 | 0.98 | 0.981 | 0.982 | 0.984 | 0.986 | 0.989 | 0.993 | 0.996 |
| 23.21999999999959 | 0.978 | 0.978 | 0.979 | 0.98 | 0.981 | 0.982 | 0.984 | 0.986 | 0.989 | 0.993 | 0.996 |
| 23.23999999999959 | 0.978 | 0.978 | 0.979 | 0.98 | 0.981 | 0.982 | 0.984 | 0.986 | 0.989 | 0.993 | 0.996 |
| 23.25999999999959 | 0.978 | 0.978 | 0.979 | 0.98 | 0.981 | 0.982 | 0.984 | 0.986 | 0.989 | 0.993 | 0.996 |
| 23.27999999999959 | 0.978 | 0.979 | 0.979 | 0.98 | 0.981 | 0.982 | 0.984 | 0.986 | 0.989 | 0.993 | 0.996 |
| 23.29999999999959 | 0.978 | 0.979 | 0.979 | 0.98 | 0.981 | 0.982 | 0.984 | 0.986 | 0.989 | 0.993 | 0.996 |
| 23.3199999999996 | 0.978 | 0.979 | 0.979 | 0.98 | 0.981 | 0.982 | 0.984 | 0.986 | 0.989 | 0.993 | 0.996 |
| 23.3399999999996 | 0.978 | 0.979 | 0.979 | 0.98 | 0.981 | 0.982 | 0.984 | 0.986 | 0.989 | 0.993 | 0.996 |
| 23.3599999999996 | 0.978 | 0.979 | 0.979 | 0.98 | 0.981 | 0.982 | 0.984 | 0.986 | 0.989 | 0.993 | 0.996 |
| 23.3799999999996 | 0.978 | 0.979 | 0.979 | 0.98 | 0.981 | 0.982 | 0.984 | 0.986 | 0.989 | 0.993 | 0.996 |
| 23.39999999999959 | 0.978 | 0.979 | 0.979 | 0.98 | 0.981 | 0.982 | 0.984 | 0.986 | 0.989 | 0.993 | 0.996 |
| 23.41999999999959 | 0.978 | 0.979 | 0.979 | 0.98 | 0.981 | 0.982 | 0.984 | 0.986 | 0.989 | 0.993 | 0.996 |
| 23.43999999999959 | 0.978 | 0.979 | 0.979 | 0.98 | 0.981 | 0.982 | 0.984 | 0.986 | 0.989 | 0.993 | 0.996 |
| 23.45999999999959 | 0.978 | 0.979 | 0.979 | 0.98 | 0.981 | 0.982 | 0.984 | 0.986 | 0.989 | 0.993 | 0.996 |
| 23.47999999999959 | 0.978 | 0.979 | 0.979 | 0.98 | 0.981 | 0.982 | 0.984 | 0.986 | 0.989 | 0.993 | 0.996 |
| 23.49999999999959 | 0.978 | 0.979 | 0.979 | 0.98 | 0.981 | 0.982 | 0.984 | 0.986 | 0.989 | 0.993 | 0.996 |
| 23.51999999999959 | 0.979 | 0.979 | 0.979 | 0.98 | 0.981 | 0.982 | 0.984 | 0.986 | 0.989 | 0.993 | 0.996 |
| 23.53999999999959 | 0.979 | 0.979 | 0.979 | 0.981 | 0.981 | 0.982 | 0.984 | 0.986 | 0.989 | 0.993 | 0.996 |
| 23.55999999999959 | 0.979 | 0.979 | 0.979 | 0.981 | 0.981 | 0.982 | 0.984 | 0.986 | 0.989 | 0.993 | 0.996 |
| 23.57999999999959 | 0.979 | 0.979 | 0.979 | 0.981 | 0.981 | 0.982 | 0.984 | 0.986 | 0.989 | 0.993 | 0.996 |
| 23.59999999999959 | 0.979 | 0.979 | 0.979 | 0.981 | 0.981 | 0.982 | 0.984 | 0.986 | 0.989 | 0.993 | 0.996 |
| 23.61999999999958 | 0.979 | 0.979 | 0.979 | 0.981 | 0.981 | 0.982 | 0.984 | 0.986 | 0.989 | 0.993 | 0.996 |
| 23.63999999999958 | 0.979 | 0.979 | 0.979 | 0.981 | 0.981 | 0.982 | 0.984 | 0.986 | 0.989 | 0.993 | 0.996 |
| 23.65999999999958 | 0.979 | 0.979 | 0.98 | 0.981 | 0.981 | 0.982 | 0.984 | 0.986 | 0.989 | 0.993 | 0.996 |
| 23.67999999999958 | 0.979 | 0.979 | 0.98 | 0.981 | 0.981 | 0.982 | 0.984 | 0.986 | 0.989 | 0.993 | 0.996 |
| 23.69999999999958 | 0.979 | 0.979 | 0.98 | 0.981 | 0.981 | 0.982 | 0.984 | 0.986 | 0.989 | 0.993 | 0.996 |
| 23.71999999999958 | 0.979 | 0.979 | 0.98 | 0.981 | 0.981 | 0.982 | 0.984 | 0.986 | 0.989 | 0.993 | 0.996 |
| 23.73999999999958 | 0.979 | 0.979 | 0.98 | 0.981 | 0.981 | 0.982 | 0.984 | 0.986 | 0.989 | 0.993 | 0.996 |
| 23.75999999999958 | 0.979 | 0.979 | 0.98 | 0.981 | 0.981 | 0.982 | 0.984 | 0.987 | 0.989 | 0.993 | 0.996 |
| 23.77999999999958 | 0.979 | 0.979 | 0.98 | 0.981 | 0.981 | 0.982 | 0.984 | 0.987 | 0.989 | 0.992 | 0.996 |
| 23.79999999999958 | 0.979 | 0.979 | 0.98 | 0.981 | 0.981 | 0.982 | 0.984 | 0.987 | 0.989 | 0.992 | 0.996 |
| 23.81999999999958 | 0.979 | 0.979 | 0.98 | 0.981 | 0.981 | 0.982 | 0.984 | 0.987 | 0.989 | 0.992 | 0.996 |
| 23.83999999999958 | 0.979 | 0.979 | 0.98 | 0.981 | 0.981 | 0.982 | 0.984 | 0.987 | 0.989 | 0.992 | 0.996 |
| 23.85999999999958 | 0.979 | 0.979 | 0.98 | 0.981 | 0.981 | 0.982 | 0.984 | 0.987 | 0.989 | 0.992 | 0.996 |
| 23.87999999999958 | 0.979 | 0.979 | 0.98 | 0.981 | 0.981 | 0.982 | 0.984 | 0.987 | 0.989 | 0.992 | 0.996 |
| 23.89999999999958 | 0.979 | 0.979 | 0.98 | 0.981 | 0.981 | 0.982 | 0.984 | 0.987 | 0.989 | 0.992 | 0.996 |
| 23.91999999999958 | 0.979 | 0.979 | 0.98 | 0.981 | 0.981 | 0.982 | 0.984 | 0.987 | 0.989 | 0.992 | 0.996 |
| 23.93999999999958 | 0.979 | 0.979 | 0.98 | 0.981 | 0.981 | 0.982 | 0.984 | 0.987 | 0.989 | 0.992 | 0.996 |
| 23.95999999999958 | 0.979 | 0.979 | 0.98 | 0.981 | 0.981 | 0.982 | 0.984 | 0.987 | 0.989 | 0.992 | 0.996 |
| 23.97999999999958 | 0.979 | 0.979 | 0.98 | 0.981 | 0.981 | 0.982 | 0.984 | 0.987 | 0.989 | 0.992 | 0.996 |
| 23.99999999999958 | 0.979 | 0.979 | 0.98 | 0.981 | 0.981 | 0.982 | 0.984 | 0.987 | 0.989 | 0.992 | 0.996 |
| 24.01999999999958 | 0.979 | 0.979 | 0.98 | 0.981 | 0.982 | 0.982 | 0.984 | 0.987 | 0.989 | 0.992 | 0.996 |
| 24.03999999999958 | 0.979 | 0.979 | 0.98 | 0.981 | 0.982 | 0.982 | 0.984 | 0.987 | 0.989 | 0.992 | 0.996 |
| 24.05999999999958 | 0.979 | 0.979 | 0.98 | 0.981 | 0.982 | 0.982 | 0.984 | 0.987 | 0.989 | 0.992 | 0.996 |
| 24.07999999999958 | 0.979 | 0.979 | 0.98 | 0.981 | 0.982 | 0.982 | 0.984 | 0.987 | 0.989 | 0.992 | 0.996 |
| 24.09999999999958 | 0.979 | 0.979 | 0.98 | 0.981 | 0.982 | 0.982 | 0.984 | 0.987 | 0.989 | 0.992 | 0.996 |
| 24.11999999999957 | 0.979 | 0.979 | 0.98 | 0.981 | 0.982 | 0.982 | 0.984 | 0.987 | 0.989 | 0.992 | 0.996 |
| 24.13999999999957 | 0.979 | 0.979 | 0.98 | 0.981 | 0.982 | 0.982 | 0.984 | 0.987 | 0.989 | 0.992 | 0.996 |
| 24.15999999999957 | 0.979 | 0.979 | 0.98 | 0.981 | 0.982 | 0.982 | 0.984 | 0.987 | 0.989 | 0.992 | 0.996 |
| 24.17999999999957 | 0.979 | 0.979 | 0.98 | 0.981 | 0.982 | 0.982 | 0.984 | 0.987 | 0.989 | 0.992 | 0.996 |
| 24.19999999999957 | 0.979 | 0.979 | 0.98 | 0.981 | 0.982 | 0.982 | 0.984 | 0.987 | 0.989 | 0.992 | 0.996 |
| 24.21999999999957 | 0.979 | 0.979 | 0.98 | 0.981 | 0.982 | 0.982 | 0.984 | 0.987 | 0.989 | 0.992 | 0.996 |
| 24.23999999999957 | 0.979 | 0.979 | 0.98 | 0.981 | 0.982 | 0.982 | 0.984 | 0.987 | 0.989 | 0.992 | 0.996 |
| 24.25999999999957 | 0.979 | 0.979 | 0.98 | 0.981 | 0.982 | 0.982 | 0.984 | 0.987 | 0.989 | 0.992 | 0.996 |
| 24.27999999999957 | 0.979 | 0.979 | 0.98 | 0.981 | 0.982 | 0.983 | 0.984 | 0.987 | 0.989 | 0.992 | 0.996 |
| 24.29999999999957 | 0.979 | 0.979 | 0.98 | 0.981 | 0.982 | 0.983 | 0.984 | 0.987 | 0.989 | 0.992 | 0.996 |
| 24.31999999999957 | 0.979 | 0.979 | 0.98 | 0.981 | 0.982 | 0.983 | 0.984 | 0.987 | 0.989 | 0.992 | 0.996 |
| 24.33999999999957 | 0.979 | 0.979 | 0.98 | 0.981 | 0.982 | 0.983 | 0.984 | 0.987 | 0.989 | 0.992 | 0.996 |
| 24.35999999999957 | 0.979 | 0.979 | 0.98 | 0.981 | 0.982 | 0.983 | 0.984 | 0.987 | 0.989 | 0.992 | 0.996 |
| 24.37999999999957 | 0.979 | 0.979 | 0.98 | 0.981 | 0.982 | 0.983 | 0.984 | 0.987 | 0.989 | 0.992 | 0.996 |
| 24.39999999999957 | 0.979 | 0.979 | 0.98 | 0.981 | 0.982 | 0.983 | 0.984 | 0.987 | 0.989 | 0.992 | 0.996 |
| 24.41999999999957 | 0.979 | 0.98 | 0.98 | 0.981 | 0.982 | 0.983 | 0.984 | 0.987 | 0.989 | 0.992 | 0.996 |
| 24.43999999999957 | 0.979 | 0.98 | 0.98 | 0.981 | 0.982 | 0.983 | 0.984 | 0.987 | 0.989 | 0.992 | 0.996 |
| 24.45999999999957 | 0.979 | 0.98 | 0.98 | 0.981 | 0.982 | 0.983 | 0.984 | 0.987 | 0.989 | 0.992 | 0.996 |
| 24.47999999999957 | 0.979 | 0.98 | 0.98 | 0.981 | 0.982 | 0.983 | 0.984 | 0.987 | 0.989 | 0.992 | 0.996 |
| 24.49999999999957 | 0.979 | 0.98 | 0.98 | 0.981 | 0.982 | 0.983 | 0.984 | 0.987 | 0.989 | 0.992 | 0.996 |
| 24.51999999999957 | 0.979 | 0.98 | 0.98 | 0.981 | 0.982 | 0.983 | 0.984 | 0.987 | 0.989 | 0.992 | 0.996 |
| 24.53999999999957 | 0.979 | 0.98 | 0.98 | 0.981 | 0.982 | 0.983 | 0.984 | 0.987 | 0.989 | 0.992 | 0.996 |
| 24.55999999999957 | 0.979 | 0.98 | 0.98 | 0.981 | 0.982 | 0.983 | 0.984 | 0.987 | 0.989 | 0.992 | 0.996 |
| 24.57999999999956 | 0.979 | 0.98 | 0.98 | 0.981 | 0.982 | 0.983 | 0.985 | 0.987 | 0.989 | 0.992 | 0.996 |
| 24.59999999999956 | 0.979 | 0.98 | 0.98 | 0.981 | 0.982 | 0.983 | 0.985 | 0.987 | 0.989 | 0.992 | 0.996 |
| 24.61999999999956 | 0.979 | 0.98 | 0.98 | 0.981 | 0.982 | 0.983 | 0.985 | 0.987 | 0.989 | 0.992 | 0.996 |
| 24.63999999999956 | 0.979 | 0.98 | 0.98 | 0.981 | 0.982 | 0.983 | 0.985 | 0.987 | 0.989 | 0.992 | 0.996 |
| 24.65999999999956 | 0.98 | 0.98 | 0.98 | 0.981 | 0.982 | 0.983 | 0.985 | 0.987 | 0.989 | 0.992 | 0.996 |
| 24.67999999999956 | 0.98 | 0.98 | 0.98 | 0.981 | 0.982 | 0.983 | 0.985 | 0.987 | 0.989 | 0.992 | 0.996 |
| 24.69999999999956 | 0.98 | 0.98 | 0.98 | 0.981 | 0.982 | 0.983 | 0.985 | 0.987 | 0.989 | 0.992 | 0.996 |
| 24.71999999999956 | 0.98 | 0.98 | 0.98 | 0.981 | 0.982 | 0.983 | 0.985 | 0.987 | 0.989 | 0.992 | 0.996 |
| 24.73999999999956 | 0.98 | 0.98 | 0.98 | 0.981 | 0.982 | 0.983 | 0.985 | 0.987 | 0.989 | 0.992 | 0.996 |
| 24.75999999999956 | 0.98 | 0.98 | 0.98 | 0.981 | 0.982 | 0.983 | 0.985 | 0.987 | 0.989 | 0.992 | 0.996 |
| 24.77999999999956 | 0.98 | 0.98 | 0.98 | 0.981 | 0.982 | 0.983 | 0.985 | 0.987 | 0.989 | 0.992 | 0.996 |
| 24.79999999999956 | 0.98 | 0.98 | 0.98 | 0.981 | 0.982 | 0.983 | 0.985 | 0.987 | 0.989 | 0.992 | 0.996 |
| 24.81999999999956 | 0.98 | 0.98 | 0.98 | 0.981 | 0.982 | 0.983 | 0.985 | 0.987 | 0.989 | 0.992 | 0.996 |
| 24.83999999999956 | 0.98 | 0.98 | 0.98 | 0.981 | 0.982 | 0.983 | 0.985 | 0.987 | 0.989 | 0.992 | 0.996 |
| 24.85999999999956 | 0.98 | 0.98 | 0.98 | 0.981 | 0.982 | 0.983 | 0.985 | 0.987 | 0.989 | 0.992 | 0.996 |
| 24.87999999999956 | 0.98 | 0.98 | 0.98 | 0.981 | 0.982 | 0.983 | 0.985 | 0.987 | 0.989 | 0.992 | 0.996 |
| 24.89999999999956 | 0.98 | 0.98 | 0.981 | 0.981 | 0.982 | 0.983 | 0.985 | 0.987 | 0.989 | 0.992 | 0.996 |
| 24.91999999999956 | 0.98 | 0.98 | 0.981 | 0.982 | 0.982 | 0.983 | 0.985 | 0.987 | 0.989 | 0.992 | 0.996 |
| 24.93999999999956 | 0.98 | 0.98 | 0.981 | 0.982 | 0.982 | 0.983 | 0.985 | 0.987 | 0.989 | 0.992 | 0.996 |
| 24.95999999999956 | 0.98 | 0.98 | 0.981 | 0.982 | 0.982 | 0.983 | 0.985 | 0.987 | 0.989 | 0.992 | 0.996 |
| 24.97999999999956 | 0.98 | 0.98 | 0.981 | 0.982 | 0.982 | 0.983 | 0.985 | 0.987 | 0.989 | 0.992 | 0.996 |
| 24.99999999999956 | 0.98 | 0.98 | 0.981 | 0.982 | 0.982 | 0.983 | 0.985 | 0.987 | 0.989 | 0.992 | 0.996 |
| 25.01999999999956 | 0.98 | 0.98 | 0.981 | 0.982 | 0.982 | 0.983 | 0.985 | 0.987 | 0.989 | 0.992 | 0.996 |
| 25.03999999999956 | 0.98 | 0.98 | 0.981 | 0.982 | 0.982 | 0.983 | 0.985 | 0.987 | 0.989 | 0.992 | 0.996 |
| 25.05999999999955 | 0.98 | 0.98 | 0.981 | 0.982 | 0.982 | 0.983 | 0.985 | 0.987 | 0.989 | 0.992 | 0.996 |
| 25.07999999999955 | 0.98 | 0.98 | 0.981 | 0.982 | 0.982 | 0.983 | 0.985 | 0.987 | 0.989 | 0.992 | 0.996 |
| 25.09999999999955 | 0.98 | 0.98 | 0.981 | 0.982 | 0.982 | 0.983 | 0.985 | 0.987 | 0.989 | 0.992 | 0.996 |
| 25.11999999999955 | 0.98 | 0.98 | 0.981 | 0.982 | 0.982 | 0.983 | 0.985 | 0.987 | 0.989 | 0.992 | 0.995 |
| 25.13999999999955 | 0.98 | 0.98 | 0.981 | 0.982 | 0.982 | 0.983 | 0.985 | 0.987 | 0.989 | 0.992 | 0.995 |
| 25.15999999999955 | 0.98 | 0.98 | 0.981 | 0.982 | 0.982 | 0.983 | 0.985 | 0.987 | 0.989 | 0.992 | 0.995 |
| 25.17999999999955 | 0.98 | 0.98 | 0.981 | 0.982 | 0.982 | 0.983 | 0.985 | 0.987 | 0.989 | 0.992 | 0.995 |
| 25.19999999999955 | 0.98 | 0.98 | 0.981 | 0.982 | 0.982 | 0.983 | 0.985 | 0.987 | 0.989 | 0.992 | 0.995 |
| 25.21999999999955 | 0.98 | 0.98 | 0.981 | 0.982 | 0.982 | 0.983 | 0.985 | 0.987 | 0.989 | 0.992 | 0.995 |
| 25.23999999999955 | 0.98 | 0.98 | 0.981 | 0.982 | 0.982 | 0.983 | 0.985 | 0.987 | 0.989 | 0.992 | 0.995 |
| 25.25999999999955 | 0.98 | 0.98 | 0.981 | 0.982 | 0.982 | 0.983 | 0.985 | 0.987 | 0.989 | 0.992 | 0.995 |
| 25.27999999999955 | 0.98 | 0.98 | 0.981 | 0.982 | 0.982 | 0.983 | 0.985 | 0.987 | 0.989 | 0.992 | 0.995 |
| 25.29999999999955 | 0.98 | 0.98 | 0.981 | 0.982 | 0.982 | 0.983 | 0.985 | 0.987 | 0.989 | 0.992 | 0.995 |
| 25.31999999999955 | 0.98 | 0.98 | 0.981 | 0.982 | 0.982 | 0.983 | 0.985 | 0.987 | 0.989 | 0.992 | 0.995 |
| 25.33999999999955 | 0.98 | 0.98 | 0.981 | 0.982 | 0.982 | 0.983 | 0.985 | 0.987 | 0.989 | 0.992 | 0.995 |
| 25.35999999999955 | 0.98 | 0.98 | 0.981 | 0.982 | 0.982 | 0.983 | 0.985 | 0.987 | 0.989 | 0.992 | 0.995 |
| 25.37999999999955 | 0.98 | 0.98 | 0.981 | 0.982 | 0.982 | 0.983 | 0.985 | 0.987 | 0.989 | 0.992 | 0.995 |
| 25.39999999999955 | 0.98 | 0.98 | 0.981 | 0.982 | 0.982 | 0.983 | 0.985 | 0.987 | 0.989 | 0.992 | 0.995 |
| 25.41999999999955 | 0.98 | 0.98 | 0.981 | 0.982 | 0.982 | 0.983 | 0.985 | 0.987 | 0.989 | 0.992 | 0.995 |
| 25.43999999999955 | 0.98 | 0.98 | 0.981 | 0.982 | 0.982 | 0.983 | 0.985 | 0.987 | 0.989 | 0.992 | 0.995 |
| 25.45999999999955 | 0.98 | 0.98 | 0.981 | 0.982 | 0.982 | 0.983 | 0.985 | 0.987 | 0.989 | 0.992 | 0.995 |
| 25.47999999999955 | 0.98 | 0.98 | 0.981 | 0.982 | 0.982 | 0.983 | 0.985 | 0.987 | 0.989 | 0.992 | 0.995 |
| 25.49999999999955 | 0.98 | 0.98 | 0.981 | 0.982 | 0.982 | 0.983 | 0.985 | 0.987 | 0.989 | 0.992 | 0.995 |
| 25.51999999999954 | 0.98 | 0.98 | 0.981 | 0.982 | 0.982 | 0.983 | 0.985 | 0.987 | 0.989 | 0.992 | 0.995 |
| 25.53999999999954 | 0.98 | 0.98 | 0.981 | 0.982 | 0.982 | 0.983 | 0.985 | 0.987 | 0.989 | 0.992 | 0.995 |
| 25.55999999999954 | 0.98 | 0.98 | 0.981 | 0.982 | 0.982 | 0.983 | 0.985 | 0.987 | 0.989 | 0.992 | 0.995 |
| 25.57999999999954 | 0.98 | 0.98 | 0.981 | 0.982 | 0.983 | 0.983 | 0.985 | 0.987 | 0.989 | 0.992 | 0.995 |
| 25.59999999999954 | 0.98 | 0.98 | 0.981 | 0.982 | 0.983 | 0.983 | 0.985 | 0.987 | 0.989 | 0.992 | 0.995 |
| 25.61999999999954 | 0.98 | 0.98 | 0.981 | 0.982 | 0.983 | 0.983 | 0.985 | 0.987 | 0.989 | 0.992 | 0.995 |
| 25.63999999999954 | 0.98 | 0.98 | 0.981 | 0.982 | 0.983 | 0.983 | 0.985 | 0.987 | 0.989 | 0.992 | 0.995 |
| 25.65999999999954 | 0.98 | 0.981 | 0.981 | 0.982 | 0.983 | 0.983 | 0.985 | 0.987 | 0.989 | 0.992 | 0.995 |
| 25.67999999999954 | 0.98 | 0.981 | 0.981 | 0.982 | 0.983 | 0.983 | 0.985 | 0.987 | 0.989 | 0.992 | 0.995 |
| 25.69999999999954 | 0.98 | 0.981 | 0.981 | 0.982 | 0.983 | 0.983 | 0.985 | 0.987 | 0.989 | 0.992 | 0.995 |
| 25.71999999999954 | 0.98 | 0.981 | 0.981 | 0.982 | 0.983 | 0.983 | 0.985 | 0.987 | 0.989 | 0.992 | 0.995 |
| 25.73999999999954 | 0.98 | 0.981 | 0.981 | 0.982 | 0.983 | 0.983 | 0.985 | 0.987 | 0.989 | 0.992 | 0.995 |
| 25.75999999999954 | 0.98 | 0.981 | 0.981 | 0.982 | 0.983 | 0.983 | 0.985 | 0.987 | 0.989 | 0.992 | 0.995 |
| 25.77999999999954 | 0.98 | 0.981 | 0.981 | 0.982 | 0.983 | 0.983 | 0.985 | 0.987 | 0.989 | 0.992 | 0.995 |
| 25.79999999999954 | 0.98 | 0.981 | 0.981 | 0.982 | 0.983 | 0.983 | 0.985 | 0.987 | 0.989 | 0.992 | 0.995 |
| 25.81999999999954 | 0.98 | 0.981 | 0.981 | 0.982 | 0.983 | 0.983 | 0.985 | 0.987 | 0.989 | 0.992 | 0.995 |
| 25.83999999999954 | 0.98 | 0.981 | 0.981 | 0.982 | 0.983 | 0.983 | 0.985 | 0.987 | 0.989 | 0.992 | 0.995 |
| 25.85999999999954 | 0.98 | 0.981 | 0.981 | 0.982 | 0.983 | 0.983 | 0.985 | 0.987 | 0.989 | 0.992 | 0.995 |
| 25.87999999999954 | 0.98 | 0.981 | 0.981 | 0.982 | 0.983 | 0.983 | 0.985 | 0.987 | 0.989 | 0.992 | 0.995 |
| 25.89999999999954 | 0.981 | 0.981 | 0.981 | 0.982 | 0.983 | 0.983 | 0.985 | 0.987 | 0.989 | 0.992 | 0.995 |
| 25.91999999999954 | 0.981 | 0.981 | 0.981 | 0.982 | 0.983 | 0.983 | 0.985 | 0.987 | 0.989 | 0.992 | 0.995 |
| 25.93999999999954 | 0.981 | 0.981 | 0.981 | 0.982 | 0.983 | 0.983 | 0.985 | 0.987 | 0.989 | 0.992 | 0.995 |
| 25.95999999999954 | 0.981 | 0.981 | 0.981 | 0.982 | 0.983 | 0.983 | 0.985 | 0.987 | 0.989 | 0.992 | 0.995 |
| 25.97999999999953 | 0.981 | 0.981 | 0.981 | 0.982 | 0.983 | 0.983 | 0.985 | 0.987 | 0.989 | 0.992 | 0.995 |
| 25.99999999999953 | 0.981 | 0.981 | 0.981 | 0.982 | 0.983 | 0.983 | 0.985 | 0.987 | 0.989 | 0.992 | 0.995 |
| 26.01999999999953 | 0.981 | 0.981 | 0.981 | 0.982 | 0.983 | 0.983 | 0.985 | 0.987 | 0.989 | 0.992 | 0.995 |
| 26.03999999999953 | 0.981 | 0.981 | 0.981 | 0.982 | 0.983 | 0.983 | 0.985 | 0.987 | 0.989 | 0.992 | 0.995 |
| 26.05999999999953 | 0.981 | 0.981 | 0.981 | 0.982 | 0.983 | 0.984 | 0.985 | 0.987 | 0.989 | 0.992 | 0.995 |
| 26.07999999999953 | 0.981 | 0.981 | 0.981 | 0.982 | 0.983 | 0.984 | 0.985 | 0.987 | 0.989 | 0.992 | 0.995 |
| 26.09999999999953 | 0.981 | 0.981 | 0.981 | 0.982 | 0.983 | 0.984 | 0.985 | 0.987 | 0.989 | 0.992 | 0.995 |
| 26.11999999999953 | 0.981 | 0.981 | 0.981 | 0.982 | 0.983 | 0.984 | 0.985 | 0.987 | 0.989 | 0.992 | 0.995 |
| 26.13999999999953 | 0.981 | 0.981 | 0.981 | 0.982 | 0.983 | 0.984 | 0.985 | 0.987 | 0.989 | 0.992 | 0.995 |
| 26.15999999999953 | 0.981 | 0.981 | 0.981 | 0.982 | 0.983 | 0.984 | 0.985 | 0.987 | 0.989 | 0.992 | 0.995 |
| 26.17999999999953 | 0.981 | 0.981 | 0.981 | 0.982 | 0.983 | 0.984 | 0.985 | 0.987 | 0.989 | 0.992 | 0.995 |
| 26.19999999999953 | 0.981 | 0.981 | 0.981 | 0.982 | 0.983 | 0.984 | 0.985 | 0.987 | 0.989 | 0.992 | 0.995 |
| 26.21999999999953 | 0.981 | 0.981 | 0.981 | 0.982 | 0.983 | 0.984 | 0.985 | 0.987 | 0.989 | 0.992 | 0.995 |
| 26.23999999999953 | 0.981 | 0.981 | 0.981 | 0.982 | 0.983 | 0.984 | 0.985 | 0.987 | 0.989 | 0.992 | 0.995 |
| 26.25999999999953 | 0.981 | 0.981 | 0.981 | 0.982 | 0.983 | 0.984 | 0.985 | 0.987 | 0.989 | 0.992 | 0.995 |
| 26.27999999999953 | 0.981 | 0.981 | 0.981 | 0.982 | 0.983 | 0.984 | 0.985 | 0.987 | 0.989 | 0.992 | 0.995 |
| 26.29999999999953 | 0.981 | 0.981 | 0.982 | 0.982 | 0.983 | 0.984 | 0.985 | 0.987 | 0.989 | 0.992 | 0.995 |
| 26.31999999999953 | 0.981 | 0.981 | 0.982 | 0.982 | 0.983 | 0.984 | 0.985 | 0.987 | 0.989 | 0.992 | 0.995 |
| 26.33999999999953 | 0.981 | 0.981 | 0.982 | 0.982 | 0.983 | 0.984 | 0.985 | 0.987 | 0.989 | 0.992 | 0.995 |
| 26.35999999999953 | 0.981 | 0.981 | 0.982 | 0.982 | 0.983 | 0.984 | 0.985 | 0.987 | 0.989 | 0.992 | 0.995 |
| 26.37999999999953 | 0.981 | 0.981 | 0.982 | 0.982 | 0.983 | 0.984 | 0.985 | 0.987 | 0.989 | 0.992 | 0.995 |
| 26.39999999999953 | 0.981 | 0.981 | 0.982 | 0.982 | 0.983 | 0.984 | 0.985 | 0.987 | 0.989 | 0.992 | 0.995 |
| 26.41999999999953 | 0.981 | 0.981 | 0.982 | 0.982 | 0.983 | 0.984 | 0.985 | 0.987 | 0.989 | 0.992 | 0.995 |
| 26.43999999999953 | 0.981 | 0.981 | 0.982 | 0.982 | 0.983 | 0.984 | 0.985 | 0.987 | 0.989 | 0.992 | 0.995 |
| 26.45999999999952 | 0.981 | 0.981 | 0.982 | 0.982 | 0.983 | 0.984 | 0.985 | 0.987 | 0.989 | 0.992 | 0.995 |
| 26.47999999999952 | 0.981 | 0.981 | 0.982 | 0.983 | 0.983 | 0.984 | 0.985 | 0.987 | 0.989 | 0.992 | 0.995 |
| 26.49999999999952 | 0.981 | 0.981 | 0.982 | 0.983 | 0.983 | 0.984 | 0.985 | 0.987 | 0.989 | 0.992 | 0.995 |
| 26.51999999999952 | 0.981 | 0.981 | 0.982 | 0.983 | 0.983 | 0.984 | 0.985 | 0.987 | 0.989 | 0.992 | 0.995 |
| 26.53999999999952 | 0.981 | 0.981 | 0.982 | 0.983 | 0.983 | 0.984 | 0.985 | 0.987 | 0.989 | 0.992 | 0.995 |
| 26.55999999999952 | 0.981 | 0.981 | 0.982 | 0.983 | 0.983 | 0.984 | 0.985 | 0.987 | 0.989 | 0.992 | 0.995 |
| 26.57999999999952 | 0.981 | 0.981 | 0.982 | 0.983 | 0.983 | 0.984 | 0.985 | 0.987 | 0.989 | 0.992 | 0.995 |
| 26.59999999999952 | 0.981 | 0.981 | 0.982 | 0.983 | 0.983 | 0.984 | 0.985 | 0.987 | 0.989 | 0.992 | 0.995 |
| 26.61999999999952 | 0.981 | 0.981 | 0.982 | 0.983 | 0.983 | 0.984 | 0.985 | 0.987 | 0.989 | 0.992 | 0.995 |
| 26.63999999999952 | 0.981 | 0.981 | 0.982 | 0.983 | 0.983 | 0.984 | 0.985 | 0.987 | 0.989 | 0.992 | 0.995 |
| 26.65999999999952 | 0.981 | 0.981 | 0.982 | 0.983 | 0.983 | 0.984 | 0.985 | 0.987 | 0.989 | 0.992 | 0.995 |
| 26.67999999999952 | 0.981 | 0.981 | 0.982 | 0.983 | 0.983 | 0.984 | 0.985 | 0.987 | 0.989 | 0.992 | 0.995 |
| 26.69999999999952 | 0.981 | 0.981 | 0.982 | 0.983 | 0.983 | 0.984 | 0.985 | 0.987 | 0.989 | 0.992 | 0.995 |
| 26.71999999999952 | 0.981 | 0.981 | 0.982 | 0.983 | 0.983 | 0.984 | 0.985 | 0.987 | 0.989 | 0.992 | 0.995 |
| 26.73999999999952 | 0.981 | 0.981 | 0.982 | 0.983 | 0.983 | 0.984 | 0.985 | 0.987 | 0.989 | 0.992 | 0.995 |
| 26.75999999999952 | 0.981 | 0.981 | 0.982 | 0.983 | 0.983 | 0.984 | 0.985 | 0.987 | 0.989 | 0.992 | 0.995 |
| 26.77999999999952 | 0.981 | 0.981 | 0.982 | 0.983 | 0.983 | 0.984 | 0.985 | 0.987 | 0.989 | 0.992 | 0.995 |
| 26.79999999999952 | 0.981 | 0.981 | 0.982 | 0.983 | 0.983 | 0.984 | 0.985 | 0.987 | 0.989 | 0.992 | 0.995 |
| 26.81999999999952 | 0.981 | 0.981 | 0.982 | 0.983 | 0.983 | 0.984 | 0.985 | 0.987 | 0.989 | 0.992 | 0.995 |
| 26.83999999999952 | 0.981 | 0.981 | 0.982 | 0.983 | 0.983 | 0.984 | 0.985 | 0.987 | 0.99 | 0.992 | 0.995 |
| 26.85999999999952 | 0.981 | 0.981 | 0.982 | 0.983 | 0.983 | 0.984 | 0.985 | 0.987 | 0.99 | 0.992 | 0.995 |
| 26.87999999999952 | 0.981 | 0.981 | 0.982 | 0.983 | 0.983 | 0.984 | 0.985 | 0.987 | 0.99 | 0.992 | 0.995 |
| 26.89999999999952 | 0.981 | 0.981 | 0.982 | 0.983 | 0.983 | 0.984 | 0.985 | 0.987 | 0.99 | 0.992 | 0.995 |
| 26.91999999999951 | 0.981 | 0.981 | 0.982 | 0.983 | 0.983 | 0.984 | 0.985 | 0.987 | 0.99 | 0.992 | 0.995 |
| 26.93999999999951 | 0.981 | 0.981 | 0.982 | 0.983 | 0.983 | 0.984 | 0.985 | 0.987 | 0.99 | 0.992 | 0.995 |
| 26.95999999999951 | 0.981 | 0.981 | 0.982 | 0.983 | 0.983 | 0.984 | 0.985 | 0.987 | 0.99 | 0.992 | 0.995 |
| 26.97999999999951 | 0.981 | 0.981 | 0.982 | 0.983 | 0.983 | 0.984 | 0.985 | 0.987 | 0.99 | 0.992 | 0.995 |
| 26.99999999999951 | 0.981 | 0.981 | 0.982 | 0.983 | 0.983 | 0.984 | 0.986 | 0.987 | 0.99 | 0.992 | 0.995 |
| 27.01999999999951 | 0.981 | 0.981 | 0.982 | 0.983 | 0.983 | 0.984 | 0.986 | 0.987 | 0.99 | 0.992 | 0.995 |
| 27.03999999999951 | 0.981 | 0.982 | 0.982 | 0.983 | 0.983 | 0.984 | 0.986 | 0.987 | 0.99 | 0.992 | 0.995 |
| 27.05999999999951 | 0.981 | 0.982 | 0.982 | 0.983 | 0.983 | 0.984 | 0.986 | 0.987 | 0.99 | 0.992 | 0.995 |
| 27.07999999999951 | 0.981 | 0.982 | 0.982 | 0.983 | 0.983 | 0.984 | 0.986 | 0.987 | 0.99 | 0.992 | 0.995 |
| 27.09999999999951 | 0.981 | 0.982 | 0.982 | 0.983 | 0.983 | 0.984 | 0.986 | 0.987 | 0.99 | 0.992 | 0.995 |
| 27.11999999999951 | 0.981 | 0.982 | 0.982 | 0.983 | 0.983 | 0.984 | 0.986 | 0.987 | 0.99 | 0.992 | 0.995 |
| 27.13999999999951 | 0.981 | 0.982 | 0.982 | 0.983 | 0.983 | 0.984 | 0.986 | 0.987 | 0.99 | 0.992 | 0.995 |
| 27.15999999999951 | 0.981 | 0.982 | 0.982 | 0.983 | 0.983 | 0.984 | 0.986 | 0.987 | 0.99 | 0.992 | 0.995 |
| 27.17999999999951 | 0.981 | 0.982 | 0.982 | 0.983 | 0.983 | 0.984 | 0.986 | 0.987 | 0.99 | 0.992 | 0.995 |
| 27.19999999999951 | 0.981 | 0.982 | 0.982 | 0.983 | 0.983 | 0.984 | 0.986 | 0.987 | 0.99 | 0.992 | 0.995 |
| 27.21999999999951 | 0.981 | 0.982 | 0.982 | 0.983 | 0.983 | 0.984 | 0.986 | 0.987 | 0.99 | 0.992 | 0.995 |
| 27.23999999999951 | 0.981 | 0.982 | 0.982 | 0.983 | 0.983 | 0.984 | 0.986 | 0.987 | 0.99 | 0.992 | 0.995 |
| 27.25999999999951 | 0.981 | 0.982 | 0.982 | 0.983 | 0.983 | 0.984 | 0.986 | 0.987 | 0.99 | 0.992 | 0.995 |
| 27.27999999999951 | 0.982 | 0.982 | 0.982 | 0.983 | 0.983 | 0.984 | 0.986 | 0.987 | 0.99 | 0.992 | 0.995 |
| 27.29999999999951 | 0.982 | 0.982 | 0.982 | 0.983 | 0.983 | 0.984 | 0.986 | 0.987 | 0.99 | 0.992 | 0.995 |
| 27.31999999999951 | 0.982 | 0.982 | 0.982 | 0.983 | 0.983 | 0.984 | 0.986 | 0.987 | 0.99 | 0.992 | 0.995 |
| 27.33999999999951 | 0.982 | 0.982 | 0.982 | 0.983 | 0.984 | 0.984 | 0.986 | 0.987 | 0.99 | 0.992 | 0.995 |
| 27.35999999999951 | 0.982 | 0.982 | 0.982 | 0.983 | 0.984 | 0.984 | 0.986 | 0.987 | 0.99 | 0.992 | 0.995 |
| 27.37999999999951 | 0.982 | 0.982 | 0.982 | 0.983 | 0.984 | 0.984 | 0.986 | 0.987 | 0.99 | 0.992 | 0.995 |
| 27.3999999999995 | 0.982 | 0.982 | 0.982 | 0.983 | 0.984 | 0.984 | 0.986 | 0.987 | 0.99 | 0.992 | 0.995 |
| 27.4199999999995 | 0.982 | 0.982 | 0.982 | 0.983 | 0.984 | 0.984 | 0.986 | 0.987 | 0.99 | 0.992 | 0.995 |
| 27.4399999999995 | 0.982 | 0.982 | 0.982 | 0.983 | 0.984 | 0.984 | 0.986 | 0.987 | 0.99 | 0.992 | 0.995 |
| 27.4599999999995 | 0.982 | 0.982 | 0.982 | 0.983 | 0.984 | 0.984 | 0.986 | 0.987 | 0.99 | 0.992 | 0.995 |
| 27.4799999999995 | 0.982 | 0.982 | 0.982 | 0.983 | 0.984 | 0.984 | 0.986 | 0.987 | 0.99 | 0.992 | 0.995 |
| 27.4999999999995 | 0.982 | 0.982 | 0.982 | 0.983 | 0.984 | 0.984 | 0.986 | 0.987 | 0.99 | 0.992 | 0.995 |
| 27.5199999999995 | 0.982 | 0.982 | 0.982 | 0.983 | 0.984 | 0.984 | 0.986 | 0.987 | 0.99 | 0.992 | 0.995 |
| 27.5399999999995 | 0.982 | 0.982 | 0.982 | 0.983 | 0.984 | 0.984 | 0.986 | 0.987 | 0.99 | 0.992 | 0.995 |
| 27.5599999999995 | 0.982 | 0.982 | 0.982 | 0.983 | 0.984 | 0.984 | 0.986 | 0.987 | 0.99 | 0.992 | 0.995 |
| 27.5799999999995 | 0.982 | 0.982 | 0.982 | 0.983 | 0.984 | 0.984 | 0.986 | 0.987 | 0.99 | 0.992 | 0.995 |
| 27.5999999999995 | 0.982 | 0.982 | 0.982 | 0.983 | 0.984 | 0.984 | 0.986 | 0.987 | 0.99 | 0.992 | 0.995 |
| 27.6199999999995 | 0.982 | 0.982 | 0.982 | 0.983 | 0.984 | 0.984 | 0.986 | 0.988 | 0.99 | 0.992 | 0.995 |
| 27.6399999999995 | 0.982 | 0.982 | 0.982 | 0.983 | 0.984 | 0.984 | 0.986 | 0.988 | 0.99 | 0.992 | 0.995 |
| 27.6599999999995 | 0.982 | 0.982 | 0.982 | 0.983 | 0.984 | 0.984 | 0.986 | 0.988 | 0.99 | 0.992 | 0.995 |
| 27.6799999999995 | 0.982 | 0.982 | 0.982 | 0.983 | 0.984 | 0.984 | 0.986 | 0.988 | 0.99 | 0.992 | 0.995 |
| 27.6999999999995 | 0.982 | 0.982 | 0.982 | 0.983 | 0.984 | 0.984 | 0.986 | 0.988 | 0.99 | 0.992 | 0.995 |
| 27.7199999999995 | 0.982 | 0.982 | 0.982 | 0.983 | 0.984 | 0.984 | 0.986 | 0.988 | 0.99 | 0.992 | 0.995 |
| 27.7399999999995 | 0.982 | 0.982 | 0.982 | 0.983 | 0.984 | 0.984 | 0.986 | 0.988 | 0.99 | 0.992 | 0.995 |
| 27.7599999999995 | 0.982 | 0.982 | 0.982 | 0.983 | 0.984 | 0.984 | 0.986 | 0.988 | 0.99 | 0.992 | 0.995 |
| 27.7799999999995 | 0.982 | 0.982 | 0.982 | 0.983 | 0.984 | 0.984 | 0.986 | 0.988 | 0.99 | 0.992 | 0.995 |
| 27.7999999999995 | 0.982 | 0.982 | 0.982 | 0.983 | 0.984 | 0.984 | 0.986 | 0.988 | 0.99 | 0.992 | 0.995 |
| 27.8199999999995 | 0.982 | 0.982 | 0.982 | 0.983 | 0.984 | 0.984 | 0.986 | 0.988 | 0.99 | 0.992 | 0.995 |
| 27.8399999999995 | 0.982 | 0.982 | 0.983 | 0.983 | 0.984 | 0.984 | 0.986 | 0.988 | 0.99 | 0.992 | 0.995 |
| 27.85999999999949 | 0.982 | 0.982 | 0.983 | 0.983 | 0.984 | 0.984 | 0.986 | 0.988 | 0.99 | 0.992 | 0.995 |
| 27.87999999999949 | 0.982 | 0.982 | 0.983 | 0.983 | 0.984 | 0.984 | 0.986 | 0.988 | 0.99 | 0.992 | 0.995 |
| 27.89999999999949 | 0.982 | 0.982 | 0.983 | 0.983 | 0.984 | 0.984 | 0.986 | 0.988 | 0.99 | 0.992 | 0.995 |
| 27.91999999999949 | 0.982 | 0.982 | 0.983 | 0.983 | 0.984 | 0.984 | 0.986 | 0.988 | 0.99 | 0.992 | 0.995 |
| 27.93999999999949 | 0.982 | 0.982 | 0.983 | 0.983 | 0.984 | 0.984 | 0.986 | 0.988 | 0.99 | 0.992 | 0.995 |
| 27.95999999999949 | 0.982 | 0.982 | 0.983 | 0.983 | 0.984 | 0.984 | 0.986 | 0.988 | 0.99 | 0.992 | 0.995 |
| 27.97999999999949 | 0.982 | 0.982 | 0.983 | 0.983 | 0.984 | 0.984 | 0.986 | 0.988 | 0.99 | 0.992 | 0.995 |
| 27.99999999999949 | 0.982 | 0.982 | 0.983 | 0.983 | 0.984 | 0.984 | 0.986 | 0.988 | 0.99 | 0.992 | 0.995 |
| 28.0199999999995 | 0.982 | 0.982 | 0.983 | 0.983 | 0.984 | 0.984 | 0.986 | 0.988 | 0.99 | 0.992 | 0.995 |
| 28.0399999999995 | 0.982 | 0.982 | 0.983 | 0.983 | 0.984 | 0.985 | 0.986 | 0.988 | 0.99 | 0.992 | 0.995 |
| 28.0599999999995 | 0.982 | 0.982 | 0.983 | 0.983 | 0.984 | 0.985 | 0.986 | 0.988 | 0.99 | 0.992 | 0.995 |
| 28.0799999999995 | 0.982 | 0.982 | 0.983 | 0.983 | 0.984 | 0.985 | 0.986 | 0.988 | 0.99 | 0.992 | 0.995 |
| 28.09999999999949 | 0.982 | 0.982 | 0.983 | 0.983 | 0.984 | 0.985 | 0.986 | 0.988 | 0.99 | 0.992 | 0.995 |
| 28.11999999999949 | 0.982 | 0.982 | 0.983 | 0.983 | 0.984 | 0.985 | 0.986 | 0.988 | 0.99 | 0.992 | 0.995 |
| 28.13999999999949 | 0.982 | 0.982 | 0.983 | 0.983 | 0.984 | 0.985 | 0.986 | 0.988 | 0.99 | 0.992 | 0.995 |
| 28.15999999999949 | 0.982 | 0.982 | 0.983 | 0.983 | 0.984 | 0.985 | 0.986 | 0.988 | 0.99 | 0.992 | 0.995 |
| 28.17999999999949 | 0.982 | 0.982 | 0.983 | 0.983 | 0.984 | 0.985 | 0.986 | 0.988 | 0.99 | 0.992 | 0.995 |
| 28.19999999999949 | 0.982 | 0.982 | 0.983 | 0.983 | 0.984 | 0.985 | 0.986 | 0.988 | 0.99 | 0.992 | 0.995 |
| 28.21999999999949 | 0.982 | 0.982 | 0.983 | 0.984 | 0.984 | 0.985 | 0.986 | 0.988 | 0.99 | 0.992 | 0.995 |
| 28.23999999999949 | 0.982 | 0.982 | 0.983 | 0.984 | 0.984 | 0.985 | 0.986 | 0.988 | 0.99 | 0.992 | 0.995 |
| 28.25999999999949 | 0.982 | 0.982 | 0.983 | 0.984 | 0.984 | 0.985 | 0.986 | 0.988 | 0.99 | 0.992 | 0.995 |
| 28.27999999999949 | 0.982 | 0.982 | 0.983 | 0.984 | 0.984 | 0.985 | 0.986 | 0.988 | 0.99 | 0.992 | 0.995 |
| 28.29999999999949 | 0.982 | 0.982 | 0.983 | 0.984 | 0.984 | 0.985 | 0.986 | 0.988 | 0.99 | 0.992 | 0.995 |
| 28.31999999999948 | 0.982 | 0.982 | 0.983 | 0.984 | 0.984 | 0.985 | 0.986 | 0.988 | 0.99 | 0.992 | 0.995 |
| 28.33999999999948 | 0.982 | 0.982 | 0.983 | 0.984 | 0.984 | 0.985 | 0.986 | 0.988 | 0.99 | 0.992 | 0.995 |
| 28.35999999999948 | 0.982 | 0.982 | 0.983 | 0.984 | 0.984 | 0.985 | 0.986 | 0.988 | 0.99 | 0.992 | 0.994 |
| 28.37999999999948 | 0.982 | 0.982 | 0.983 | 0.984 | 0.984 | 0.985 | 0.986 | 0.988 | 0.99 | 0.992 | 0.994 |
| 28.39999999999948 | 0.982 | 0.982 | 0.983 | 0.984 | 0.984 | 0.985 | 0.986 | 0.988 | 0.99 | 0.992 | 0.994 |
| 28.41999999999948 | 0.982 | 0.982 | 0.983 | 0.984 | 0.984 | 0.985 | 0.986 | 0.988 | 0.99 | 0.992 | 0.994 |
| 28.43999999999948 | 0.982 | 0.982 | 0.983 | 0.984 | 0.984 | 0.985 | 0.986 | 0.988 | 0.99 | 0.992 | 0.994 |
| 28.45999999999948 | 0.982 | 0.982 | 0.983 | 0.984 | 0.984 | 0.985 | 0.986 | 0.988 | 0.99 | 0.992 | 0.994 |
| 28.47999999999948 | 0.982 | 0.982 | 0.983 | 0.984 | 0.984 | 0.985 | 0.986 | 0.988 | 0.99 | 0.992 | 0.994 |
| 28.49999999999948 | 0.982 | 0.982 | 0.983 | 0.984 | 0.984 | 0.985 | 0.986 | 0.988 | 0.99 | 0.992 | 0.994 |
| 28.51999999999948 | 0.982 | 0.982 | 0.983 | 0.984 | 0.984 | 0.985 | 0.986 | 0.988 | 0.99 | 0.992 | 0.994 |
| 28.53999999999948 | 0.982 | 0.982 | 0.983 | 0.984 | 0.984 | 0.985 | 0.986 | 0.988 | 0.99 | 0.992 | 0.994 |
| 28.55999999999948 | 0.982 | 0.982 | 0.983 | 0.984 | 0.984 | 0.985 | 0.986 | 0.988 | 0.99 | 0.992 | 0.994 |
| 28.57999999999948 | 0.982 | 0.982 | 0.983 | 0.984 | 0.984 | 0.985 | 0.986 | 0.988 | 0.99 | 0.992 | 0.994 |
| 28.59999999999948 | 0.982 | 0.983 | 0.983 | 0.984 | 0.984 | 0.985 | 0.986 | 0.988 | 0.99 | 0.992 | 0.994 |
| 28.61999999999948 | 0.982 | 0.983 | 0.983 | 0.984 | 0.984 | 0.985 | 0.986 | 0.988 | 0.99 | 0.992 | 0.994 |
| 28.63999999999948 | 0.982 | 0.983 | 0.983 | 0.984 | 0.984 | 0.985 | 0.986 | 0.988 | 0.99 | 0.992 | 0.994 |
| 28.65999999999948 | 0.982 | 0.983 | 0.983 | 0.984 | 0.984 | 0.985 | 0.986 | 0.988 | 0.99 | 0.992 | 0.994 |
| 28.67999999999948 | 0.982 | 0.983 | 0.983 | 0.984 | 0.984 | 0.985 | 0.986 | 0.988 | 0.99 | 0.992 | 0.994 |
| 28.69999999999948 | 0.982 | 0.983 | 0.983 | 0.984 | 0.984 | 0.985 | 0.986 | 0.988 | 0.99 | 0.992 | 0.994 |
| 28.71999999999948 | 0.982 | 0.983 | 0.983 | 0.984 | 0.984 | 0.985 | 0.986 | 0.988 | 0.99 | 0.992 | 0.994 |
| 28.73999999999948 | 0.982 | 0.983 | 0.983 | 0.984 | 0.984 | 0.985 | 0.986 | 0.988 | 0.99 | 0.992 | 0.994 |
| 28.75999999999948 | 0.982 | 0.983 | 0.983 | 0.984 | 0.984 | 0.985 | 0.986 | 0.988 | 0.99 | 0.992 | 0.994 |
| 28.77999999999948 | 0.982 | 0.983 | 0.983 | 0.984 | 0.984 | 0.985 | 0.986 | 0.988 | 0.99 | 0.992 | 0.994 |
| 28.79999999999947 | 0.982 | 0.983 | 0.983 | 0.984 | 0.984 | 0.985 | 0.986 | 0.988 | 0.99 | 0.992 | 0.994 |
| 28.81999999999947 | 0.982 | 0.983 | 0.983 | 0.984 | 0.984 | 0.985 | 0.986 | 0.988 | 0.99 | 0.992 | 0.994 |
| 28.83999999999947 | 0.983 | 0.983 | 0.983 | 0.984 | 0.984 | 0.985 | 0.986 | 0.988 | 0.99 | 0.992 | 0.994 |
| 28.85999999999947 | 0.983 | 0.983 | 0.983 | 0.984 | 0.984 | 0.985 | 0.986 | 0.988 | 0.99 | 0.992 | 0.994 |
| 28.87999999999947 | 0.983 | 0.983 | 0.983 | 0.984 | 0.984 | 0.985 | 0.986 | 0.988 | 0.99 | 0.992 | 0.994 |
| 28.89999999999947 | 0.983 | 0.983 | 0.983 | 0.984 | 0.984 | 0.985 | 0.986 | 0.988 | 0.99 | 0.992 | 0.994 |
| 28.91999999999947 | 0.983 | 0.983 | 0.983 | 0.984 | 0.984 | 0.985 | 0.986 | 0.988 | 0.99 | 0.992 | 0.994 |
| 28.93999999999947 | 0.983 | 0.983 | 0.983 | 0.984 | 0.984 | 0.985 | 0.986 | 0.988 | 0.99 | 0.992 | 0.994 |
| 28.95999999999947 | 0.983 | 0.983 | 0.983 | 0.984 | 0.984 | 0.985 | 0.986 | 0.988 | 0.99 | 0.992 | 0.994 |
| 28.97999999999947 | 0.983 | 0.983 | 0.983 | 0.984 | 0.984 | 0.985 | 0.986 | 0.988 | 0.99 | 0.992 | 0.994 |
| 28.99999999999947 | 0.983 | 0.983 | 0.983 | 0.984 | 0.984 | 0.985 | 0.986 | 0.988 | 0.99 | 0.992 | 0.994 |
| 29.01999999999947 | 0.983 | 0.983 | 0.983 | 0.984 | 0.984 | 0.985 | 0.986 | 0.988 | 0.99 | 0.992 | 0.994 |
| 29.03999999999947 | 0.983 | 0.983 | 0.983 | 0.984 | 0.984 | 0.985 | 0.986 | 0.988 | 0.99 | 0.992 | 0.994 |
| 29.05999999999947 | 0.983 | 0.983 | 0.983 | 0.984 | 0.984 | 0.985 | 0.986 | 0.988 | 0.99 | 0.992 | 0.994 |
| 29.07999999999947 | 0.983 | 0.983 | 0.983 | 0.984 | 0.984 | 0.985 | 0.986 | 0.988 | 0.99 | 0.992 | 0.994 |
| 29.09999999999947 | 0.983 | 0.983 | 0.983 | 0.984 | 0.984 | 0.985 | 0.986 | 0.988 | 0.99 | 0.992 | 0.994 |
| 29.11999999999947 | 0.983 | 0.983 | 0.983 | 0.984 | 0.984 | 0.985 | 0.986 | 0.988 | 0.99 | 0.992 | 0.994 |
| 29.13999999999947 | 0.983 | 0.983 | 0.983 | 0.984 | 0.984 | 0.985 | 0.986 | 0.988 | 0.99 | 0.992 | 0.994 |
| 29.15999999999947 | 0.983 | 0.983 | 0.983 | 0.984 | 0.984 | 0.985 | 0.986 | 0.988 | 0.99 | 0.992 | 0.994 |
| 29.17999999999947 | 0.983 | 0.983 | 0.983 | 0.984 | 0.984 | 0.985 | 0.986 | 0.988 | 0.99 | 0.992 | 0.994 |
| 29.19999999999947 | 0.983 | 0.983 | 0.983 | 0.984 | 0.984 | 0.985 | 0.986 | 0.988 | 0.99 | 0.992 | 0.994 |
| 29.21999999999947 | 0.983 | 0.983 | 0.983 | 0.984 | 0.984 | 0.985 | 0.986 | 0.988 | 0.99 | 0.992 | 0.994 |
| 29.23999999999947 | 0.983 | 0.983 | 0.983 | 0.984 | 0.984 | 0.985 | 0.986 | 0.988 | 0.99 | 0.992 | 0.994 |
| 29.25999999999947 | 0.983 | 0.983 | 0.983 | 0.984 | 0.984 | 0.985 | 0.986 | 0.988 | 0.99 | 0.992 | 0.994 |
| 29.27999999999946 | 0.983 | 0.983 | 0.983 | 0.984 | 0.984 | 0.985 | 0.986 | 0.988 | 0.99 | 0.992 | 0.994 |
| 29.29999999999946 | 0.983 | 0.983 | 0.983 | 0.984 | 0.985 | 0.985 | 0.986 | 0.988 | 0.99 | 0.992 | 0.994 |
| 29.31999999999946 | 0.983 | 0.983 | 0.983 | 0.984 | 0.985 | 0.985 | 0.986 | 0.988 | 0.99 | 0.992 | 0.994 |
| 29.33999999999946 | 0.983 | 0.983 | 0.983 | 0.984 | 0.985 | 0.985 | 0.986 | 0.988 | 0.99 | 0.992 | 0.994 |
| 29.35999999999946 | 0.983 | 0.983 | 0.983 | 0.984 | 0.985 | 0.985 | 0.986 | 0.988 | 0.99 | 0.992 | 0.994 |
| 29.37999999999946 | 0.983 | 0.983 | 0.983 | 0.984 | 0.985 | 0.985 | 0.986 | 0.988 | 0.99 | 0.992 | 0.994 |
| 29.39999999999946 | 0.983 | 0.983 | 0.983 | 0.984 | 0.985 | 0.985 | 0.986 | 0.988 | 0.99 | 0.992 | 0.994 |
| 29.41999999999946 | 0.983 | 0.983 | 0.983 | 0.984 | 0.985 | 0.985 | 0.986 | 0.988 | 0.99 | 0.992 | 0.994 |
| 29.43999999999946 | 0.983 | 0.983 | 0.983 | 0.984 | 0.985 | 0.985 | 0.986 | 0.988 | 0.99 | 0.992 | 0.994 |
| 29.45999999999946 | 0.983 | 0.983 | 0.983 | 0.984 | 0.985 | 0.985 | 0.986 | 0.988 | 0.99 | 0.992 | 0.994 |
| 29.47999999999946 | 0.983 | 0.983 | 0.983 | 0.984 | 0.985 | 0.985 | 0.986 | 0.988 | 0.99 | 0.992 | 0.994 |
| 29.49999999999946 | 0.983 | 0.983 | 0.983 | 0.984 | 0.985 | 0.985 | 0.986 | 0.988 | 0.99 | 0.992 | 0.994 |
| 29.51999999999946 | 0.983 | 0.983 | 0.983 | 0.984 | 0.985 | 0.985 | 0.986 | 0.988 | 0.99 | 0.992 | 0.994 |
| 29.53999999999946 | 0.983 | 0.983 | 0.983 | 0.984 | 0.985 | 0.985 | 0.986 | 0.988 | 0.99 | 0.992 | 0.994 |
| 29.55999999999946 | 0.983 | 0.983 | 0.984 | 0.984 | 0.985 | 0.985 | 0.986 | 0.988 | 0.99 | 0.992 | 0.994 |
| 29.57999999999946 | 0.983 | 0.983 | 0.984 | 0.984 | 0.985 | 0.985 | 0.986 | 0.988 | 0.99 | 0.992 | 0.994 |
| 29.59999999999946 | 0.983 | 0.983 | 0.984 | 0.984 | 0.985 | 0.985 | 0.986 | 0.988 | 0.99 | 0.992 | 0.994 |
| 29.61999999999946 | 0.983 | 0.983 | 0.984 | 0.984 | 0.985 | 0.985 | 0.986 | 0.988 | 0.99 | 0.992 | 0.994 |
| 29.63999999999946 | 0.983 | 0.983 | 0.984 | 0.984 | 0.985 | 0.985 | 0.986 | 0.988 | 0.99 | 0.992 | 0.994 |
| 29.65999999999946 | 0.983 | 0.983 | 0.984 | 0.984 | 0.985 | 0.985 | 0.986 | 0.988 | 0.99 | 0.992 | 0.994 |
| 29.67999999999946 | 0.983 | 0.983 | 0.984 | 0.984 | 0.985 | 0.985 | 0.986 | 0.988 | 0.99 | 0.992 | 0.994 |
| 29.69999999999946 | 0.983 | 0.983 | 0.984 | 0.984 | 0.985 | 0.985 | 0.986 | 0.988 | 0.99 | 0.992 | 0.994 |
| 29.71999999999946 | 0.983 | 0.983 | 0.984 | 0.984 | 0.985 | 0.985 | 0.987 | 0.988 | 0.99 | 0.992 | 0.994 |
| 29.73999999999945 | 0.983 | 0.983 | 0.984 | 0.984 | 0.985 | 0.985 | 0.987 | 0.988 | 0.99 | 0.992 | 0.994 |
| 29.75999999999945 | 0.983 | 0.983 | 0.984 | 0.984 | 0.985 | 0.985 | 0.987 | 0.988 | 0.99 | 0.992 | 0.994 |
| 29.77999999999945 | 0.983 | 0.983 | 0.984 | 0.984 | 0.985 | 0.985 | 0.987 | 0.988 | 0.99 | 0.992 | 0.994 |
| 29.79999999999945 | 0.983 | 0.983 | 0.984 | 0.984 | 0.985 | 0.985 | 0.987 | 0.988 | 0.99 | 0.992 | 0.994 |
| 29.81999999999945 | 0.983 | 0.983 | 0.984 | 0.984 | 0.985 | 0.985 | 0.987 | 0.988 | 0.99 | 0.992 | 0.994 |
| 29.83999999999945 | 0.983 | 0.983 | 0.984 | 0.984 | 0.985 | 0.985 | 0.987 | 0.988 | 0.99 | 0.992 | 0.994 |
| 29.85999999999945 | 0.983 | 0.983 | 0.984 | 0.984 | 0.985 | 0.985 | 0.987 | 0.988 | 0.99 | 0.992 | 0.994 |
| 29.87999999999945 | 0.983 | 0.983 | 0.984 | 0.984 | 0.985 | 0.985 | 0.987 | 0.988 | 0.99 | 0.992 | 0.994 |
| 29.89999999999945 | 0.983 | 0.983 | 0.984 | 0.984 | 0.985 | 0.985 | 0.987 | 0.988 | 0.99 | 0.992 | 0.994 |
| 29.91999999999945 | 0.983 | 0.983 | 0.984 | 0.984 | 0.985 | 0.985 | 0.987 | 0.988 | 0.99 | 0.992 | 0.994 |
| 29.93999999999945 | 0.983 | 0.983 | 0.984 | 0.984 | 0.985 | 0.985 | 0.987 | 0.988 | 0.99 | 0.992 | 0.994 |
| 29.95999999999945 | 0.983 | 0.983 | 0.984 | 0.984 | 0.985 | 0.985 | 0.987 | 0.988 | 0.99 | 0.992 | 0.994 |
| 29.97999999999945 | 0.983 | 0.983 | 0.984 | 0.984 | 0.985 | 0.985 | 0.987 | 0.988 | 0.99 | 0.992 | 0.994 |
| 29.99999999999945 | 0.983 | 0.983 | 0.984 | 0.984 | 0.985 | 0.985 | 0.987 | 0.988 | 0.99 | 0.992 | 0.994 |
| 30.01999999999945 | 0.983 | 0.983 | 0.984 | 0.984 | 0.985 | 0.985 | 0.987 | 0.988 | 0.99 | 0.992 | 0.994 |
| 30.03999999999945 | 0.983 | 0.983 | 0.984 | 0.984 | 0.985 | 0.985 | 0.987 | 0.988 | 0.99 | 0.992 | 0.994 |
| 30.05999999999945 | 0.983 | 0.983 | 0.984 | 0.984 | 0.985 | 0.985 | 0.987 | 0.988 | 0.99 | 0.992 | 0.994 |
| 30.07999999999945 | 0.983 | 0.983 | 0.984 | 0.984 | 0.985 | 0.985 | 0.987 | 0.988 | 0.99 | 0.992 | 0.994 |
| 30.09999999999945 | 0.983 | 0.983 | 0.984 | 0.984 | 0.985 | 0.985 | 0.987 | 0.988 | 0.99 | 0.992 | 0.994 |
| 30.11999999999945 | 0.983 | 0.983 | 0.984 | 0.984 | 0.985 | 0.985 | 0.987 | 0.988 | 0.99 | 0.992 | 0.994 |
| 30.13999999999945 | 0.983 | 0.983 | 0.984 | 0.984 | 0.985 | 0.985 | 0.987 | 0.988 | 0.99 | 0.992 | 0.994 |
| 30.15999999999945 | 0.983 | 0.983 | 0.984 | 0.984 | 0.985 | 0.985 | 0.987 | 0.988 | 0.99 | 0.992 | 0.994 |
| 30.17999999999945 | 0.983 | 0.983 | 0.984 | 0.985 | 0.985 | 0.985 | 0.987 | 0.988 | 0.99 | 0.992 | 0.994 |
| 30.19999999999945 | 0.983 | 0.983 | 0.984 | 0.985 | 0.985 | 0.985 | 0.987 | 0.988 | 0.99 | 0.992 | 0.994 |
| 30.21999999999944 | 0.983 | 0.983 | 0.984 | 0.985 | 0.985 | 0.985 | 0.987 | 0.988 | 0.99 | 0.992 | 0.994 |
| 30.23999999999944 | 0.983 | 0.983 | 0.984 | 0.985 | 0.985 | 0.985 | 0.987 | 0.988 | 0.99 | 0.992 | 0.994 |
| 30.25999999999944 | 0.983 | 0.983 | 0.984 | 0.985 | 0.985 | 0.985 | 0.987 | 0.988 | 0.99 | 0.992 | 0.994 |
| 30.27999999999944 | 0.983 | 0.983 | 0.984 | 0.985 | 0.985 | 0.985 | 0.987 | 0.988 | 0.99 | 0.992 | 0.994 |
| 30.29999999999944 | 0.983 | 0.983 | 0.984 | 0.985 | 0.985 | 0.985 | 0.987 | 0.988 | 0.99 | 0.992 | 0.994 |
| 30.31999999999944 | 0.983 | 0.984 | 0.984 | 0.985 | 0.985 | 0.986 | 0.987 | 0.988 | 0.99 | 0.992 | 0.994 |
| 30.33999999999944 | 0.983 | 0.984 | 0.984 | 0.985 | 0.985 | 0.986 | 0.987 | 0.988 | 0.99 | 0.992 | 0.994 |
| 30.35999999999944 | 0.983 | 0.984 | 0.984 | 0.985 | 0.985 | 0.986 | 0.987 | 0.988 | 0.99 | 0.992 | 0.994 |
| 30.37999999999944 | 0.983 | 0.984 | 0.984 | 0.985 | 0.985 | 0.986 | 0.987 | 0.988 | 0.99 | 0.992 | 0.994 |
| 30.39999999999944 | 0.983 | 0.984 | 0.984 | 0.985 | 0.985 | 0.986 | 0.987 | 0.988 | 0.99 | 0.992 | 0.994 |
| 30.41999999999944 | 0.983 | 0.984 | 0.984 | 0.985 | 0.985 | 0.986 | 0.987 | 0.988 | 0.99 | 0.992 | 0.994 |
| 30.43999999999944 | 0.983 | 0.984 | 0.984 | 0.985 | 0.985 | 0.986 | 0.987 | 0.988 | 0.99 | 0.992 | 0.994 |
| 30.45999999999944 | 0.983 | 0.984 | 0.984 | 0.985 | 0.985 | 0.986 | 0.987 | 0.988 | 0.99 | 0.992 | 0.994 |
| 30.47999999999944 | 0.983 | 0.984 | 0.984 | 0.985 | 0.985 | 0.986 | 0.987 | 0.988 | 0.99 | 0.992 | 0.994 |
| 30.49999999999944 | 0.983 | 0.984 | 0.984 | 0.985 | 0.985 | 0.986 | 0.987 | 0.988 | 0.99 | 0.992 | 0.994 |
| 30.51999999999944 | 0.983 | 0.984 | 0.984 | 0.985 | 0.985 | 0.986 | 0.987 | 0.988 | 0.99 | 0.992 | 0.994 |
| 30.53999999999944 | 0.983 | 0.984 | 0.984 | 0.985 | 0.985 | 0.986 | 0.987 | 0.988 | 0.99 | 0.992 | 0.994 |
| 30.55999999999944 | 0.984 | 0.984 | 0.984 | 0.985 | 0.985 | 0.986 | 0.987 | 0.988 | 0.99 | 0.992 | 0.994 |
| 30.57999999999944 | 0.984 | 0.984 | 0.984 | 0.985 | 0.985 | 0.986 | 0.987 | 0.988 | 0.99 | 0.992 | 0.994 |
| 30.59999999999944 | 0.984 | 0.984 | 0.984 | 0.985 | 0.985 | 0.986 | 0.987 | 0.988 | 0.99 | 0.992 | 0.994 |
| 30.61999999999944 | 0.984 | 0.984 | 0.984 | 0.985 | 0.985 | 0.986 | 0.987 | 0.988 | 0.99 | 0.992 | 0.994 |
| 30.63999999999944 | 0.984 | 0.984 | 0.984 | 0.985 | 0.985 | 0.986 | 0.987 | 0.988 | 0.99 | 0.992 | 0.994 |
| 30.65999999999944 | 0.984 | 0.984 | 0.984 | 0.985 | 0.985 | 0.986 | 0.987 | 0.988 | 0.99 | 0.992 | 0.994 |
| 30.67999999999943 | 0.984 | 0.984 | 0.984 | 0.985 | 0.985 | 0.986 | 0.987 | 0.988 | 0.99 | 0.992 | 0.994 |
| 30.69999999999943 | 0.984 | 0.984 | 0.984 | 0.985 | 0.985 | 0.986 | 0.987 | 0.988 | 0.99 | 0.992 | 0.994 |
| 30.71999999999943 | 0.984 | 0.984 | 0.984 | 0.985 | 0.985 | 0.986 | 0.987 | 0.988 | 0.99 | 0.992 | 0.994 |
| 30.73999999999943 | 0.984 | 0.984 | 0.984 | 0.985 | 0.985 | 0.986 | 0.987 | 0.988 | 0.99 | 0.992 | 0.994 |
| 30.75999999999943 | 0.984 | 0.984 | 0.984 | 0.985 | 0.985 | 0.986 | 0.987 | 0.988 | 0.99 | 0.992 | 0.994 |
| 30.77999999999943 | 0.984 | 0.984 | 0.984 | 0.985 | 0.985 | 0.986 | 0.987 | 0.988 | 0.99 | 0.992 | 0.994 |
| 30.79999999999943 | 0.984 | 0.984 | 0.984 | 0.985 | 0.985 | 0.986 | 0.987 | 0.988 | 0.99 | 0.992 | 0.994 |
| 30.81999999999943 | 0.984 | 0.984 | 0.984 | 0.985 | 0.985 | 0.986 | 0.987 | 0.988 | 0.99 | 0.992 | 0.994 |
| 30.83999999999943 | 0.984 | 0.984 | 0.984 | 0.985 | 0.985 | 0.986 | 0.987 | 0.988 | 0.99 | 0.992 | 0.994 |
| 30.85999999999943 | 0.984 | 0.984 | 0.984 | 0.985 | 0.985 | 0.986 | 0.987 | 0.988 | 0.99 | 0.992 | 0.994 |
| 30.87999999999943 | 0.984 | 0.984 | 0.984 | 0.985 | 0.985 | 0.986 | 0.987 | 0.988 | 0.99 | 0.992 | 0.994 |
| 30.89999999999943 | 0.984 | 0.984 | 0.984 | 0.985 | 0.985 | 0.986 | 0.987 | 0.988 | 0.99 | 0.992 | 0.994 |
| 30.91999999999943 | 0.984 | 0.984 | 0.984 | 0.985 | 0.985 | 0.986 | 0.987 | 0.988 | 0.99 | 0.992 | 0.994 |
| 30.93999999999943 | 0.984 | 0.984 | 0.984 | 0.985 | 0.985 | 0.986 | 0.987 | 0.988 | 0.99 | 0.992 | 0.994 |
| 30.95999999999943 | 0.984 | 0.984 | 0.984 | 0.985 | 0.985 | 0.986 | 0.987 | 0.988 | 0.99 | 0.992 | 0.994 |
| 30.97999999999943 | 0.984 | 0.984 | 0.984 | 0.985 | 0.985 | 0.986 | 0.987 | 0.988 | 0.99 | 0.992 | 0.994 |
| 30.99999999999943 | 0.984 | 0.984 | 0.984 | 0.985 | 0.985 | 0.986 | 0.987 | 0.988 | 0.99 | 0.992 | 0.994 |
| 31.01999999999943 | 0.984 | 0.984 | 0.984 | 0.985 | 0.985 | 0.986 | 0.987 | 0.988 | 0.99 | 0.992 | 0.994 |
| 31.03999999999943 | 0.984 | 0.984 | 0.984 | 0.985 | 0.985 | 0.986 | 0.987 | 0.988 | 0.99 | 0.992 | 0.994 |
| 31.05999999999943 | 0.984 | 0.984 | 0.984 | 0.985 | 0.985 | 0.986 | 0.987 | 0.988 | 0.99 | 0.992 | 0.994 |
| 31.07999999999943 | 0.984 | 0.984 | 0.984 | 0.985 | 0.985 | 0.986 | 0.987 | 0.988 | 0.99 | 0.992 | 0.994 |
| 31.09999999999943 | 0.984 | 0.984 | 0.984 | 0.985 | 0.985 | 0.986 | 0.987 | 0.988 | 0.99 | 0.992 | 0.994 |
| 31.11999999999942 | 0.984 | 0.984 | 0.984 | 0.985 | 0.985 | 0.986 | 0.987 | 0.988 | 0.99 | 0.992 | 0.994 |
| 31.13999999999942 | 0.984 | 0.984 | 0.984 | 0.985 | 0.985 | 0.986 | 0.987 | 0.988 | 0.99 | 0.992 | 0.994 |
| 31.15999999999942 | 0.984 | 0.984 | 0.984 | 0.985 | 0.985 | 0.986 | 0.987 | 0.988 | 0.99 | 0.992 | 0.994 |
| 31.17999999999942 | 0.984 | 0.984 | 0.984 | 0.985 | 0.985 | 0.986 | 0.987 | 0.988 | 0.99 | 0.992 | 0.994 |
| 31.19999999999942 | 0.984 | 0.984 | 0.984 | 0.985 | 0.985 | 0.986 | 0.987 | 0.988 | 0.99 | 0.992 | 0.994 |
| 31.21999999999942 | 0.984 | 0.984 | 0.984 | 0.985 | 0.985 | 0.986 | 0.987 | 0.988 | 0.99 | 0.992 | 0.994 |
| 31.23999999999942 | 0.984 | 0.984 | 0.984 | 0.985 | 0.985 | 0.986 | 0.987 | 0.988 | 0.99 | 0.992 | 0.994 |
| 31.25999999999942 | 0.984 | 0.984 | 0.984 | 0.985 | 0.985 | 0.986 | 0.987 | 0.988 | 0.99 | 0.992 | 0.994 |
| 31.27999999999942 | 0.984 | 0.984 | 0.984 | 0.985 | 0.985 | 0.986 | 0.987 | 0.988 | 0.99 | 0.992 | 0.994 |
| 31.29999999999942 | 0.984 | 0.984 | 0.984 | 0.985 | 0.985 | 0.986 | 0.987 | 0.988 | 0.99 | 0.992 | 0.994 |
| 31.31999999999942 | 0.984 | 0.984 | 0.984 | 0.985 | 0.985 | 0.986 | 0.987 | 0.988 | 0.99 | 0.992 | 0.994 |
| 31.33999999999942 | 0.984 | 0.984 | 0.984 | 0.985 | 0.985 | 0.986 | 0.987 | 0.988 | 0.99 | 0.992 | 0.994 |
| 31.35999999999942 | 0.984 | 0.984 | 0.984 | 0.985 | 0.985 | 0.986 | 0.987 | 0.988 | 0.99 | 0.992 | 0.994 |
| 31.37999999999942 | 0.984 | 0.984 | 0.984 | 0.985 | 0.985 | 0.986 | 0.987 | 0.988 | 0.99 | 0.992 | 0.994 |
| 31.39999999999942 | 0.984 | 0.984 | 0.984 | 0.985 | 0.985 | 0.986 | 0.987 | 0.988 | 0.99 | 0.992 | 0.994 |
| 31.41999999999942 | 0.984 | 0.984 | 0.984 | 0.985 | 0.985 | 0.986 | 0.987 | 0.988 | 0.99 | 0.992 | 0.994 |
| 31.43999999999942 | 0.984 | 0.984 | 0.984 | 0.985 | 0.985 | 0.986 | 0.987 | 0.988 | 0.99 | 0.992 | 0.994 |
| 31.45999999999942 | 0.984 | 0.984 | 0.984 | 0.985 | 0.985 | 0.986 | 0.987 | 0.988 | 0.99 | 0.992 | 0.994 |
| 31.47999999999942 | 0.984 | 0.984 | 0.984 | 0.985 | 0.985 | 0.986 | 0.987 | 0.988 | 0.99 | 0.992 | 0.994 |
| 31.49999999999942 | 0.984 | 0.984 | 0.984 | 0.985 | 0.985 | 0.986 | 0.987 | 0.988 | 0.99 | 0.992 | 0.994 |
| 31.51999999999942 | 0.984 | 0.984 | 0.985 | 0.985 | 0.985 | 0.986 | 0.987 | 0.988 | 0.99 | 0.992 | 0.994 |
| 31.53999999999942 | 0.984 | 0.984 | 0.985 | 0.985 | 0.986 | 0.986 | 0.987 | 0.988 | 0.99 | 0.992 | 0.994 |
| 31.55999999999942 | 0.984 | 0.984 | 0.985 | 0.985 | 0.986 | 0.986 | 0.987 | 0.988 | 0.99 | 0.992 | 0.994 |
| 31.57999999999942 | 0.984 | 0.984 | 0.985 | 0.985 | 0.986 | 0.986 | 0.987 | 0.988 | 0.99 | 0.992 | 0.994 |
| 31.59999999999942 | 0.984 | 0.984 | 0.985 | 0.985 | 0.986 | 0.986 | 0.987 | 0.988 | 0.99 | 0.992 | 0.994 |
| 31.61999999999941 | 0.984 | 0.984 | 0.985 | 0.985 | 0.986 | 0.986 | 0.987 | 0.988 | 0.99 | 0.992 | 0.994 |
| 31.63999999999941 | 0.984 | 0.984 | 0.985 | 0.985 | 0.986 | 0.986 | 0.987 | 0.988 | 0.99 | 0.992 | 0.994 |
| 31.65999999999941 | 0.984 | 0.984 | 0.985 | 0.985 | 0.986 | 0.986 | 0.987 | 0.988 | 0.99 | 0.992 | 0.994 |
| 31.67999999999941 | 0.984 | 0.984 | 0.985 | 0.985 | 0.986 | 0.986 | 0.987 | 0.988 | 0.99 | 0.992 | 0.994 |
| 31.69999999999941 | 0.984 | 0.984 | 0.985 | 0.985 | 0.986 | 0.986 | 0.987 | 0.988 | 0.99 | 0.992 | 0.994 |
| 31.71999999999941 | 0.984 | 0.984 | 0.985 | 0.985 | 0.986 | 0.986 | 0.987 | 0.989 | 0.99 | 0.992 | 0.994 |
| 31.73999999999941 | 0.984 | 0.984 | 0.985 | 0.985 | 0.986 | 0.986 | 0.987 | 0.989 | 0.99 | 0.992 | 0.994 |
| 31.75999999999941 | 0.984 | 0.984 | 0.985 | 0.985 | 0.986 | 0.986 | 0.987 | 0.989 | 0.99 | 0.992 | 0.994 |
| 31.77999999999941 | 0.984 | 0.984 | 0.985 | 0.985 | 0.986 | 0.986 | 0.987 | 0.989 | 0.99 | 0.992 | 0.994 |
| 31.79999999999941 | 0.984 | 0.984 | 0.985 | 0.985 | 0.986 | 0.986 | 0.987 | 0.989 | 0.99 | 0.992 | 0.994 |
| 31.81999999999941 | 0.984 | 0.984 | 0.985 | 0.985 | 0.986 | 0.986 | 0.987 | 0.989 | 0.99 | 0.992 | 0.994 |
| 31.83999999999941 | 0.984 | 0.984 | 0.985 | 0.985 | 0.986 | 0.986 | 0.987 | 0.989 | 0.99 | 0.992 | 0.994 |
| 31.85999999999941 | 0.984 | 0.984 | 0.985 | 0.985 | 0.986 | 0.986 | 0.987 | 0.989 | 0.99 | 0.992 | 0.994 |
| 31.87999999999941 | 0.984 | 0.984 | 0.985 | 0.985 | 0.986 | 0.986 | 0.987 | 0.989 | 0.99 | 0.992 | 0.994 |
| 31.89999999999941 | 0.984 | 0.984 | 0.985 | 0.985 | 0.986 | 0.986 | 0.987 | 0.989 | 0.99 | 0.992 | 0.994 |
| 31.91999999999941 | 0.984 | 0.984 | 0.985 | 0.985 | 0.986 | 0.986 | 0.987 | 0.989 | 0.99 | 0.992 | 0.994 |
| 31.93999999999941 | 0.984 | 0.984 | 0.985 | 0.985 | 0.986 | 0.986 | 0.987 | 0.989 | 0.99 | 0.992 | 0.994 |
| 31.95999999999941 | 0.984 | 0.984 | 0.985 | 0.985 | 0.986 | 0.986 | 0.987 | 0.989 | 0.99 | 0.992 | 0.994 |
| 31.97999999999941 | 0.984 | 0.984 | 0.985 | 0.985 | 0.986 | 0.986 | 0.987 | 0.989 | 0.99 | 0.992 | 0.994 |
| 31.99999999999941 | 0.984 | 0.984 | 0.985 | 0.985 | 0.986 | 0.986 | 0.987 | 0.989 | 0.99 | 0.992 | 0.994 |
| 32.01999999999941 | 0.984 | 0.984 | 0.985 | 0.985 | 0.986 | 0.986 | 0.987 | 0.989 | 0.99 | 0.992 | 0.994 |
| 32.03999999999941 | 0.984 | 0.984 | 0.985 | 0.985 | 0.986 | 0.986 | 0.987 | 0.989 | 0.99 | 0.992 | 0.994 |
| 32.05999999999941 | 0.984 | 0.984 | 0.985 | 0.985 | 0.986 | 0.986 | 0.987 | 0.989 | 0.99 | 0.992 | 0.994 |
| 32.07999999999942 | 0.984 | 0.984 | 0.985 | 0.985 | 0.986 | 0.986 | 0.987 | 0.989 | 0.99 | 0.992 | 0.994 |
| 32.09999999999942 | 0.984 | 0.984 | 0.985 | 0.985 | 0.986 | 0.986 | 0.987 | 0.989 | 0.99 | 0.992 | 0.994 |
| 32.11999999999942 | 0.984 | 0.984 | 0.985 | 0.985 | 0.986 | 0.986 | 0.987 | 0.989 | 0.99 | 0.992 | 0.994 |
| 32.13999999999942 | 0.984 | 0.984 | 0.985 | 0.985 | 0.986 | 0.986 | 0.987 | 0.989 | 0.99 | 0.992 | 0.994 |
| 32.15999999999943 | 0.984 | 0.984 | 0.985 | 0.985 | 0.986 | 0.986 | 0.987 | 0.989 | 0.99 | 0.992 | 0.994 |
| 32.17999999999943 | 0.984 | 0.984 | 0.985 | 0.985 | 0.986 | 0.986 | 0.987 | 0.989 | 0.99 | 0.992 | 0.994 |
| 32.19999999999943 | 0.984 | 0.984 | 0.985 | 0.985 | 0.986 | 0.986 | 0.987 | 0.989 | 0.99 | 0.992 | 0.994 |
| 32.21999999999944 | 0.984 | 0.984 | 0.985 | 0.985 | 0.986 | 0.986 | 0.987 | 0.989 | 0.99 | 0.992 | 0.994 |
| 32.23999999999944 | 0.984 | 0.984 | 0.985 | 0.985 | 0.986 | 0.986 | 0.987 | 0.989 | 0.99 | 0.992 | 0.994 |
| 32.25999999999944 | 0.984 | 0.984 | 0.985 | 0.985 | 0.986 | 0.986 | 0.987 | 0.989 | 0.99 | 0.992 | 0.994 |
| 32.27999999999944 | 0.984 | 0.985 | 0.985 | 0.985 | 0.986 | 0.986 | 0.987 | 0.989 | 0.99 | 0.992 | 0.994 |
| 32.29999999999945 | 0.984 | 0.985 | 0.985 | 0.985 | 0.986 | 0.986 | 0.987 | 0.989 | 0.99 | 0.992 | 0.994 |
| 32.31999999999945 | 0.984 | 0.985 | 0.985 | 0.985 | 0.986 | 0.986 | 0.987 | 0.989 | 0.99 | 0.992 | 0.994 |
| 32.33999999999946 | 0.984 | 0.985 | 0.985 | 0.985 | 0.986 | 0.986 | 0.987 | 0.989 | 0.99 | 0.992 | 0.994 |
| 32.35999999999946 | 0.984 | 0.985 | 0.985 | 0.985 | 0.986 | 0.986 | 0.987 | 0.989 | 0.99 | 0.992 | 0.994 |
| 32.37999999999946 | 0.984 | 0.985 | 0.985 | 0.985 | 0.986 | 0.986 | 0.987 | 0.989 | 0.99 | 0.992 | 0.994 |
| 32.39999999999947 | 0.984 | 0.985 | 0.985 | 0.986 | 0.986 | 0.986 | 0.987 | 0.989 | 0.99 | 0.992 | 0.994 |
| 32.41999999999947 | 0.984 | 0.985 | 0.985 | 0.986 | 0.986 | 0.986 | 0.987 | 0.989 | 0.99 | 0.992 | 0.994 |
| 32.43999999999947 | 0.984 | 0.985 | 0.985 | 0.986 | 0.986 | 0.986 | 0.987 | 0.989 | 0.99 | 0.992 | 0.994 |
| 32.45999999999948 | 0.984 | 0.985 | 0.985 | 0.986 | 0.986 | 0.986 | 0.987 | 0.989 | 0.99 | 0.992 | 0.994 |
| 32.47999999999948 | 0.984 | 0.985 | 0.985 | 0.986 | 0.986 | 0.986 | 0.987 | 0.989 | 0.99 | 0.992 | 0.994 |
| 32.49999999999948 | 0.984 | 0.985 | 0.985 | 0.986 | 0.986 | 0.986 | 0.987 | 0.989 | 0.99 | 0.992 | 0.994 |
| 32.51999999999948 | 0.985 | 0.985 | 0.985 | 0.986 | 0.986 | 0.986 | 0.987 | 0.989 | 0.99 | 0.992 | 0.994 |
| 32.53999999999949 | 0.985 | 0.985 | 0.985 | 0.986 | 0.986 | 0.986 | 0.987 | 0.989 | 0.99 | 0.992 | 0.994 |
| 32.5599999999995 | 0.985 | 0.985 | 0.985 | 0.986 | 0.986 | 0.986 | 0.987 | 0.989 | 0.99 | 0.992 | 0.994 |
| 32.5799999999995 | 0.985 | 0.985 | 0.985 | 0.986 | 0.986 | 0.986 | 0.987 | 0.989 | 0.99 | 0.992 | 0.994 |
| 32.5999999999995 | 0.985 | 0.985 | 0.985 | 0.986 | 0.986 | 0.986 | 0.987 | 0.989 | 0.99 | 0.992 | 0.994 |
| 32.6199999999995 | 0.985 | 0.985 | 0.985 | 0.986 | 0.986 | 0.986 | 0.987 | 0.989 | 0.99 | 0.992 | 0.994 |
| 32.6399999999995 | 0.985 | 0.985 | 0.985 | 0.986 | 0.986 | 0.986 | 0.987 | 0.989 | 0.99 | 0.992 | 0.994 |
| 32.65999999999951 | 0.985 | 0.985 | 0.985 | 0.986 | 0.986 | 0.986 | 0.987 | 0.989 | 0.99 | 0.992 | 0.994 |
| 32.67999999999951 | 0.985 | 0.985 | 0.985 | 0.986 | 0.986 | 0.986 | 0.987 | 0.989 | 0.99 | 0.992 | 0.994 |
| 32.69999999999951 | 0.985 | 0.985 | 0.985 | 0.986 | 0.986 | 0.986 | 0.987 | 0.989 | 0.99 | 0.992 | 0.994 |
| 32.71999999999952 | 0.985 | 0.985 | 0.985 | 0.986 | 0.986 | 0.986 | 0.987 | 0.989 | 0.99 | 0.992 | 0.994 |
| 32.73999999999952 | 0.985 | 0.985 | 0.985 | 0.986 | 0.986 | 0.986 | 0.987 | 0.989 | 0.99 | 0.992 | 0.994 |
| 32.75999999999952 | 0.985 | 0.985 | 0.985 | 0.986 | 0.986 | 0.986 | 0.987 | 0.989 | 0.99 | 0.992 | 0.994 |
| 32.77999999999952 | 0.985 | 0.985 | 0.985 | 0.986 | 0.986 | 0.986 | 0.987 | 0.989 | 0.99 | 0.992 | 0.994 |
| 32.79999999999952 | 0.985 | 0.985 | 0.985 | 0.986 | 0.986 | 0.986 | 0.987 | 0.989 | 0.99 | 0.992 | 0.994 |
| 32.81999999999953 | 0.985 | 0.985 | 0.985 | 0.986 | 0.986 | 0.986 | 0.988 | 0.989 | 0.99 | 0.992 | 0.994 |
| 32.83999999999953 | 0.985 | 0.985 | 0.985 | 0.986 | 0.986 | 0.986 | 0.988 | 0.989 | 0.99 | 0.992 | 0.994 |
| 32.85999999999954 | 0.985 | 0.985 | 0.985 | 0.986 | 0.986 | 0.986 | 0.988 | 0.989 | 0.99 | 0.992 | 0.994 |
| 32.87999999999954 | 0.985 | 0.985 | 0.985 | 0.986 | 0.986 | 0.986 | 0.988 | 0.989 | 0.99 | 0.992 | 0.994 |
| 32.89999999999954 | 0.985 | 0.985 | 0.985 | 0.986 | 0.986 | 0.987 | 0.988 | 0.989 | 0.99 | 0.992 | 0.994 |
| 32.91999999999955 | 0.985 | 0.985 | 0.985 | 0.986 | 0.986 | 0.987 | 0.988 | 0.989 | 0.99 | 0.992 | 0.994 |
| 32.93999999999955 | 0.985 | 0.985 | 0.985 | 0.986 | 0.986 | 0.987 | 0.988 | 0.989 | 0.99 | 0.992 | 0.994 |
| 32.95999999999955 | 0.985 | 0.985 | 0.985 | 0.986 | 0.986 | 0.987 | 0.988 | 0.989 | 0.99 | 0.992 | 0.994 |
| 32.97999999999956 | 0.985 | 0.985 | 0.985 | 0.986 | 0.986 | 0.987 | 0.988 | 0.989 | 0.99 | 0.992 | 0.994 |
| 32.99999999999956 | 0.985 | 0.985 | 0.985 | 0.986 | 0.986 | 0.987 | 0.988 | 0.989 | 0.99 | 0.992 | 0.994 |
| 33.01999999999956 | 0.985 | 0.985 | 0.985 | 0.986 | 0.986 | 0.987 | 0.988 | 0.989 | 0.99 | 0.992 | 0.994 |
| 33.03999999999957 | 0.985 | 0.985 | 0.985 | 0.986 | 0.986 | 0.987 | 0.988 | 0.989 | 0.99 | 0.992 | 0.994 |
| 33.05999999999957 | 0.985 | 0.985 | 0.985 | 0.986 | 0.986 | 0.987 | 0.988 | 0.989 | 0.99 | 0.992 | 0.994 |
| 33.07999999999957 | 0.985 | 0.985 | 0.985 | 0.986 | 0.986 | 0.987 | 0.988 | 0.989 | 0.99 | 0.992 | 0.994 |
| 33.09999999999957 | 0.985 | 0.985 | 0.985 | 0.986 | 0.986 | 0.987 | 0.988 | 0.989 | 0.99 | 0.992 | 0.994 |
| 33.11999999999958 | 0.985 | 0.985 | 0.985 | 0.986 | 0.986 | 0.987 | 0.988 | 0.989 | 0.99 | 0.992 | 0.994 |
| 33.13999999999958 | 0.985 | 0.985 | 0.985 | 0.986 | 0.986 | 0.987 | 0.988 | 0.989 | 0.99 | 0.992 | 0.994 |
| 33.15999999999958 | 0.985 | 0.985 | 0.985 | 0.986 | 0.986 | 0.987 | 0.988 | 0.989 | 0.99 | 0.992 | 0.994 |
| 33.17999999999959 | 0.985 | 0.985 | 0.985 | 0.986 | 0.986 | 0.987 | 0.988 | 0.989 | 0.99 | 0.992 | 0.994 |
| 33.1999999999996 | 0.985 | 0.985 | 0.985 | 0.986 | 0.986 | 0.987 | 0.988 | 0.989 | 0.99 | 0.992 | 0.994 |
| 33.2199999999996 | 0.985 | 0.985 | 0.985 | 0.986 | 0.986 | 0.987 | 0.988 | 0.989 | 0.99 | 0.992 | 0.994 |
| 33.2399999999996 | 0.985 | 0.985 | 0.985 | 0.986 | 0.986 | 0.987 | 0.988 | 0.989 | 0.99 | 0.992 | 0.994 |
| 33.2599999999996 | 0.985 | 0.985 | 0.985 | 0.986 | 0.986 | 0.987 | 0.988 | 0.989 | 0.99 | 0.992 | 0.994 |
| 33.2799999999996 | 0.985 | 0.985 | 0.985 | 0.986 | 0.986 | 0.987 | 0.988 | 0.989 | 0.99 | 0.992 | 0.994 |
| 33.2999999999996 | 0.985 | 0.985 | 0.985 | 0.986 | 0.986 | 0.987 | 0.988 | 0.989 | 0.99 | 0.992 | 0.994 |
| 33.31999999999961 | 0.985 | 0.985 | 0.985 | 0.986 | 0.986 | 0.987 | 0.988 | 0.989 | 0.99 | 0.992 | 0.994 |
| 33.33999999999961 | 0.985 | 0.985 | 0.985 | 0.986 | 0.986 | 0.987 | 0.988 | 0.989 | 0.99 | 0.992 | 0.994 |
| 33.35999999999962 | 0.985 | 0.985 | 0.985 | 0.986 | 0.986 | 0.987 | 0.988 | 0.989 | 0.99 | 0.992 | 0.994 |
| 33.37999999999962 | 0.985 | 0.985 | 0.985 | 0.986 | 0.986 | 0.987 | 0.988 | 0.989 | 0.99 | 0.992 | 0.994 |
| 33.39999999999962 | 0.985 | 0.985 | 0.985 | 0.986 | 0.986 | 0.987 | 0.988 | 0.989 | 0.99 | 0.992 | 0.994 |
| 33.41999999999963 | 0.985 | 0.985 | 0.985 | 0.986 | 0.986 | 0.987 | 0.988 | 0.989 | 0.99 | 0.992 | 0.994 |
| 33.43999999999963 | 0.985 | 0.985 | 0.985 | 0.986 | 0.986 | 0.987 | 0.988 | 0.989 | 0.99 | 0.992 | 0.994 |
| 33.45999999999963 | 0.985 | 0.985 | 0.985 | 0.986 | 0.986 | 0.987 | 0.988 | 0.989 | 0.99 | 0.992 | 0.994 |
| 33.47999999999963 | 0.985 | 0.985 | 0.985 | 0.986 | 0.986 | 0.987 | 0.988 | 0.989 | 0.99 | 0.992 | 0.994 |
| 33.49999999999964 | 0.985 | 0.985 | 0.985 | 0.986 | 0.986 | 0.987 | 0.988 | 0.989 | 0.99 | 0.992 | 0.994 |
| 33.51999999999964 | 0.985 | 0.985 | 0.985 | 0.986 | 0.986 | 0.987 | 0.988 | 0.989 | 0.99 | 0.992 | 0.994 |
| 33.53999999999964 | 0.985 | 0.985 | 0.985 | 0.986 | 0.986 | 0.987 | 0.988 | 0.989 | 0.99 | 0.992 | 0.994 |
| 33.55999999999965 | 0.985 | 0.985 | 0.985 | 0.986 | 0.986 | 0.987 | 0.988 | 0.989 | 0.99 | 0.992 | 0.994 |
| 33.57999999999965 | 0.985 | 0.985 | 0.985 | 0.986 | 0.986 | 0.987 | 0.988 | 0.989 | 0.99 | 0.992 | 0.994 |
| 33.59999999999965 | 0.985 | 0.985 | 0.985 | 0.986 | 0.986 | 0.987 | 0.988 | 0.989 | 0.99 | 0.992 | 0.994 |
| 33.61999999999966 | 0.985 | 0.985 | 0.985 | 0.986 | 0.986 | 0.987 | 0.988 | 0.989 | 0.99 | 0.992 | 0.994 |
| 33.63999999999966 | 0.985 | 0.985 | 0.985 | 0.986 | 0.986 | 0.987 | 0.988 | 0.989 | 0.99 | 0.992 | 0.994 |
| 33.65999999999966 | 0.985 | 0.985 | 0.985 | 0.986 | 0.986 | 0.987 | 0.988 | 0.989 | 0.99 | 0.992 | 0.994 |
| 33.67999999999967 | 0.985 | 0.985 | 0.985 | 0.986 | 0.986 | 0.987 | 0.988 | 0.989 | 0.99 | 0.992 | 0.994 |
| 33.69999999999967 | 0.985 | 0.985 | 0.985 | 0.986 | 0.986 | 0.987 | 0.988 | 0.989 | 0.99 | 0.992 | 0.994 |
| 33.71999999999967 | 0.985 | 0.985 | 0.985 | 0.986 | 0.986 | 0.987 | 0.988 | 0.989 | 0.99 | 0.992 | 0.994 |
| 33.73999999999967 | 0.985 | 0.985 | 0.986 | 0.986 | 0.986 | 0.987 | 0.988 | 0.989 | 0.99 | 0.992 | 0.994 |
| 33.75999999999968 | 0.985 | 0.985 | 0.986 | 0.986 | 0.986 | 0.987 | 0.988 | 0.989 | 0.99 | 0.992 | 0.994 |
| 33.77999999999968 | 0.985 | 0.985 | 0.986 | 0.986 | 0.986 | 0.987 | 0.988 | 0.989 | 0.99 | 0.992 | 0.994 |
| 33.79999999999968 | 0.985 | 0.985 | 0.986 | 0.986 | 0.986 | 0.987 | 0.988 | 0.989 | 0.99 | 0.992 | 0.994 |
| 33.81999999999969 | 0.985 | 0.985 | 0.986 | 0.986 | 0.986 | 0.987 | 0.988 | 0.989 | 0.99 | 0.992 | 0.994 |
| 33.8399999999997 | 0.985 | 0.985 | 0.986 | 0.986 | 0.986 | 0.987 | 0.988 | 0.989 | 0.99 | 0.992 | 0.994 |
| 33.85999999999969 | 0.985 | 0.985 | 0.986 | 0.986 | 0.986 | 0.987 | 0.988 | 0.989 | 0.99 | 0.992 | 0.994 |
| 33.8799999999997 | 0.985 | 0.985 | 0.986 | 0.986 | 0.986 | 0.987 | 0.988 | 0.989 | 0.99 | 0.992 | 0.994 |
| 33.8999999999997 | 0.985 | 0.985 | 0.986 | 0.986 | 0.986 | 0.987 | 0.988 | 0.989 | 0.99 | 0.992 | 0.994 |
| 33.9199999999997 | 0.985 | 0.985 | 0.986 | 0.986 | 0.986 | 0.987 | 0.988 | 0.989 | 0.99 | 0.992 | 0.994 |
| 33.9399999999997 | 0.985 | 0.985 | 0.986 | 0.986 | 0.986 | 0.987 | 0.988 | 0.989 | 0.99 | 0.992 | 0.994 |
| 33.95999999999971 | 0.985 | 0.985 | 0.986 | 0.986 | 0.986 | 0.987 | 0.988 | 0.989 | 0.99 | 0.992 | 0.994 |
| 33.97999999999971 | 0.985 | 0.985 | 0.986 | 0.986 | 0.986 | 0.987 | 0.988 | 0.989 | 0.99 | 0.992 | 0.994 |
| 33.99999999999971 | 0.985 | 0.985 | 0.986 | 0.986 | 0.986 | 0.987 | 0.988 | 0.989 | 0.99 | 0.992 | 0.994 |
| 34.01999999999972 | 0.985 | 0.985 | 0.986 | 0.986 | 0.986 | 0.987 | 0.988 | 0.989 | 0.99 | 0.992 | 0.994 |
| 34.03999999999972 | 0.985 | 0.985 | 0.986 | 0.986 | 0.986 | 0.987 | 0.988 | 0.989 | 0.99 | 0.992 | 0.994 |
| 34.05999999999972 | 0.985 | 0.985 | 0.986 | 0.986 | 0.986 | 0.987 | 0.988 | 0.989 | 0.99 | 0.992 | 0.994 |
| 34.07999999999972 | 0.985 | 0.985 | 0.986 | 0.986 | 0.986 | 0.987 | 0.988 | 0.989 | 0.99 | 0.992 | 0.994 |
| 34.09999999999973 | 0.985 | 0.985 | 0.986 | 0.986 | 0.986 | 0.987 | 0.988 | 0.989 | 0.99 | 0.992 | 0.994 |
| 34.11999999999973 | 0.985 | 0.985 | 0.986 | 0.986 | 0.987 | 0.987 | 0.988 | 0.989 | 0.99 | 0.992 | 0.994 |
| 34.13999999999973 | 0.985 | 0.985 | 0.986 | 0.986 | 0.987 | 0.987 | 0.988 | 0.989 | 0.99 | 0.992 | 0.994 |
| 34.15999999999974 | 0.985 | 0.985 | 0.986 | 0.986 | 0.987 | 0.987 | 0.988 | 0.989 | 0.99 | 0.992 | 0.994 |
| 34.17999999999974 | 0.985 | 0.985 | 0.986 | 0.986 | 0.987 | 0.987 | 0.988 | 0.989 | 0.99 | 0.992 | 0.994 |
| 34.19999999999974 | 0.985 | 0.985 | 0.986 | 0.986 | 0.987 | 0.987 | 0.988 | 0.989 | 0.99 | 0.992 | 0.994 |
| 34.21999999999975 | 0.985 | 0.985 | 0.986 | 0.986 | 0.987 | 0.987 | 0.988 | 0.989 | 0.99 | 0.992 | 0.994 |
| 34.23999999999975 | 0.985 | 0.985 | 0.986 | 0.986 | 0.987 | 0.987 | 0.988 | 0.989 | 0.99 | 0.992 | 0.994 |
| 34.25999999999975 | 0.985 | 0.985 | 0.986 | 0.986 | 0.987 | 0.987 | 0.988 | 0.989 | 0.99 | 0.992 | 0.994 |
| 34.27999999999975 | 0.985 | 0.985 | 0.986 | 0.986 | 0.987 | 0.987 | 0.988 | 0.989 | 0.99 | 0.992 | 0.994 |
| 34.29999999999976 | 0.985 | 0.985 | 0.986 | 0.986 | 0.987 | 0.987 | 0.988 | 0.989 | 0.99 | 0.992 | 0.994 |
| 34.31999999999977 | 0.985 | 0.985 | 0.986 | 0.986 | 0.987 | 0.987 | 0.988 | 0.989 | 0.99 | 0.992 | 0.994 |
| 34.33999999999977 | 0.985 | 0.985 | 0.986 | 0.986 | 0.987 | 0.987 | 0.988 | 0.989 | 0.99 | 0.992 | 0.994 |
| 34.35999999999977 | 0.985 | 0.985 | 0.986 | 0.986 | 0.987 | 0.987 | 0.988 | 0.989 | 0.99 | 0.992 | 0.994 |
| 34.37999999999977 | 0.985 | 0.985 | 0.986 | 0.986 | 0.987 | 0.987 | 0.988 | 0.989 | 0.99 | 0.992 | 0.994 |
| 34.39999999999977 | 0.985 | 0.985 | 0.986 | 0.986 | 0.987 | 0.987 | 0.988 | 0.989 | 0.99 | 0.992 | 0.994 |
| 34.41999999999978 | 0.985 | 0.985 | 0.986 | 0.986 | 0.987 | 0.987 | 0.988 | 0.989 | 0.99 | 0.992 | 0.994 |
| 34.43999999999978 | 0.985 | 0.985 | 0.986 | 0.986 | 0.987 | 0.987 | 0.988 | 0.989 | 0.99 | 0.992 | 0.994 |
| 34.45999999999979 | 0.985 | 0.985 | 0.986 | 0.986 | 0.987 | 0.987 | 0.988 | 0.989 | 0.99 | 0.992 | 0.994 |
| 34.4799999999998 | 0.985 | 0.985 | 0.986 | 0.986 | 0.987 | 0.987 | 0.988 | 0.989 | 0.99 | 0.992 | 0.994 |
| 34.4999999999998 | 0.985 | 0.986 | 0.986 | 0.986 | 0.987 | 0.987 | 0.988 | 0.989 | 0.99 | 0.992 | 0.994 |
| 34.5199999999998 | 0.985 | 0.986 | 0.986 | 0.986 | 0.987 | 0.987 | 0.988 | 0.989 | 0.99 | 0.992 | 0.994 |
| 34.5399999999998 | 0.985 | 0.986 | 0.986 | 0.986 | 0.987 | 0.987 | 0.988 | 0.989 | 0.99 | 0.992 | 0.994 |
| 34.5599999999998 | 0.985 | 0.986 | 0.986 | 0.986 | 0.987 | 0.987 | 0.988 | 0.989 | 0.99 | 0.992 | 0.994 |
| 34.5799999999998 | 0.985 | 0.986 | 0.986 | 0.986 | 0.987 | 0.987 | 0.988 | 0.989 | 0.99 | 0.992 | 0.994 |
| 34.5999999999998 | 0.985 | 0.986 | 0.986 | 0.986 | 0.987 | 0.987 | 0.988 | 0.989 | 0.99 | 0.992 | 0.994 |
| 34.61999999999981 | 0.985 | 0.986 | 0.986 | 0.986 | 0.987 | 0.987 | 0.988 | 0.989 | 0.99 | 0.992 | 0.994 |
| 34.63999999999981 | 0.985 | 0.986 | 0.986 | 0.986 | 0.987 | 0.987 | 0.988 | 0.989 | 0.99 | 0.992 | 0.994 |
| 34.65999999999982 | 0.985 | 0.986 | 0.986 | 0.986 | 0.987 | 0.987 | 0.988 | 0.989 | 0.99 | 0.992 | 0.994 |
| 34.67999999999982 | 0.985 | 0.986 | 0.986 | 0.986 | 0.987 | 0.987 | 0.988 | 0.989 | 0.99 | 0.992 | 0.994 |
| 34.69999999999982 | 0.985 | 0.986 | 0.986 | 0.986 | 0.987 | 0.987 | 0.988 | 0.989 | 0.99 | 0.992 | 0.994 |
| 34.71999999999982 | 0.985 | 0.986 | 0.986 | 0.986 | 0.987 | 0.987 | 0.988 | 0.989 | 0.99 | 0.992 | 0.994 |
| 34.73999999999983 | 0.986 | 0.986 | 0.986 | 0.986 | 0.987 | 0.987 | 0.988 | 0.989 | 0.99 | 0.992 | 0.994 |
| 34.75999999999983 | 0.986 | 0.986 | 0.986 | 0.986 | 0.987 | 0.987 | 0.988 | 0.989 | 0.99 | 0.992 | 0.994 |
| 34.77999999999983 | 0.986 | 0.986 | 0.986 | 0.986 | 0.987 | 0.987 | 0.988 | 0.989 | 0.99 | 0.992 | 0.994 |
| 34.79999999999984 | 0.986 | 0.986 | 0.986 | 0.986 | 0.987 | 0.987 | 0.988 | 0.989 | 0.99 | 0.992 | 0.994 |
| 34.81999999999984 | 0.986 | 0.986 | 0.986 | 0.986 | 0.987 | 0.987 | 0.988 | 0.989 | 0.991 | 0.992 | 0.994 |
| 34.83999999999984 | 0.986 | 0.986 | 0.986 | 0.986 | 0.987 | 0.987 | 0.988 | 0.989 | 0.991 | 0.992 | 0.994 |
| 34.85999999999985 | 0.986 | 0.986 | 0.986 | 0.986 | 0.987 | 0.987 | 0.988 | 0.989 | 0.991 | 0.992 | 0.994 |
| 34.87999999999985 | 0.986 | 0.986 | 0.986 | 0.986 | 0.987 | 0.987 | 0.988 | 0.989 | 0.991 | 0.992 | 0.994 |
| 34.89999999999985 | 0.986 | 0.986 | 0.986 | 0.986 | 0.987 | 0.987 | 0.988 | 0.989 | 0.991 | 0.992 | 0.994 |
| 34.91999999999986 | 0.986 | 0.986 | 0.986 | 0.986 | 0.987 | 0.987 | 0.988 | 0.989 | 0.991 | 0.992 | 0.994 |
| 34.93999999999986 | 0.986 | 0.986 | 0.986 | 0.986 | 0.987 | 0.987 | 0.988 | 0.989 | 0.991 | 0.992 | 0.994 |
| 34.95999999999987 | 0.986 | 0.986 | 0.986 | 0.987 | 0.987 | 0.987 | 0.988 | 0.989 | 0.991 | 0.992 | 0.994 |
| 34.97999999999987 | 0.986 | 0.986 | 0.986 | 0.987 | 0.987 | 0.987 | 0.988 | 0.989 | 0.991 | 0.992 | 0.994 |
| 34.99999999999987 | 0.986 | 0.986 | 0.986 | 0.987 | 0.987 | 0.987 | 0.988 | 0.989 | 0.991 | 0.992 | 0.994 |
| 35.01999999999987 | 0.986 | 0.986 | 0.986 | 0.987 | 0.987 | 0.987 | 0.988 | 0.989 | 0.991 | 0.992 | 0.994 |
| 35.03999999999987 | 0.986 | 0.986 | 0.986 | 0.987 | 0.987 | 0.987 | 0.988 | 0.989 | 0.991 | 0.992 | 0.994 |
| 35.05999999999988 | 0.986 | 0.986 | 0.986 | 0.987 | 0.987 | 0.987 | 0.988 | 0.989 | 0.991 | 0.992 | 0.994 |
| 35.07999999999988 | 0.986 | 0.986 | 0.986 | 0.987 | 0.987 | 0.987 | 0.988 | 0.989 | 0.991 | 0.992 | 0.994 |
| 35.09999999999988 | 0.986 | 0.986 | 0.986 | 0.987 | 0.987 | 0.987 | 0.988 | 0.989 | 0.991 | 0.992 | 0.994 |
| 35.1199999999999 | 0.986 | 0.986 | 0.986 | 0.987 | 0.987 | 0.987 | 0.988 | 0.989 | 0.991 | 0.992 | 0.994 |
| 35.1399999999999 | 0.986 | 0.986 | 0.986 | 0.987 | 0.987 | 0.987 | 0.988 | 0.989 | 0.991 | 0.992 | 0.994 |
| 35.1599999999999 | 0.986 | 0.986 | 0.986 | 0.987 | 0.987 | 0.987 | 0.988 | 0.989 | 0.991 | 0.992 | 0.994 |
| 35.1799999999999 | 0.986 | 0.986 | 0.986 | 0.987 | 0.987 | 0.987 | 0.988 | 0.989 | 0.991 | 0.992 | 0.994 |
| 35.1999999999999 | 0.986 | 0.986 | 0.986 | 0.987 | 0.987 | 0.987 | 0.988 | 0.989 | 0.991 | 0.992 | 0.994 |
| 35.2199999999999 | 0.986 | 0.986 | 0.986 | 0.987 | 0.987 | 0.987 | 0.988 | 0.989 | 0.991 | 0.992 | 0.994 |
| 35.2399999999999 | 0.986 | 0.986 | 0.986 | 0.987 | 0.987 | 0.987 | 0.988 | 0.989 | 0.991 | 0.992 | 0.994 |
| 35.25999999999991 | 0.986 | 0.986 | 0.986 | 0.987 | 0.987 | 0.987 | 0.988 | 0.989 | 0.991 | 0.992 | 0.994 |
| 35.27999999999991 | 0.986 | 0.986 | 0.986 | 0.987 | 0.987 | 0.987 | 0.988 | 0.989 | 0.991 | 0.992 | 0.994 |
| 35.29999999999991 | 0.986 | 0.986 | 0.986 | 0.987 | 0.987 | 0.987 | 0.988 | 0.989 | 0.991 | 0.992 | 0.994 |
| 35.31999999999992 | 0.986 | 0.986 | 0.986 | 0.987 | 0.987 | 0.987 | 0.988 | 0.989 | 0.991 | 0.992 | 0.994 |
| 35.33999999999992 | 0.986 | 0.986 | 0.986 | 0.987 | 0.987 | 0.987 | 0.988 | 0.989 | 0.991 | 0.992 | 0.994 |
| 35.35999999999993 | 0.986 | 0.986 | 0.986 | 0.987 | 0.987 | 0.987 | 0.988 | 0.989 | 0.991 | 0.992 | 0.994 |
| 35.37999999999993 | 0.986 | 0.986 | 0.986 | 0.987 | 0.987 | 0.987 | 0.988 | 0.989 | 0.991 | 0.992 | 0.994 |
| 35.39999999999993 | 0.986 | 0.986 | 0.986 | 0.987 | 0.987 | 0.987 | 0.988 | 0.989 | 0.991 | 0.992 | 0.994 |
| 35.41999999999994 | 0.986 | 0.986 | 0.986 | 0.987 | 0.987 | 0.987 | 0.988 | 0.989 | 0.991 | 0.992 | 0.994 |
| 35.43999999999994 | 0.986 | 0.986 | 0.986 | 0.987 | 0.987 | 0.987 | 0.988 | 0.989 | 0.991 | 0.992 | 0.994 |
| 35.45999999999994 | 0.986 | 0.986 | 0.986 | 0.987 | 0.987 | 0.987 | 0.988 | 0.989 | 0.991 | 0.992 | 0.994 |
| 35.47999999999994 | 0.986 | 0.986 | 0.986 | 0.987 | 0.987 | 0.987 | 0.988 | 0.989 | 0.991 | 0.992 | 0.994 |
| 35.49999999999995 | 0.986 | 0.986 | 0.986 | 0.987 | 0.987 | 0.987 | 0.988 | 0.989 | 0.991 | 0.992 | 0.994 |
| 35.51999999999995 | 0.986 | 0.986 | 0.986 | 0.987 | 0.987 | 0.987 | 0.988 | 0.989 | 0.991 | 0.992 | 0.994 |
| 35.53999999999995 | 0.986 | 0.986 | 0.986 | 0.987 | 0.987 | 0.987 | 0.988 | 0.989 | 0.991 | 0.992 | 0.994 |
| 35.55999999999996 | 0.986 | 0.986 | 0.986 | 0.987 | 0.987 | 0.987 | 0.988 | 0.989 | 0.991 | 0.992 | 0.994 |
| 35.57999999999996 | 0.986 | 0.986 | 0.986 | 0.987 | 0.987 | 0.987 | 0.988 | 0.989 | 0.991 | 0.992 | 0.994 |
| 35.59999999999996 | 0.986 | 0.986 | 0.986 | 0.987 | 0.987 | 0.987 | 0.988 | 0.989 | 0.991 | 0.992 | 0.994 |
| 35.61999999999997 | 0.986 | 0.986 | 0.986 | 0.987 | 0.987 | 0.987 | 0.988 | 0.989 | 0.991 | 0.992 | 0.994 |
| 35.63999999999997 | 0.986 | 0.986 | 0.986 | 0.987 | 0.987 | 0.987 | 0.988 | 0.989 | 0.991 | 0.992 | 0.994 |
| 35.65999999999997 | 0.986 | 0.986 | 0.986 | 0.987 | 0.987 | 0.987 | 0.988 | 0.989 | 0.991 | 0.992 | 0.994 |
| 35.67999999999997 | 0.986 | 0.986 | 0.986 | 0.987 | 0.987 | 0.987 | 0.988 | 0.989 | 0.991 | 0.992 | 0.994 |
| 35.69999999999998 | 0.986 | 0.986 | 0.986 | 0.987 | 0.987 | 0.987 | 0.988 | 0.989 | 0.991 | 0.992 | 0.994 |
| 35.71999999999998 | 0.986 | 0.986 | 0.986 | 0.987 | 0.987 | 0.987 | 0.988 | 0.989 | 0.991 | 0.992 | 0.994 |
| 35.73999999999998 | 0.986 | 0.986 | 0.986 | 0.987 | 0.987 | 0.987 | 0.988 | 0.989 | 0.991 | 0.992 | 0.994 |
| 35.76 | 0.986 | 0.986 | 0.986 | 0.987 | 0.987 | 0.987 | 0.988 | 0.989 | 0.991 | 0.992 | 0.994 |
| 35.78 | 0.986 | 0.986 | 0.986 | 0.987 | 0.987 | 0.987 | 0.988 | 0.989 | 0.991 | 0.992 | 0.994 |
| 35.8 | 0.986 | 0.986 | 0.986 | 0.987 | 0.987 | 0.987 | 0.988 | 0.989 | 0.991 | 0.992 | 0.994 |
| 35.82 | 0.986 | 0.986 | 0.986 | 0.987 | 0.987 | 0.987 | 0.988 | 0.989 | 0.991 | 0.992 | 0.994 |
| 35.84 | 0.986 | 0.986 | 0.986 | 0.987 | 0.987 | 0.987 | 0.988 | 0.989 | 0.991 | 0.992 | 0.994 |
| 35.86000000000001 | 0.986 | 0.986 | 0.986 | 0.987 | 0.987 | 0.987 | 0.988 | 0.989 | 0.991 | 0.992 | 0.994 |
| 35.88000000000001 | 0.986 | 0.986 | 0.986 | 0.987 | 0.987 | 0.987 | 0.988 | 0.989 | 0.991 | 0.992 | 0.994 |
| 35.90000000000001 | 0.986 | 0.986 | 0.986 | 0.987 | 0.987 | 0.988 | 0.988 | 0.989 | 0.991 | 0.992 | 0.994 |
| 35.92000000000002 | 0.986 | 0.986 | 0.986 | 0.987 | 0.987 | 0.988 | 0.988 | 0.989 | 0.991 | 0.992 | 0.994 |
| 35.94000000000002 | 0.986 | 0.986 | 0.986 | 0.987 | 0.987 | 0.988 | 0.988 | 0.989 | 0.991 | 0.992 | 0.994 |
| 35.96000000000002 | 0.986 | 0.986 | 0.986 | 0.987 | 0.987 | 0.988 | 0.988 | 0.989 | 0.991 | 0.992 | 0.994 |
| 35.98000000000003 | 0.986 | 0.986 | 0.986 | 0.987 | 0.987 | 0.988 | 0.988 | 0.989 | 0.991 | 0.992 | 0.994 |
| 36.00000000000003 | 0.986 | 0.986 | 0.986 | 0.987 | 0.987 | 0.988 | 0.988 | 0.989 | 0.991 | 0.992 | 0.994 |
| 36.02000000000003 | 0.986 | 0.986 | 0.986 | 0.987 | 0.987 | 0.988 | 0.988 | 0.989 | 0.991 | 0.992 | 0.994 |
| 36.04000000000003 | 0.986 | 0.986 | 0.986 | 0.987 | 0.987 | 0.988 | 0.988 | 0.989 | 0.991 | 0.992 | 0.994 |
| 36.06000000000004 | 0.986 | 0.986 | 0.986 | 0.987 | 0.987 | 0.988 | 0.988 | 0.989 | 0.991 | 0.992 | 0.994 |
| 36.08000000000004 | 0.986 | 0.986 | 0.986 | 0.987 | 0.987 | 0.988 | 0.988 | 0.989 | 0.991 | 0.992 | 0.994 |
| 36.10000000000004 | 0.986 | 0.986 | 0.986 | 0.987 | 0.987 | 0.988 | 0.988 | 0.989 | 0.991 | 0.992 | 0.994 |
| 36.12000000000004 | 0.986 | 0.986 | 0.986 | 0.987 | 0.987 | 0.988 | 0.988 | 0.989 | 0.991 | 0.992 | 0.994 |
| 36.14000000000005 | 0.986 | 0.986 | 0.986 | 0.987 | 0.987 | 0.988 | 0.988 | 0.989 | 0.991 | 0.992 | 0.994 |
| 36.16000000000005 | 0.986 | 0.986 | 0.986 | 0.987 | 0.987 | 0.988 | 0.988 | 0.989 | 0.991 | 0.992 | 0.994 |
| 36.18000000000006 | 0.986 | 0.986 | 0.986 | 0.987 | 0.987 | 0.988 | 0.988 | 0.989 | 0.991 | 0.992 | 0.994 |
| 36.20000000000006 | 0.986 | 0.986 | 0.986 | 0.987 | 0.987 | 0.988 | 0.988 | 0.989 | 0.991 | 0.992 | 0.994 |
| 36.22000000000006 | 0.986 | 0.986 | 0.986 | 0.987 | 0.987 | 0.988 | 0.988 | 0.989 | 0.991 | 0.992 | 0.994 |
| 36.24000000000007 | 0.986 | 0.986 | 0.986 | 0.987 | 0.987 | 0.988 | 0.988 | 0.989 | 0.991 | 0.992 | 0.994 |
| 36.26000000000007 | 0.986 | 0.986 | 0.986 | 0.987 | 0.987 | 0.988 | 0.988 | 0.989 | 0.991 | 0.992 | 0.994 |
| 36.28000000000007 | 0.986 | 0.986 | 0.986 | 0.987 | 0.987 | 0.988 | 0.988 | 0.989 | 0.991 | 0.992 | 0.994 |
| 36.30000000000008 | 0.986 | 0.986 | 0.987 | 0.987 | 0.987 | 0.988 | 0.988 | 0.989 | 0.991 | 0.992 | 0.994 |
| 36.32000000000008 | 0.986 | 0.986 | 0.987 | 0.987 | 0.987 | 0.988 | 0.988 | 0.989 | 0.991 | 0.992 | 0.994 |
| 36.34000000000008 | 0.986 | 0.986 | 0.987 | 0.987 | 0.987 | 0.988 | 0.988 | 0.989 | 0.991 | 0.992 | 0.994 |
| 36.36000000000008 | 0.986 | 0.986 | 0.987 | 0.987 | 0.987 | 0.988 | 0.988 | 0.99 | 0.991 | 0.992 | 0.994 |
| 36.38000000000009 | 0.986 | 0.986 | 0.987 | 0.987 | 0.987 | 0.988 | 0.988 | 0.99 | 0.991 | 0.992 | 0.994 |
| 36.4000000000001 | 0.986 | 0.986 | 0.987 | 0.987 | 0.987 | 0.988 | 0.988 | 0.99 | 0.991 | 0.992 | 0.994 |
| 36.4200000000001 | 0.986 | 0.986 | 0.987 | 0.987 | 0.987 | 0.988 | 0.988 | 0.99 | 0.991 | 0.992 | 0.994 |
| 36.4400000000001 | 0.986 | 0.986 | 0.987 | 0.987 | 0.987 | 0.988 | 0.989 | 0.99 | 0.991 | 0.992 | 0.994 |
| 36.4600000000001 | 0.986 | 0.986 | 0.987 | 0.987 | 0.987 | 0.988 | 0.989 | 0.99 | 0.991 | 0.992 | 0.994 |
| 36.4800000000001 | 0.986 | 0.986 | 0.987 | 0.987 | 0.987 | 0.988 | 0.989 | 0.99 | 0.991 | 0.992 | 0.994 |
| 36.50000000000011 | 0.986 | 0.986 | 0.987 | 0.987 | 0.987 | 0.988 | 0.989 | 0.99 | 0.991 | 0.992 | 0.994 |
| 36.52000000000011 | 0.986 | 0.986 | 0.987 | 0.987 | 0.987 | 0.988 | 0.989 | 0.99 | 0.991 | 0.992 | 0.994 |
| 36.54000000000011 | 0.986 | 0.986 | 0.987 | 0.987 | 0.987 | 0.988 | 0.989 | 0.99 | 0.991 | 0.992 | 0.994 |
| 36.56000000000012 | 0.986 | 0.986 | 0.987 | 0.987 | 0.987 | 0.988 | 0.989 | 0.99 | 0.991 | 0.992 | 0.994 |
| 36.58000000000012 | 0.986 | 0.986 | 0.987 | 0.987 | 0.987 | 0.988 | 0.989 | 0.99 | 0.991 | 0.992 | 0.994 |
| 36.60000000000012 | 0.986 | 0.986 | 0.987 | 0.987 | 0.987 | 0.988 | 0.989 | 0.99 | 0.991 | 0.992 | 0.994 |
| 36.62000000000012 | 0.986 | 0.986 | 0.987 | 0.987 | 0.987 | 0.988 | 0.989 | 0.99 | 0.991 | 0.992 | 0.994 |
| 36.64000000000013 | 0.986 | 0.986 | 0.987 | 0.987 | 0.987 | 0.988 | 0.989 | 0.99 | 0.991 | 0.992 | 0.994 |
| 36.66000000000013 | 0.986 | 0.986 | 0.987 | 0.987 | 0.987 | 0.988 | 0.989 | 0.99 | 0.991 | 0.992 | 0.994 |
| 36.68000000000013 | 0.986 | 0.986 | 0.987 | 0.987 | 0.987 | 0.988 | 0.989 | 0.99 | 0.991 | 0.992 | 0.994 |
| 36.70000000000014 | 0.986 | 0.986 | 0.987 | 0.987 | 0.987 | 0.988 | 0.989 | 0.99 | 0.991 | 0.992 | 0.994 |
| 36.72000000000014 | 0.986 | 0.986 | 0.987 | 0.987 | 0.987 | 0.988 | 0.989 | 0.99 | 0.991 | 0.992 | 0.994 |
| 36.74000000000014 | 0.986 | 0.986 | 0.987 | 0.987 | 0.987 | 0.988 | 0.989 | 0.99 | 0.991 | 0.992 | 0.994 |
| 36.76000000000014 | 0.986 | 0.986 | 0.987 | 0.987 | 0.987 | 0.988 | 0.989 | 0.99 | 0.991 | 0.992 | 0.994 |
| 36.78000000000015 | 0.986 | 0.986 | 0.987 | 0.987 | 0.987 | 0.988 | 0.989 | 0.99 | 0.991 | 0.992 | 0.994 |
| 36.80000000000015 | 0.986 | 0.986 | 0.987 | 0.987 | 0.987 | 0.988 | 0.989 | 0.99 | 0.991 | 0.992 | 0.994 |
| 36.82000000000016 | 0.986 | 0.986 | 0.987 | 0.987 | 0.987 | 0.988 | 0.989 | 0.99 | 0.991 | 0.992 | 0.994 |
| 36.84000000000016 | 0.986 | 0.986 | 0.987 | 0.987 | 0.987 | 0.988 | 0.989 | 0.99 | 0.991 | 0.992 | 0.994 |
| 36.86000000000016 | 0.986 | 0.986 | 0.987 | 0.987 | 0.987 | 0.988 | 0.989 | 0.99 | 0.991 | 0.992 | 0.994 |
| 36.88000000000017 | 0.986 | 0.986 | 0.987 | 0.987 | 0.987 | 0.988 | 0.989 | 0.99 | 0.991 | 0.992 | 0.994 |
| 36.90000000000017 | 0.986 | 0.986 | 0.987 | 0.987 | 0.987 | 0.988 | 0.989 | 0.99 | 0.991 | 0.992 | 0.994 |
| 36.92000000000017 | 0.986 | 0.986 | 0.987 | 0.987 | 0.987 | 0.988 | 0.989 | 0.99 | 0.991 | 0.992 | 0.994 |
| 36.94000000000018 | 0.986 | 0.986 | 0.987 | 0.987 | 0.987 | 0.988 | 0.989 | 0.99 | 0.991 | 0.992 | 0.994 |
| 36.96000000000018 | 0.986 | 0.986 | 0.987 | 0.987 | 0.987 | 0.988 | 0.989 | 0.99 | 0.991 | 0.992 | 0.994 |
| 36.98000000000018 | 0.986 | 0.986 | 0.987 | 0.987 | 0.987 | 0.988 | 0.989 | 0.99 | 0.991 | 0.992 | 0.994 |
| 37.00000000000018 | 0.986 | 0.986 | 0.987 | 0.987 | 0.987 | 0.988 | 0.989 | 0.99 | 0.991 | 0.992 | 0.994 |
| 37.02000000000019 | 0.986 | 0.986 | 0.987 | 0.987 | 0.987 | 0.988 | 0.989 | 0.99 | 0.991 | 0.992 | 0.994 |
| 37.0400000000002 | 0.986 | 0.986 | 0.987 | 0.987 | 0.987 | 0.988 | 0.989 | 0.99 | 0.991 | 0.992 | 0.994 |
| 37.0600000000002 | 0.986 | 0.987 | 0.987 | 0.987 | 0.987 | 0.988 | 0.989 | 0.99 | 0.991 | 0.992 | 0.994 |
| 37.0800000000002 | 0.986 | 0.987 | 0.987 | 0.987 | 0.987 | 0.988 | 0.989 | 0.99 | 0.991 | 0.992 | 0.994 |
| 37.1000000000002 | 0.986 | 0.987 | 0.987 | 0.987 | 0.988 | 0.988 | 0.989 | 0.99 | 0.991 | 0.992 | 0.994 |
| 37.1200000000002 | 0.986 | 0.987 | 0.987 | 0.987 | 0.988 | 0.988 | 0.989 | 0.99 | 0.991 | 0.992 | 0.994 |
| 37.14000000000021 | 0.986 | 0.987 | 0.987 | 0.987 | 0.988 | 0.988 | 0.989 | 0.99 | 0.991 | 0.992 | 0.994 |
| 37.16000000000021 | 0.986 | 0.987 | 0.987 | 0.987 | 0.988 | 0.988 | 0.989 | 0.99 | 0.991 | 0.992 | 0.994 |
| 37.18000000000021 | 0.986 | 0.987 | 0.987 | 0.987 | 0.988 | 0.988 | 0.989 | 0.99 | 0.991 | 0.992 | 0.994 |
| 37.20000000000022 | 0.986 | 0.987 | 0.987 | 0.987 | 0.988 | 0.988 | 0.989 | 0.99 | 0.991 | 0.992 | 0.994 |
| 37.22000000000022 | 0.986 | 0.987 | 0.987 | 0.987 | 0.988 | 0.988 | 0.989 | 0.99 | 0.991 | 0.992 | 0.994 |
| 37.24000000000022 | 0.986 | 0.987 | 0.987 | 0.987 | 0.988 | 0.988 | 0.989 | 0.99 | 0.991 | 0.992 | 0.994 |
| 37.26000000000022 | 0.986 | 0.987 | 0.987 | 0.987 | 0.988 | 0.988 | 0.989 | 0.99 | 0.991 | 0.992 | 0.994 |
| 37.28000000000023 | 0.986 | 0.987 | 0.987 | 0.987 | 0.988 | 0.988 | 0.989 | 0.99 | 0.991 | 0.992 | 0.994 |
| 37.30000000000023 | 0.987 | 0.987 | 0.987 | 0.987 | 0.988 | 0.988 | 0.989 | 0.99 | 0.991 | 0.992 | 0.994 |
| 37.32000000000023 | 0.987 | 0.987 | 0.987 | 0.987 | 0.988 | 0.988 | 0.989 | 0.99 | 0.991 | 0.992 | 0.994 |
| 37.34000000000024 | 0.987 | 0.987 | 0.987 | 0.987 | 0.988 | 0.988 | 0.989 | 0.99 | 0.991 | 0.992 | 0.994 |
| 37.36000000000024 | 0.987 | 0.987 | 0.987 | 0.987 | 0.988 | 0.988 | 0.989 | 0.99 | 0.991 | 0.992 | 0.994 |
| 37.38000000000024 | 0.987 | 0.987 | 0.987 | 0.987 | 0.988 | 0.988 | 0.989 | 0.99 | 0.991 | 0.992 | 0.994 |
| 37.40000000000025 | 0.987 | 0.987 | 0.987 | 0.987 | 0.988 | 0.988 | 0.989 | 0.99 | 0.991 | 0.992 | 0.994 |
| 37.42000000000025 | 0.987 | 0.987 | 0.987 | 0.987 | 0.988 | 0.988 | 0.989 | 0.99 | 0.991 | 0.992 | 0.994 |
| 37.44000000000025 | 0.987 | 0.987 | 0.987 | 0.987 | 0.988 | 0.988 | 0.989 | 0.99 | 0.991 | 0.992 | 0.994 |
| 37.46000000000026 | 0.987 | 0.987 | 0.987 | 0.987 | 0.988 | 0.988 | 0.989 | 0.99 | 0.991 | 0.992 | 0.994 |
| 37.48000000000026 | 0.987 | 0.987 | 0.987 | 0.987 | 0.988 | 0.988 | 0.989 | 0.99 | 0.991 | 0.992 | 0.994 |
| 37.50000000000026 | 0.987 | 0.987 | 0.987 | 0.987 | 0.988 | 0.988 | 0.989 | 0.99 | 0.991 | 0.992 | 0.994 |
| 37.52000000000027 | 0.987 | 0.987 | 0.987 | 0.987 | 0.988 | 0.988 | 0.989 | 0.99 | 0.991 | 0.992 | 0.994 |
| 37.54000000000027 | 0.987 | 0.987 | 0.987 | 0.987 | 0.988 | 0.988 | 0.989 | 0.99 | 0.991 | 0.992 | 0.994 |
| 37.56000000000027 | 0.987 | 0.987 | 0.987 | 0.987 | 0.988 | 0.988 | 0.989 | 0.99 | 0.991 | 0.992 | 0.994 |
| 37.58000000000028 | 0.987 | 0.987 | 0.987 | 0.987 | 0.988 | 0.988 | 0.989 | 0.99 | 0.991 | 0.992 | 0.994 |
| 37.60000000000028 | 0.987 | 0.987 | 0.987 | 0.987 | 0.988 | 0.988 | 0.989 | 0.99 | 0.991 | 0.992 | 0.994 |
| 37.62000000000028 | 0.987 | 0.987 | 0.987 | 0.987 | 0.988 | 0.988 | 0.989 | 0.99 | 0.991 | 0.992 | 0.994 |
| 37.64000000000028 | 0.987 | 0.987 | 0.987 | 0.987 | 0.988 | 0.988 | 0.989 | 0.99 | 0.991 | 0.992 | 0.994 |
| 37.66000000000029 | 0.987 | 0.987 | 0.987 | 0.987 | 0.988 | 0.988 | 0.989 | 0.99 | 0.991 | 0.992 | 0.994 |
| 37.6800000000003 | 0.987 | 0.987 | 0.987 | 0.987 | 0.988 | 0.988 | 0.989 | 0.99 | 0.991 | 0.992 | 0.994 |
| 37.7000000000003 | 0.987 | 0.987 | 0.987 | 0.987 | 0.988 | 0.988 | 0.989 | 0.99 | 0.991 | 0.992 | 0.994 |
| 37.7200000000003 | 0.987 | 0.987 | 0.987 | 0.987 | 0.988 | 0.988 | 0.989 | 0.99 | 0.991 | 0.992 | 0.994 |
| 37.7400000000003 | 0.987 | 0.987 | 0.987 | 0.987 | 0.988 | 0.988 | 0.989 | 0.99 | 0.991 | 0.992 | 0.994 |
| 37.7600000000003 | 0.987 | 0.987 | 0.987 | 0.987 | 0.988 | 0.988 | 0.989 | 0.99 | 0.991 | 0.992 | 0.994 |
| 37.78000000000031 | 0.987 | 0.987 | 0.987 | 0.987 | 0.988 | 0.988 | 0.989 | 0.99 | 0.991 | 0.992 | 0.994 |
| 37.80000000000031 | 0.987 | 0.987 | 0.987 | 0.987 | 0.988 | 0.988 | 0.989 | 0.99 | 0.991 | 0.992 | 0.994 |
| 37.82000000000031 | 0.987 | 0.987 | 0.987 | 0.987 | 0.988 | 0.988 | 0.989 | 0.99 | 0.991 | 0.992 | 0.994 |
| 37.84000000000032 | 0.987 | 0.987 | 0.987 | 0.987 | 0.988 | 0.988 | 0.989 | 0.99 | 0.991 | 0.992 | 0.994 |
| 37.86000000000032 | 0.987 | 0.987 | 0.987 | 0.987 | 0.988 | 0.988 | 0.989 | 0.99 | 0.991 | 0.992 | 0.994 |
| 37.88000000000032 | 0.987 | 0.987 | 0.987 | 0.987 | 0.988 | 0.988 | 0.989 | 0.99 | 0.991 | 0.992 | 0.994 |
| 37.90000000000033 | 0.987 | 0.987 | 0.987 | 0.987 | 0.988 | 0.988 | 0.989 | 0.99 | 0.991 | 0.992 | 0.994 |
| 37.92000000000033 | 0.987 | 0.987 | 0.987 | 0.987 | 0.988 | 0.988 | 0.989 | 0.99 | 0.991 | 0.992 | 0.994 |
| 37.94000000000033 | 0.987 | 0.987 | 0.987 | 0.988 | 0.988 | 0.988 | 0.989 | 0.99 | 0.991 | 0.992 | 0.994 |
| 37.96000000000033 | 0.987 | 0.987 | 0.987 | 0.988 | 0.988 | 0.988 | 0.989 | 0.99 | 0.991 | 0.992 | 0.994 |
| 37.98000000000034 | 0.987 | 0.987 | 0.987 | 0.988 | 0.988 | 0.988 | 0.989 | 0.99 | 0.991 | 0.992 | 0.994 |
| 38.00000000000034 | 0.987 | 0.987 | 0.987 | 0.988 | 0.988 | 0.988 | 0.989 | 0.99 | 0.991 | 0.992 | 0.994 |
| 38.02000000000034 | 0.987 | 0.987 | 0.987 | 0.988 | 0.988 | 0.988 | 0.989 | 0.99 | 0.991 | 0.992 | 0.994 |
| 38.04000000000035 | 0.987 | 0.987 | 0.987 | 0.988 | 0.988 | 0.988 | 0.989 | 0.99 | 0.991 | 0.992 | 0.994 |
| 38.06000000000035 | 0.987 | 0.987 | 0.987 | 0.988 | 0.988 | 0.988 | 0.989 | 0.99 | 0.991 | 0.992 | 0.994 |
| 38.08000000000035 | 0.987 | 0.987 | 0.987 | 0.988 | 0.988 | 0.988 | 0.989 | 0.99 | 0.991 | 0.992 | 0.994 |
| 38.10000000000036 | 0.987 | 0.987 | 0.987 | 0.988 | 0.988 | 0.988 | 0.989 | 0.99 | 0.991 | 0.992 | 0.994 |
| 38.12000000000036 | 0.987 | 0.987 | 0.987 | 0.988 | 0.988 | 0.988 | 0.989 | 0.99 | 0.991 | 0.992 | 0.994 |
| 38.14000000000036 | 0.987 | 0.987 | 0.987 | 0.988 | 0.988 | 0.988 | 0.989 | 0.99 | 0.991 | 0.992 | 0.994 |
| 38.16000000000037 | 0.987 | 0.987 | 0.987 | 0.988 | 0.988 | 0.988 | 0.989 | 0.99 | 0.991 | 0.992 | 0.994 |
| 38.18000000000037 | 0.987 | 0.987 | 0.987 | 0.988 | 0.988 | 0.988 | 0.989 | 0.99 | 0.991 | 0.992 | 0.994 |
| 38.20000000000037 | 0.987 | 0.987 | 0.987 | 0.988 | 0.988 | 0.988 | 0.989 | 0.99 | 0.991 | 0.992 | 0.994 |
| 38.22000000000037 | 0.987 | 0.987 | 0.987 | 0.988 | 0.988 | 0.988 | 0.989 | 0.99 | 0.991 | 0.992 | 0.994 |
| 38.24000000000038 | 0.987 | 0.987 | 0.987 | 0.988 | 0.988 | 0.988 | 0.989 | 0.99 | 0.991 | 0.992 | 0.994 |
| 38.26000000000038 | 0.987 | 0.987 | 0.987 | 0.988 | 0.988 | 0.988 | 0.989 | 0.99 | 0.991 | 0.992 | 0.994 |
| 38.28000000000038 | 0.987 | 0.987 | 0.987 | 0.988 | 0.988 | 0.988 | 0.989 | 0.99 | 0.991 | 0.992 | 0.994 |
| 38.30000000000039 | 0.987 | 0.987 | 0.987 | 0.988 | 0.988 | 0.988 | 0.989 | 0.99 | 0.991 | 0.992 | 0.994 |
| 38.3200000000004 | 0.987 | 0.987 | 0.987 | 0.988 | 0.988 | 0.988 | 0.989 | 0.99 | 0.991 | 0.992 | 0.994 |
| 38.34000000000039 | 0.987 | 0.987 | 0.987 | 0.988 | 0.988 | 0.988 | 0.989 | 0.99 | 0.991 | 0.992 | 0.994 |
| 38.3600000000004 | 0.987 | 0.987 | 0.987 | 0.988 | 0.988 | 0.988 | 0.989 | 0.99 | 0.991 | 0.992 | 0.994 |
| 38.3800000000004 | 0.987 | 0.987 | 0.987 | 0.988 | 0.988 | 0.988 | 0.989 | 0.99 | 0.991 | 0.992 | 0.994 |
| 38.4000000000004 | 0.987 | 0.987 | 0.987 | 0.988 | 0.988 | 0.988 | 0.989 | 0.99 | 0.991 | 0.992 | 0.994 |
| 38.42000000000041 | 0.987 | 0.987 | 0.987 | 0.988 | 0.988 | 0.988 | 0.989 | 0.99 | 0.991 | 0.992 | 0.994 |
| 38.44000000000041 | 0.987 | 0.987 | 0.987 | 0.988 | 0.988 | 0.988 | 0.989 | 0.99 | 0.991 | 0.992 | 0.994 |
| 38.46000000000041 | 0.987 | 0.987 | 0.987 | 0.988 | 0.988 | 0.988 | 0.989 | 0.99 | 0.991 | 0.992 | 0.994 |
| 38.48000000000042 | 0.987 | 0.987 | 0.987 | 0.988 | 0.988 | 0.988 | 0.989 | 0.99 | 0.991 | 0.992 | 0.994 |
| 38.50000000000042 | 0.987 | 0.987 | 0.987 | 0.988 | 0.988 | 0.988 | 0.989 | 0.99 | 0.991 | 0.992 | 0.994 |
| 38.52000000000042 | 0.987 | 0.987 | 0.987 | 0.988 | 0.988 | 0.988 | 0.989 | 0.99 | 0.991 | 0.992 | 0.994 |
| 38.54000000000043 | 0.987 | 0.987 | 0.987 | 0.988 | 0.988 | 0.988 | 0.989 | 0.99 | 0.991 | 0.992 | 0.994 |
| 38.56000000000043 | 0.987 | 0.987 | 0.987 | 0.988 | 0.988 | 0.988 | 0.989 | 0.99 | 0.991 | 0.992 | 0.994 |
| 38.58000000000043 | 0.987 | 0.987 | 0.987 | 0.988 | 0.988 | 0.988 | 0.989 | 0.99 | 0.991 | 0.992 | 0.994 |
| 38.60000000000043 | 0.987 | 0.987 | 0.987 | 0.988 | 0.988 | 0.988 | 0.989 | 0.99 | 0.991 | 0.992 | 0.994 |
| 38.62000000000044 | 0.987 | 0.987 | 0.987 | 0.988 | 0.988 | 0.988 | 0.989 | 0.99 | 0.991 | 0.992 | 0.994 |
| 38.64000000000044 | 0.987 | 0.987 | 0.987 | 0.988 | 0.988 | 0.988 | 0.989 | 0.99 | 0.991 | 0.992 | 0.994 |
| 38.66000000000044 | 0.987 | 0.987 | 0.987 | 0.988 | 0.988 | 0.988 | 0.989 | 0.99 | 0.991 | 0.992 | 0.994 |
| 38.68000000000045 | 0.987 | 0.987 | 0.987 | 0.988 | 0.988 | 0.988 | 0.989 | 0.99 | 0.991 | 0.992 | 0.994 |
| 38.70000000000045 | 0.987 | 0.987 | 0.987 | 0.988 | 0.988 | 0.988 | 0.989 | 0.99 | 0.991 | 0.992 | 0.994 |
| 38.72000000000045 | 0.987 | 0.987 | 0.987 | 0.988 | 0.988 | 0.988 | 0.989 | 0.99 | 0.991 | 0.992 | 0.994 |
| 38.74000000000046 | 0.987 | 0.987 | 0.987 | 0.988 | 0.988 | 0.988 | 0.989 | 0.99 | 0.991 | 0.992 | 0.994 |
| 38.76000000000046 | 0.987 | 0.987 | 0.987 | 0.988 | 0.988 | 0.988 | 0.989 | 0.99 | 0.991 | 0.992 | 0.994 |
| 38.78000000000046 | 0.987 | 0.987 | 0.987 | 0.988 | 0.988 | 0.988 | 0.989 | 0.99 | 0.991 | 0.992 | 0.994 |
| 38.80000000000047 | 0.987 | 0.987 | 0.987 | 0.988 | 0.988 | 0.988 | 0.989 | 0.99 | 0.991 | 0.992 | 0.994 |
| 38.82000000000047 | 0.987 | 0.987 | 0.987 | 0.988 | 0.988 | 0.988 | 0.989 | 0.99 | 0.991 | 0.992 | 0.994 |
| 38.84000000000047 | 0.987 | 0.987 | 0.987 | 0.988 | 0.988 | 0.988 | 0.989 | 0.99 | 0.991 | 0.992 | 0.994 |
| 38.86000000000048 | 0.987 | 0.987 | 0.987 | 0.988 | 0.988 | 0.988 | 0.989 | 0.99 | 0.991 | 0.992 | 0.994 |
| 38.88000000000048 | 0.987 | 0.987 | 0.987 | 0.988 | 0.988 | 0.988 | 0.989 | 0.99 | 0.991 | 0.992 | 0.994 |
| 38.90000000000048 | 0.987 | 0.987 | 0.987 | 0.988 | 0.988 | 0.988 | 0.989 | 0.99 | 0.991 | 0.992 | 0.994 |
| 38.92000000000048 | 0.987 | 0.987 | 0.987 | 0.988 | 0.988 | 0.988 | 0.989 | 0.99 | 0.991 | 0.992 | 0.994 |
| 38.94000000000049 | 0.987 | 0.987 | 0.987 | 0.988 | 0.988 | 0.988 | 0.989 | 0.99 | 0.991 | 0.992 | 0.994 |
| 38.9600000000005 | 0.987 | 0.987 | 0.987 | 0.988 | 0.988 | 0.988 | 0.989 | 0.99 | 0.991 | 0.992 | 0.994 |
| 38.98000000000049 | 0.987 | 0.987 | 0.987 | 0.988 | 0.988 | 0.988 | 0.989 | 0.99 | 0.991 | 0.992 | 0.994 |
| 39.0000000000005 | 0.987 | 0.987 | 0.987 | 0.988 | 0.988 | 0.988 | 0.989 | 0.99 | 0.991 | 0.992 | 0.994 |
| 39.0200000000005 | 0.987 | 0.987 | 0.987 | 0.988 | 0.988 | 0.988 | 0.989 | 0.99 | 0.991 | 0.992 | 0.994 |
| 39.0400000000005 | 0.987 | 0.987 | 0.987 | 0.988 | 0.988 | 0.988 | 0.989 | 0.99 | 0.991 | 0.992 | 0.994 |
| 39.06000000000051 | 0.987 | 0.987 | 0.987 | 0.988 | 0.988 | 0.988 | 0.989 | 0.99 | 0.991 | 0.992 | 0.994 |
| 39.08000000000051 | 0.987 | 0.987 | 0.987 | 0.988 | 0.988 | 0.988 | 0.989 | 0.99 | 0.991 | 0.992 | 0.994 |
| 39.10000000000051 | 0.987 | 0.987 | 0.987 | 0.988 | 0.988 | 0.988 | 0.989 | 0.99 | 0.991 | 0.992 | 0.994 |
| 39.12000000000052 | 0.987 | 0.987 | 0.987 | 0.988 | 0.988 | 0.988 | 0.989 | 0.99 | 0.991 | 0.992 | 0.994 |
| 39.14000000000052 | 0.987 | 0.987 | 0.987 | 0.988 | 0.988 | 0.988 | 0.989 | 0.99 | 0.991 | 0.992 | 0.994 |
| 39.16000000000052 | 0.987 | 0.987 | 0.987 | 0.988 | 0.988 | 0.988 | 0.989 | 0.99 | 0.991 | 0.992 | 0.994 |
| 39.18000000000053 | 0.987 | 0.987 | 0.987 | 0.988 | 0.988 | 0.988 | 0.989 | 0.99 | 0.991 | 0.992 | 0.994 |
| 39.20000000000053 | 0.987 | 0.987 | 0.987 | 0.988 | 0.988 | 0.988 | 0.989 | 0.99 | 0.991 | 0.992 | 0.994 |
| 39.22000000000053 | 0.987 | 0.987 | 0.987 | 0.988 | 0.988 | 0.988 | 0.989 | 0.99 | 0.991 | 0.992 | 0.994 |
| 39.24000000000053 | 0.987 | 0.987 | 0.987 | 0.988 | 0.988 | 0.988 | 0.989 | 0.99 | 0.991 | 0.992 | 0.994 |
| 39.26000000000054 | 0.987 | 0.987 | 0.988 | 0.988 | 0.988 | 0.988 | 0.989 | 0.99 | 0.991 | 0.992 | 0.994 |
| 39.28000000000054 | 0.987 | 0.987 | 0.988 | 0.988 | 0.988 | 0.988 | 0.989 | 0.99 | 0.991 | 0.992 | 0.994 |
| 39.30000000000054 | 0.987 | 0.987 | 0.988 | 0.988 | 0.988 | 0.988 | 0.989 | 0.99 | 0.991 | 0.992 | 0.994 |
| 39.32000000000055 | 0.987 | 0.987 | 0.988 | 0.988 | 0.988 | 0.988 | 0.989 | 0.99 | 0.991 | 0.992 | 0.994 |
| 39.34000000000055 | 0.987 | 0.987 | 0.988 | 0.988 | 0.988 | 0.988 | 0.989 | 0.99 | 0.991 | 0.992 | 0.994 |
| 39.36000000000055 | 0.987 | 0.987 | 0.988 | 0.988 | 0.988 | 0.988 | 0.989 | 0.99 | 0.991 | 0.992 | 0.994 |
| 39.38000000000056 | 0.987 | 0.987 | 0.988 | 0.988 | 0.988 | 0.988 | 0.989 | 0.99 | 0.991 | 0.992 | 0.994 |
| 39.40000000000056 | 0.987 | 0.987 | 0.988 | 0.988 | 0.988 | 0.988 | 0.989 | 0.99 | 0.991 | 0.992 | 0.994 |
| 39.42000000000056 | 0.987 | 0.987 | 0.988 | 0.988 | 0.988 | 0.989 | 0.989 | 0.99 | 0.991 | 0.992 | 0.994 |
| 39.44000000000057 | 0.987 | 0.987 | 0.988 | 0.988 | 0.988 | 0.989 | 0.989 | 0.99 | 0.991 | 0.992 | 0.994 |
| 39.46000000000057 | 0.987 | 0.987 | 0.988 | 0.988 | 0.988 | 0.989 | 0.989 | 0.99 | 0.991 | 0.992 | 0.994 |
| 39.48000000000057 | 0.987 | 0.987 | 0.988 | 0.988 | 0.988 | 0.989 | 0.989 | 0.99 | 0.991 | 0.992 | 0.994 |
| 39.50000000000058 | 0.987 | 0.987 | 0.988 | 0.988 | 0.988 | 0.989 | 0.989 | 0.99 | 0.991 | 0.992 | 0.994 |
| 39.52000000000058 | 0.987 | 0.987 | 0.988 | 0.988 | 0.988 | 0.989 | 0.989 | 0.99 | 0.991 | 0.992 | 0.994 |
| 39.54000000000058 | 0.987 | 0.987 | 0.988 | 0.988 | 0.988 | 0.989 | 0.989 | 0.99 | 0.991 | 0.992 | 0.994 |
| 39.56000000000058 | 0.987 | 0.987 | 0.988 | 0.988 | 0.988 | 0.989 | 0.989 | 0.99 | 0.991 | 0.992 | 0.994 |
| 39.58000000000059 | 0.987 | 0.987 | 0.988 | 0.988 | 0.988 | 0.989 | 0.989 | 0.99 | 0.991 | 0.992 | 0.994 |
| 39.6000000000006 | 0.987 | 0.987 | 0.988 | 0.988 | 0.988 | 0.989 | 0.989 | 0.99 | 0.991 | 0.992 | 0.994 |
| 39.6200000000006 | 0.987 | 0.987 | 0.988 | 0.988 | 0.988 | 0.989 | 0.989 | 0.99 | 0.991 | 0.992 | 0.994 |
| 39.6400000000006 | 0.987 | 0.987 | 0.988 | 0.988 | 0.988 | 0.989 | 0.989 | 0.99 | 0.991 | 0.992 | 0.994 |
| 39.6600000000006 | 0.987 | 0.987 | 0.988 | 0.988 | 0.988 | 0.989 | 0.989 | 0.99 | 0.991 | 0.992 | 0.994 |
| 39.6800000000006 | 0.987 | 0.987 | 0.988 | 0.988 | 0.988 | 0.989 | 0.989 | 0.99 | 0.991 | 0.992 | 0.994 |
| 39.70000000000061 | 0.987 | 0.987 | 0.988 | 0.988 | 0.988 | 0.989 | 0.989 | 0.99 | 0.991 | 0.992 | 0.994 |
| 39.72000000000061 | 0.987 | 0.987 | 0.988 | 0.988 | 0.988 | 0.989 | 0.989 | 0.99 | 0.991 | 0.992 | 0.994 |
| 39.74000000000061 | 0.987 | 0.987 | 0.988 | 0.988 | 0.988 | 0.989 | 0.989 | 0.99 | 0.991 | 0.992 | 0.994 |
| 39.76000000000062 | 0.987 | 0.987 | 0.988 | 0.988 | 0.988 | 0.989 | 0.989 | 0.99 | 0.991 | 0.992 | 0.994 |
| 39.78000000000062 | 0.987 | 0.987 | 0.988 | 0.988 | 0.988 | 0.989 | 0.989 | 0.99 | 0.991 | 0.992 | 0.994 |
| 39.80000000000062 | 0.987 | 0.987 | 0.988 | 0.988 | 0.988 | 0.989 | 0.989 | 0.99 | 0.991 | 0.992 | 0.994 |
| 39.82000000000063 | 0.987 | 0.987 | 0.988 | 0.988 | 0.988 | 0.989 | 0.989 | 0.99 | 0.991 | 0.992 | 0.994 |
| 39.84000000000063 | 0.987 | 0.987 | 0.988 | 0.988 | 0.988 | 0.989 | 0.989 | 0.99 | 0.991 | 0.992 | 0.994 |
| 39.86000000000063 | 0.987 | 0.987 | 0.988 | 0.988 | 0.988 | 0.989 | 0.989 | 0.99 | 0.991 | 0.992 | 0.994 |
| 39.88000000000063 | 0.987 | 0.987 | 0.988 | 0.988 | 0.988 | 0.989 | 0.989 | 0.99 | 0.991 | 0.992 | 0.994 |
| 39.90000000000064 | 0.987 | 0.987 | 0.988 | 0.988 | 0.988 | 0.989 | 0.989 | 0.99 | 0.991 | 0.992 | 0.994 |
| 39.92000000000064 | 0.987 | 0.987 | 0.988 | 0.988 | 0.988 | 0.989 | 0.989 | 0.99 | 0.991 | 0.992 | 0.994 |
| 39.94000000000064 | 0.987 | 0.987 | 0.988 | 0.988 | 0.988 | 0.989 | 0.989 | 0.99 | 0.991 | 0.992 | 0.994 |
| 39.96000000000065 | 0.987 | 0.987 | 0.988 | 0.988 | 0.988 | 0.989 | 0.989 | 0.99 | 0.991 | 0.992 | 0.994 |
| 39.98000000000065 | 0.987 | 0.987 | 0.988 | 0.988 | 0.988 | 0.989 | 0.989 | 0.99 | 0.991 | 0.992 | 0.994 |
| 40.00000000000065 | 0.987 | 0.987 | 0.988 | 0.988 | 0.988 | 0.989 | 0.989 | 0.99 | 0.991 | 0.992 | 0.994 |
| 40.02000000000066 | 0.987 | 0.988 | 0.988 | 0.988 | 0.988 | 0.989 | 0.989 | 0.99 | 0.991 | 0.992 | 0.994 |
| 40.04000000000066 | 0.987 | 0.988 | 0.988 | 0.988 | 0.988 | 0.989 | 0.989 | 0.99 | 0.991 | 0.992 | 0.994 |
| 40.06000000000066 | 0.987 | 0.988 | 0.988 | 0.988 | 0.988 | 0.989 | 0.989 | 0.99 | 0.991 | 0.992 | 0.994 |
| 40.08000000000067 | 0.987 | 0.988 | 0.988 | 0.988 | 0.988 | 0.989 | 0.989 | 0.99 | 0.991 | 0.992 | 0.994 |
| 40.10000000000067 | 0.987 | 0.988 | 0.988 | 0.988 | 0.988 | 0.989 | 0.989 | 0.99 | 0.991 | 0.992 | 0.994 |
| 40.12000000000067 | 0.987 | 0.988 | 0.988 | 0.988 | 0.988 | 0.989 | 0.989 | 0.99 | 0.991 | 0.992 | 0.994 |
| 40.14000000000068 | 0.987 | 0.988 | 0.988 | 0.988 | 0.988 | 0.989 | 0.989 | 0.99 | 0.991 | 0.992 | 0.994 |
| 40.16000000000068 | 0.987 | 0.988 | 0.988 | 0.988 | 0.988 | 0.989 | 0.989 | 0.99 | 0.991 | 0.992 | 0.994 |
| 40.18000000000068 | 0.987 | 0.988 | 0.988 | 0.988 | 0.988 | 0.989 | 0.989 | 0.99 | 0.991 | 0.992 | 0.994 |
| 40.20000000000068 | 0.987 | 0.988 | 0.988 | 0.988 | 0.988 | 0.989 | 0.989 | 0.99 | 0.991 | 0.992 | 0.994 |
| 40.22000000000069 | 0.987 | 0.988 | 0.988 | 0.988 | 0.988 | 0.989 | 0.989 | 0.99 | 0.991 | 0.992 | 0.994 |
| 40.2400000000007 | 0.987 | 0.988 | 0.988 | 0.988 | 0.988 | 0.989 | 0.989 | 0.99 | 0.991 | 0.992 | 0.994 |
| 40.2600000000007 | 0.988 | 0.988 | 0.988 | 0.988 | 0.988 | 0.989 | 0.989 | 0.99 | 0.991 | 0.992 | 0.994 |
| 40.2800000000007 | 0.988 | 0.988 | 0.988 | 0.988 | 0.988 | 0.989 | 0.989 | 0.99 | 0.991 | 0.992 | 0.994 |
| 40.3000000000007 | 0.988 | 0.988 | 0.988 | 0.988 | 0.988 | 0.989 | 0.989 | 0.99 | 0.991 | 0.992 | 0.994 |
| 40.3200000000007 | 0.988 | 0.988 | 0.988 | 0.988 | 0.988 | 0.989 | 0.989 | 0.99 | 0.991 | 0.992 | 0.994 |
| 40.34000000000071 | 0.988 | 0.988 | 0.988 | 0.988 | 0.988 | 0.989 | 0.989 | 0.99 | 0.991 | 0.992 | 0.994 |
| 40.36000000000071 | 0.988 | 0.988 | 0.988 | 0.988 | 0.988 | 0.989 | 0.989 | 0.99 | 0.991 | 0.992 | 0.994 |
| 40.38000000000071 | 0.988 | 0.988 | 0.988 | 0.988 | 0.988 | 0.989 | 0.989 | 0.99 | 0.991 | 0.992 | 0.994 |
| 40.40000000000072 | 0.988 | 0.988 | 0.988 | 0.988 | 0.988 | 0.989 | 0.989 | 0.99 | 0.991 | 0.992 | 0.994 |
| 40.42000000000072 | 0.988 | 0.988 | 0.988 | 0.988 | 0.988 | 0.989 | 0.989 | 0.99 | 0.991 | 0.992 | 0.994 |
| 40.44000000000072 | 0.988 | 0.988 | 0.988 | 0.988 | 0.988 | 0.989 | 0.989 | 0.99 | 0.991 | 0.992 | 0.994 |
| 40.46000000000072 | 0.988 | 0.988 | 0.988 | 0.988 | 0.988 | 0.989 | 0.989 | 0.99 | 0.991 | 0.992 | 0.994 |
| 40.48000000000073 | 0.988 | 0.988 | 0.988 | 0.988 | 0.988 | 0.989 | 0.989 | 0.99 | 0.991 | 0.992 | 0.994 |
| 40.50000000000073 | 0.988 | 0.988 | 0.988 | 0.988 | 0.988 | 0.989 | 0.989 | 0.99 | 0.991 | 0.992 | 0.994 |
| 40.52000000000073 | 0.988 | 0.988 | 0.988 | 0.988 | 0.988 | 0.989 | 0.989 | 0.99 | 0.991 | 0.992 | 0.994 |
| 40.54000000000074 | 0.988 | 0.988 | 0.988 | 0.988 | 0.988 | 0.989 | 0.989 | 0.99 | 0.991 | 0.992 | 0.994 |
| 40.56000000000074 | 0.988 | 0.988 | 0.988 | 0.988 | 0.988 | 0.989 | 0.989 | 0.99 | 0.991 | 0.992 | 0.994 |
| 40.58000000000074 | 0.988 | 0.988 | 0.988 | 0.988 | 0.989 | 0.989 | 0.989 | 0.99 | 0.991 | 0.992 | 0.994 |
| 40.60000000000074 | 0.988 | 0.988 | 0.988 | 0.988 | 0.989 | 0.989 | 0.989 | 0.99 | 0.991 | 0.992 | 0.994 |
| 40.62000000000075 | 0.988 | 0.988 | 0.988 | 0.988 | 0.989 | 0.989 | 0.989 | 0.99 | 0.991 | 0.992 | 0.994 |
| 40.64000000000075 | 0.988 | 0.988 | 0.988 | 0.988 | 0.989 | 0.989 | 0.989 | 0.99 | 0.991 | 0.992 | 0.994 |
| 40.66000000000075 | 0.988 | 0.988 | 0.988 | 0.988 | 0.989 | 0.989 | 0.989 | 0.99 | 0.991 | 0.992 | 0.994 |
| 40.68000000000076 | 0.988 | 0.988 | 0.988 | 0.988 | 0.989 | 0.989 | 0.989 | 0.99 | 0.991 | 0.992 | 0.994 |
| 40.70000000000076 | 0.988 | 0.988 | 0.988 | 0.988 | 0.989 | 0.989 | 0.99 | 0.99 | 0.991 | 0.992 | 0.994 |
| 40.72000000000076 | 0.988 | 0.988 | 0.988 | 0.988 | 0.989 | 0.989 | 0.99 | 0.99 | 0.991 | 0.992 | 0.994 |
| 40.74000000000077 | 0.988 | 0.988 | 0.988 | 0.988 | 0.989 | 0.989 | 0.99 | 0.99 | 0.991 | 0.992 | 0.994 |
| 40.76000000000077 | 0.988 | 0.988 | 0.988 | 0.988 | 0.989 | 0.989 | 0.99 | 0.99 | 0.991 | 0.992 | 0.994 |
| 40.78000000000077 | 0.988 | 0.988 | 0.988 | 0.988 | 0.989 | 0.989 | 0.99 | 0.99 | 0.991 | 0.992 | 0.994 |
| 40.80000000000078 | 0.988 | 0.988 | 0.988 | 0.988 | 0.989 | 0.989 | 0.99 | 0.99 | 0.991 | 0.992 | 0.994 |
| 40.82000000000078 | 0.988 | 0.988 | 0.988 | 0.988 | 0.989 | 0.989 | 0.99 | 0.99 | 0.991 | 0.992 | 0.994 |
| 40.84000000000078 | 0.988 | 0.988 | 0.988 | 0.988 | 0.989 | 0.989 | 0.99 | 0.99 | 0.991 | 0.992 | 0.994 |
| 40.86000000000079 | 0.988 | 0.988 | 0.988 | 0.988 | 0.989 | 0.989 | 0.99 | 0.99 | 0.991 | 0.992 | 0.994 |
| 40.8800000000008 | 0.988 | 0.988 | 0.988 | 0.988 | 0.989 | 0.989 | 0.99 | 0.99 | 0.991 | 0.992 | 0.994 |
| 40.9000000000008 | 0.988 | 0.988 | 0.988 | 0.988 | 0.989 | 0.989 | 0.99 | 0.99 | 0.991 | 0.992 | 0.994 |
| 40.9200000000008 | 0.988 | 0.988 | 0.988 | 0.988 | 0.989 | 0.989 | 0.99 | 0.99 | 0.991 | 0.992 | 0.994 |
| 40.9400000000008 | 0.988 | 0.988 | 0.988 | 0.988 | 0.989 | 0.989 | 0.99 | 0.99 | 0.991 | 0.992 | 0.994 |
| 40.9600000000008 | 0.988 | 0.988 | 0.988 | 0.988 | 0.989 | 0.989 | 0.99 | 0.99 | 0.991 | 0.992 | 0.994 |
| 40.98000000000081 | 0.988 | 0.988 | 0.988 | 0.988 | 0.989 | 0.989 | 0.99 | 0.99 | 0.991 | 0.992 | 0.994 |
| 41.00000000000081 | 0.988 | 0.988 | 0.988 | 0.988 | 0.989 | 0.989 | 0.99 | 0.99 | 0.991 | 0.992 | 0.994 |